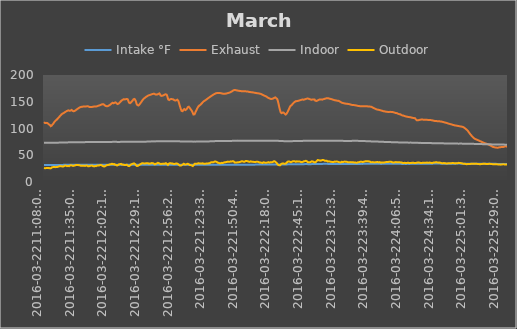
| Category | Intake °F | Exhaust | Indoor | Outdoor |
|---|---|---|---|---|
| 2016-03-2211:08:03 AM | 31.888 | 111.875 | 73.512 | 26.375 |
| 2016-03-2211:08:09 AM | 31.888 | 111.875 | 73.512 | 26.375 |
| 2016-03-2211:08:16 AM | 31.888 | 111.875 | 73.4 | 26.262 |
| 2016-03-2211:08:22 AM | 31.888 | 111.762 | 73.4 | 26.038 |
| 2016-03-2211:08:28 AM | 31.888 | 111.425 | 73.4 | 25.812 |
| 2016-03-2211:08:34 AM | 31.888 | 111.088 | 73.4 | 25.475 |
| 2016-03-2211:08:40 AM | 31.888 | 110.75 | 73.4 | 25.362 |
| 2016-03-2211:08:47 AM | 31.888 | 110.3 | 73.4 | 25.475 |
| 2016-03-2211:08:53 AM | 31.888 | 110.188 | 73.4 | 25.7 |
| 2016-03-2211:08:59 AM | 31.888 | 110.075 | 73.4 | 25.925 |
| 2016-03-2211:09:05 AM | 31.888 | 109.962 | 73.4 | 26.038 |
| 2016-03-2211:09:11 AM | 31.888 | 110.075 | 73.4 | 26.038 |
| 2016-03-2211:09:18 AM | 31.888 | 110.188 | 73.4 | 26.038 |
| 2016-03-2211:09:24 AM | 31.888 | 110.413 | 73.4 | 26.15 |
| 2016-03-2211:09:30 AM | 31.888 | 110.525 | 73.4 | 26.15 |
| 2016-03-2211:09:36 AM | 31.888 | 110.525 | 73.4 | 26.038 |
| 2016-03-2211:09:43 AM | 31.888 | 110.525 | 73.4 | 26.038 |
| 2016-03-2211:09:49 AM | 31.888 | 110.638 | 73.4 | 26.038 |
| 2016-03-2211:09:55 AM | 31.888 | 110.75 | 73.4 | 26.038 |
| 2016-03-2211:10:01 AM | 32 | 110.862 | 73.4 | 26.15 |
| 2016-03-2211:10:07 AM | 31.888 | 110.862 | 73.4 | 26.262 |
| 2016-03-2211:10:14 AM | 31.888 | 110.862 | 73.4 | 26.262 |
| 2016-03-2211:10:20 AM | 31.888 | 110.75 | 73.4 | 26.262 |
| 2016-03-2211:10:26 AM | 31.888 | 110.638 | 73.4 | 26.375 |
| 2016-03-2211:10:32 AM | 31.888 | 110.413 | 73.4 | 26.15 |
| 2016-03-2211:10:38 AM | 31.888 | 110.3 | 73.4 | 26.262 |
| 2016-03-2211:10:45 AM | 31.888 | 110.075 | 73.4 | 26.375 |
| 2016-03-2211:10:51 AM | 31.888 | 110.188 | 73.4 | 26.488 |
| 2016-03-2211:10:57 AM | 31.888 | 110.075 | 73.4 | 26.488 |
| 2016-03-2211:11:03 AM | 31.888 | 110.075 | 73.4 | 26.375 |
| 2016-03-2211:11:10 AM | 31.888 | 109.85 | 73.4 | 26.15 |
| 2016-03-2211:11:16 AM | 31.888 | 109.512 | 73.4 | 26.038 |
| 2016-03-2211:11:22 AM | 31.888 | 109.175 | 73.4 | 25.925 |
| 2016-03-2211:11:28 AM | 31.888 | 108.725 | 73.4 | 25.812 |
| 2016-03-2211:11:34 AM | 31.888 | 108.275 | 73.4 | 25.588 |
| 2016-03-2211:11:41 AM | 31.888 | 107.938 | 73.288 | 25.588 |
| 2016-03-2211:11:47 AM | 31.888 | 107.825 | 73.4 | 25.812 |
| 2016-03-2211:11:53 AM | 31.888 | 107.6 | 73.4 | 26.15 |
| 2016-03-2211:11:59 AM | 31.888 | 107.488 | 73.4 | 26.262 |
| 2016-03-2211:12:06 AM | 31.888 | 107.488 | 73.4 | 26.375 |
| 2016-03-2211:12:12 AM | 31.888 | 107.375 | 73.288 | 26.15 |
| 2016-03-2211:12:18 AM | 31.888 | 107.15 | 73.288 | 25.925 |
| 2016-03-2211:12:24 AM | 31.888 | 107.038 | 73.288 | 25.812 |
| 2016-03-2211:12:30 AM | 31.888 | 107.038 | 73.288 | 25.925 |
| 2016-03-2211:12:37 AM | 31.888 | 107.038 | 73.288 | 26.15 |
| 2016-03-2211:12:43 AM | 31.888 | 106.925 | 73.288 | 26.038 |
| 2016-03-2211:12:49 AM | 31.888 | 106.812 | 73.288 | 25.925 |
| 2016-03-2211:12:55 AM | 31.888 | 106.588 | 73.288 | 25.588 |
| 2016-03-2211:13:02 AM | 31.888 | 106.25 | 73.288 | 25.475 |
| 2016-03-2211:13:08 AM | 31.888 | 105.913 | 73.288 | 25.475 |
| 2016-03-2211:13:14 AM | 31.888 | 105.575 | 73.288 | 25.475 |
| 2016-03-2211:13:20 AM | 31.888 | 105.125 | 73.288 | 25.362 |
| 2016-03-2211:13:26 AM | 31.888 | 104.788 | 73.288 | 25.25 |
| 2016-03-2211:13:33 AM | 31.888 | 104.338 | 73.288 | 25.25 |
| 2016-03-2211:13:39 AM | 31.888 | 104.225 | 73.288 | 25.475 |
| 2016-03-2211:13:45 AM | 31.888 | 104.225 | 73.175 | 25.7 |
| 2016-03-2211:13:51 AM | 31.888 | 104.225 | 73.288 | 25.925 |
| 2016-03-2211:13:58 AM | 31.888 | 104.338 | 73.288 | 26.038 |
| 2016-03-2211:14:04 AM | 31.888 | 104.562 | 73.288 | 26.15 |
| 2016-03-2211:14:10 AM | 31.888 | 104.788 | 73.288 | 26.262 |
| 2016-03-2211:14:16 AM | 32 | 105.012 | 73.288 | 26.375 |
| 2016-03-2211:14:22 AM | 31.888 | 105.35 | 73.288 | 26.712 |
| 2016-03-2211:14:29 AM | 31.888 | 105.688 | 73.288 | 27.05 |
| 2016-03-2211:14:35 AM | 31.888 | 106.025 | 73.288 | 27.162 |
| 2016-03-2211:14:41 AM | 31.888 | 106.475 | 73.288 | 27.388 |
| 2016-03-2211:14:47 AM | 31.888 | 106.812 | 73.288 | 27.725 |
| 2016-03-2211:14:54 AM | 31.888 | 107.262 | 73.288 | 27.95 |
| 2016-03-2211:15:00 AM | 31.888 | 107.825 | 73.288 | 27.95 |
| 2016-03-2211:15:06 AM | 31.888 | 108.163 | 73.288 | 28.062 |
| 2016-03-2211:15:12 AM | 32 | 108.388 | 73.288 | 27.95 |
| 2016-03-2211:15:18 AM | 31.888 | 108.5 | 73.288 | 27.725 |
| 2016-03-2211:15:25 AM | 32 | 108.5 | 73.288 | 27.725 |
| 2016-03-2211:15:31 AM | 31.888 | 108.612 | 73.288 | 27.725 |
| 2016-03-2211:15:37 AM | 31.888 | 108.838 | 73.288 | 27.838 |
| 2016-03-2211:15:43 AM | 31.888 | 109.062 | 73.4 | 27.95 |
| 2016-03-2211:15:49 AM | 31.888 | 109.4 | 73.288 | 28.062 |
| 2016-03-2211:15:56 AM | 32 | 109.738 | 73.4 | 28.288 |
| 2016-03-2211:16:02 AM | 31.888 | 110.075 | 73.4 | 28.288 |
| 2016-03-2211:16:08 AM | 31.888 | 110.413 | 73.4 | 28.4 |
| 2016-03-2211:16:14 AM | 32 | 110.862 | 73.4 | 28.288 |
| 2016-03-2211:16:21 AM | 32 | 111.2 | 73.512 | 28.175 |
| 2016-03-2211:16:27 AM | 32 | 111.538 | 73.512 | 27.95 |
| 2016-03-2211:16:33 AM | 32 | 111.988 | 73.512 | 27.725 |
| 2016-03-2211:16:39 AM | 32 | 112.325 | 73.4 | 27.725 |
| 2016-03-2211:16:46 AM | 32 | 112.663 | 73.4 | 27.95 |
| 2016-03-2211:16:52 AM | 32 | 113.112 | 73.4 | 28.175 |
| 2016-03-2211:16:58 AM | 32 | 113.338 | 73.512 | 28.062 |
| 2016-03-2211:17:04 AM | 32 | 113.562 | 73.512 | 27.95 |
| 2016-03-2211:17:10 AM | 31.888 | 113.675 | 73.512 | 27.725 |
| 2016-03-2211:17:17 AM | 31.888 | 113.788 | 73.512 | 27.838 |
| 2016-03-2211:17:23 AM | 32 | 114.125 | 73.512 | 27.725 |
| 2016-03-2211:17:29 AM | 32 | 114.35 | 73.512 | 27.612 |
| 2016-03-2211:17:35 AM | 31.888 | 114.575 | 73.512 | 27.725 |
| 2016-03-2211:17:42 AM | 32 | 114.8 | 73.512 | 27.838 |
| 2016-03-2211:17:48 AM | 32 | 115.138 | 73.512 | 28.062 |
| 2016-03-2211:17:54 AM | 31.888 | 115.362 | 73.512 | 28.062 |
| 2016-03-2211:18:00 AM | 32 | 115.7 | 73.512 | 27.95 |
| 2016-03-2211:18:06 AM | 31.888 | 115.812 | 73.512 | 27.95 |
| 2016-03-2211:18:13 AM | 32 | 115.925 | 73.512 | 27.838 |
| 2016-03-2211:18:19 AM | 32 | 116.038 | 73.512 | 27.95 |
| 2016-03-2211:18:25 AM | 32 | 116.262 | 73.512 | 27.725 |
| 2016-03-2211:18:31 AM | 32 | 116.488 | 73.512 | 27.725 |
| 2016-03-2211:18:38 AM | 32 | 116.6 | 73.512 | 27.838 |
| 2016-03-2211:18:44 AM | 32 | 116.938 | 73.512 | 27.95 |
| 2016-03-2211:18:50 AM | 32 | 117.05 | 73.512 | 28.062 |
| 2016-03-2211:18:56 AM | 32 | 117.388 | 73.512 | 28.175 |
| 2016-03-2211:19:02 AM | 32 | 117.612 | 73.512 | 28.288 |
| 2016-03-2211:19:09 AM | 32 | 117.95 | 73.512 | 28.288 |
| 2016-03-2211:19:15 AM | 32 | 118.175 | 73.512 | 28.4 |
| 2016-03-2211:19:21 AM | 32 | 118.4 | 73.512 | 28.288 |
| 2016-03-2211:19:27 AM | 32 | 118.625 | 73.512 | 28.4 |
| 2016-03-2211:19:34 AM | 32 | 118.962 | 73.512 | 28.512 |
| 2016-03-2211:19:40 AM | 32 | 119.188 | 73.512 | 28.512 |
| 2016-03-2211:19:46 AM | 32 | 119.413 | 73.512 | 28.625 |
| 2016-03-2211:19:52 AM | 32 | 119.638 | 73.512 | 28.85 |
| 2016-03-2211:19:58 AM | 32 | 119.862 | 73.512 | 28.962 |
| 2016-03-2211:20:05 AM | 32 | 120.088 | 73.625 | 29.075 |
| 2016-03-2211:20:11 AM | 32 | 120.312 | 73.512 | 29.188 |
| 2016-03-2211:20:17 AM | 32 | 120.65 | 73.625 | 29.075 |
| 2016-03-2211:20:23 AM | 32 | 120.875 | 73.625 | 29.3 |
| 2016-03-2211:20:29 AM | 32 | 121.212 | 73.625 | 29.3 |
| 2016-03-2211:20:36 AM | 32 | 121.438 | 73.625 | 29.3 |
| 2016-03-2211:20:42 AM | 32 | 121.775 | 73.625 | 29.412 |
| 2016-03-2211:20:48 AM | 32 | 122.112 | 73.512 | 29.412 |
| 2016-03-2211:20:54 AM | 32 | 122.338 | 73.625 | 29.525 |
| 2016-03-2211:21:00 AM | 32 | 122.562 | 73.625 | 29.638 |
| 2016-03-2211:21:07 AM | 32 | 122.9 | 73.625 | 29.75 |
| 2016-03-2211:21:13 AM | 32 | 123.125 | 73.625 | 29.638 |
| 2016-03-2211:21:19 AM | 32 | 123.35 | 73.625 | 29.75 |
| 2016-03-2211:21:25 AM | 32 | 123.688 | 73.625 | 29.75 |
| 2016-03-2211:21:31 AM | 32 | 124.025 | 73.738 | 29.638 |
| 2016-03-2211:21:38 AM | 32 | 124.138 | 73.738 | 29.862 |
| 2016-03-2211:21:44 AM | 32 | 124.475 | 73.738 | 30.088 |
| 2016-03-2211:21:50 AM | 32 | 124.7 | 73.738 | 30.2 |
| 2016-03-2211:21:56 AM | 32 | 124.925 | 73.738 | 30.088 |
| 2016-03-2211:22:03 AM | 32 | 125.262 | 73.738 | 29.75 |
| 2016-03-2211:22:09 AM | 32 | 125.488 | 73.738 | 29.525 |
| 2016-03-2211:22:15 AM | 32 | 125.712 | 73.738 | 29.412 |
| 2016-03-2211:22:21 AM | 32 | 126.05 | 73.738 | 29.412 |
| 2016-03-2211:22:27 AM | 32 | 126.163 | 73.85 | 29.412 |
| 2016-03-2211:22:34 AM | 32 | 126.5 | 73.85 | 29.3 |
| 2016-03-2211:22:40 AM | 32 | 126.612 | 73.85 | 29.188 |
| 2016-03-2211:22:46 AM | 32 | 126.838 | 73.85 | 29.188 |
| 2016-03-2211:22:52 AM | 32 | 127.062 | 73.85 | 29.188 |
| 2016-03-2211:22:58 AM | 32 | 127.175 | 73.85 | 29.075 |
| 2016-03-2211:23:05 AM | 32 | 127.4 | 73.85 | 29.075 |
| 2016-03-2211:23:11 AM | 32.112 | 127.512 | 73.85 | 28.962 |
| 2016-03-2211:23:17 AM | 32 | 127.625 | 73.85 | 29.075 |
| 2016-03-2211:23:23 AM | 32 | 127.85 | 73.85 | 28.962 |
| 2016-03-2211:23:30 AM | 32.112 | 127.962 | 73.85 | 28.962 |
| 2016-03-2211:23:36 AM | 32.112 | 128.075 | 73.85 | 28.85 |
| 2016-03-2211:23:42 AM | 32.112 | 128.188 | 73.85 | 28.85 |
| 2016-03-2211:23:48 AM | 32 | 128.412 | 73.85 | 28.85 |
| 2016-03-2211:23:54 AM | 32 | 128.525 | 73.85 | 28.85 |
| 2016-03-2211:24:01 AM | 32 | 128.637 | 73.85 | 28.962 |
| 2016-03-2211:24:07 AM | 32 | 128.75 | 73.85 | 29.075 |
| 2016-03-2211:24:13 AM | 32 | 128.75 | 73.85 | 29.412 |
| 2016-03-2211:24:19 AM | 32 | 128.975 | 73.85 | 29.525 |
| 2016-03-2211:24:26 AM | 32 | 129.088 | 73.85 | 29.638 |
| 2016-03-2211:24:32 AM | 32.112 | 129.312 | 73.85 | 29.75 |
| 2016-03-2211:24:38 AM | 32.112 | 129.425 | 73.85 | 29.75 |
| 2016-03-2211:24:44 AM | 32.112 | 129.65 | 73.85 | 29.75 |
| 2016-03-2211:24:51 AM | 32.112 | 129.762 | 73.962 | 29.75 |
| 2016-03-2211:24:57 AM | 32.112 | 129.875 | 73.85 | 29.862 |
| 2016-03-2211:25:03 AM | 32 | 130.1 | 73.85 | 29.975 |
| 2016-03-2211:25:09 AM | 32.112 | 130.1 | 73.85 | 30.312 |
| 2016-03-2211:25:15 AM | 32.112 | 130.325 | 73.85 | 30.312 |
| 2016-03-2211:25:22 AM | 32 | 130.438 | 73.85 | 30.538 |
| 2016-03-2211:25:28 AM | 32.112 | 130.662 | 73.85 | 30.762 |
| 2016-03-2211:25:34 AM | 32.112 | 130.775 | 73.85 | 30.762 |
| 2016-03-2211:25:40 AM | 32 | 130.887 | 73.85 | 30.538 |
| 2016-03-2211:25:46 AM | 32.112 | 131.112 | 73.85 | 30.65 |
| 2016-03-2211:25:53 AM | 32.112 | 131.225 | 73.85 | 30.65 |
| 2016-03-2211:25:59 AM | 32.112 | 131.338 | 73.85 | 30.65 |
| 2016-03-2211:26:05 AM | 32.112 | 131.562 | 73.85 | 30.538 |
| 2016-03-2211:26:11 AM | 32.112 | 131.675 | 73.962 | 30.425 |
| 2016-03-2211:26:18 AM | 32.112 | 131.788 | 73.962 | 30.538 |
| 2016-03-2211:26:24 AM | 32.112 | 132.012 | 73.85 | 30.538 |
| 2016-03-2211:26:30 AM | 32.112 | 132.125 | 73.962 | 30.425 |
| 2016-03-2211:26:36 AM | 32.112 | 132.35 | 73.962 | 30.425 |
| 2016-03-2211:26:42 AM | 32.112 | 132.462 | 73.962 | 30.2 |
| 2016-03-2211:26:49 AM | 32.112 | 132.688 | 73.962 | 30.088 |
| 2016-03-2211:26:55 AM | 32.112 | 132.8 | 73.962 | 29.975 |
| 2016-03-2211:27:01 AM | 32 | 132.912 | 73.962 | 29.75 |
| 2016-03-2211:27:07 AM | 32.112 | 133.025 | 73.962 | 29.638 |
| 2016-03-2211:27:14 AM | 32.112 | 133.025 | 73.962 | 29.525 |
| 2016-03-2211:27:20 AM | 32.112 | 133.138 | 73.962 | 29.525 |
| 2016-03-2211:27:26 AM | 32.112 | 133.138 | 73.962 | 29.638 |
| 2016-03-2211:27:32 AM | 32.112 | 133.25 | 74.075 | 29.638 |
| 2016-03-2211:27:38 AM | 32.112 | 133.362 | 73.962 | 29.638 |
| 2016-03-2211:27:45 AM | 32.112 | 133.362 | 73.962 | 29.638 |
| 2016-03-2211:27:51 AM | 32.112 | 133.475 | 73.962 | 29.75 |
| 2016-03-2211:27:57 AM | 32.112 | 133.475 | 74.075 | 29.862 |
| 2016-03-2211:28:03 AM | 32.112 | 133.7 | 74.075 | 29.975 |
| 2016-03-2211:28:09 AM | 32.112 | 133.7 | 74.075 | 29.975 |
| 2016-03-2211:28:16 AM | 32.112 | 133.812 | 74.075 | 29.75 |
| 2016-03-2211:28:22 AM | 32.112 | 133.925 | 74.075 | 29.75 |
| 2016-03-2211:28:28 AM | 32.112 | 133.925 | 74.075 | 29.975 |
| 2016-03-2211:28:34 AM | 32.112 | 134.038 | 74.075 | 29.975 |
| 2016-03-2211:28:41 AM | 32 | 133.812 | 74.075 | 29.75 |
| 2016-03-2211:28:47 AM | 32.112 | 133.475 | 74.075 | 29.638 |
| 2016-03-2211:28:53 AM | 32.112 | 133.362 | 74.075 | 29.638 |
| 2016-03-2211:28:59 AM | 32.112 | 133.25 | 74.075 | 29.75 |
| 2016-03-2211:29:05 AM | 32.112 | 133.025 | 73.962 | 29.975 |
| 2016-03-2211:29:12 AM | 32.112 | 133.025 | 74.075 | 30.2 |
| 2016-03-2211:29:18 AM | 32.112 | 133.025 | 74.075 | 30.425 |
| 2016-03-2211:29:24 AM | 32.112 | 133.025 | 74.075 | 30.65 |
| 2016-03-2211:29:30 AM | 32.112 | 133.025 | 74.075 | 30.875 |
| 2016-03-2211:29:37 AM | 32.112 | 133.138 | 74.075 | 30.875 |
| 2016-03-2211:29:43 AM | 32.112 | 133.138 | 74.075 | 31.1 |
| 2016-03-2211:29:49 AM | 32.112 | 133.25 | 74.075 | 31.325 |
| 2016-03-2211:29:55 AM | 32.112 | 133.362 | 74.075 | 31.438 |
| 2016-03-2211:30:01 AM | 32.112 | 133.475 | 74.075 | 31.438 |
| 2016-03-2211:30:08 AM | 32.112 | 133.588 | 74.075 | 31.438 |
| 2016-03-2211:30:14 AM | 32.112 | 133.812 | 74.075 | 31.325 |
| 2016-03-2211:30:20 AM | 32.112 | 133.925 | 74.075 | 31.325 |
| 2016-03-2211:30:26 AM | 32.112 | 134.15 | 74.075 | 31.438 |
| 2016-03-2211:30:33 AM | 32.112 | 134.262 | 74.075 | 31.438 |
| 2016-03-2211:30:39 AM | 32.112 | 134.375 | 74.075 | 31.662 |
| 2016-03-2211:30:45 AM | 32.112 | 134.6 | 74.075 | 31.775 |
| 2016-03-2211:30:51 AM | 32.112 | 134.712 | 74.075 | 31.662 |
| 2016-03-2211:30:57 AM | 32.112 | 134.825 | 74.075 | 31.55 |
| 2016-03-2211:31:04 AM | 32.112 | 134.712 | 74.188 | 31.438 |
| 2016-03-2211:31:10 AM | 32.112 | 134.488 | 74.075 | 31.1 |
| 2016-03-2211:31:16 AM | 32.112 | 134.262 | 74.075 | 30.875 |
| 2016-03-2211:31:22 AM | 32.112 | 133.925 | 74.075 | 30.425 |
| 2016-03-2211:31:29 AM | 32.112 | 133.588 | 74.075 | 29.975 |
| 2016-03-2211:31:35 AM | 32.112 | 133.362 | 74.075 | 29.75 |
| 2016-03-2211:31:41 AM | 32.112 | 133.138 | 74.075 | 29.862 |
| 2016-03-2211:31:47 AM | 32.112 | 133.025 | 74.075 | 29.975 |
| 2016-03-2211:31:53 AM | 32.112 | 132.8 | 74.075 | 30.088 |
| 2016-03-2211:32:00 AM | 32.112 | 132.575 | 74.075 | 29.975 |
| 2016-03-2211:32:06 AM | 32.112 | 132.35 | 74.075 | 30.088 |
| 2016-03-2211:32:12 AM | 32.112 | 132.238 | 74.075 | 30.312 |
| 2016-03-2211:32:18 AM | 32.112 | 132.238 | 74.075 | 30.312 |
| 2016-03-2211:32:25 AM | 32.112 | 132.125 | 74.075 | 30.312 |
| 2016-03-2211:32:31 AM | 32.112 | 132.125 | 74.075 | 30.425 |
| 2016-03-2211:32:37 AM | 32.112 | 132.125 | 74.075 | 30.312 |
| 2016-03-2211:32:43 AM | 32.112 | 132.238 | 74.075 | 30.425 |
| 2016-03-2211:32:49 AM | 32.112 | 132.238 | 74.075 | 30.538 |
| 2016-03-2211:32:56 AM | 32.112 | 132.238 | 74.188 | 30.538 |
| 2016-03-2211:33:02 AM | 32.112 | 132.35 | 74.188 | 30.65 |
| 2016-03-2211:33:08 AM | 32.112 | 132.462 | 74.188 | 30.762 |
| 2016-03-2211:33:14 AM | 32.112 | 132.575 | 74.188 | 30.988 |
| 2016-03-2211:33:21 AM | 32.112 | 132.688 | 74.188 | 30.988 |
| 2016-03-2211:33:27 AM | 32.112 | 132.8 | 74.188 | 30.988 |
| 2016-03-2211:33:33 AM | 32.112 | 133.025 | 74.188 | 30.875 |
| 2016-03-2211:33:39 AM | 32.112 | 133.138 | 74.188 | 30.875 |
| 2016-03-2211:33:45 AM | 32.112 | 133.362 | 74.188 | 30.988 |
| 2016-03-2211:33:52 AM | 32.112 | 133.475 | 74.188 | 31.1 |
| 2016-03-2211:33:58 AM | 32.112 | 133.7 | 74.188 | 30.988 |
| 2016-03-2211:34:04 AM | 32.112 | 133.812 | 74.188 | 31.1 |
| 2016-03-2211:34:10 AM | 32.112 | 133.925 | 74.188 | 31.212 |
| 2016-03-2211:34:17 AM | 32.112 | 134.038 | 74.188 | 31.325 |
| 2016-03-2211:34:23 AM | 32.112 | 134.262 | 74.188 | 31.662 |
| 2016-03-2211:34:29 AM | 32.112 | 134.488 | 74.188 | 31.775 |
| 2016-03-2211:34:35 AM | 32.112 | 134.712 | 74.188 | 31.775 |
| 2016-03-2211:34:41 AM | 32.112 | 134.938 | 74.188 | 32 |
| 2016-03-2211:34:48 AM | 32.112 | 135.05 | 74.188 | 32 |
| 2016-03-2211:34:54 AM | 32.112 | 135.275 | 74.3 | 32 |
| 2016-03-2211:35:00 AM | 32.112 | 135.388 | 74.188 | 31.775 |
| 2016-03-2211:35:06 AM | 32.112 | 135.612 | 74.188 | 31.775 |
| 2016-03-2211:35:13 AM | 32.112 | 135.838 | 74.3 | 31.55 |
| 2016-03-2211:35:19 AM | 32.112 | 135.95 | 74.188 | 31.662 |
| 2016-03-2211:35:25 AM | 32.112 | 136.062 | 74.188 | 31.662 |
| 2016-03-2211:35:31 AM | 32.112 | 136.288 | 74.3 | 31.888 |
| 2016-03-2211:35:37 AM | 32.112 | 136.4 | 74.3 | 32.112 |
| 2016-03-2211:35:44 AM | 32.112 | 136.625 | 74.3 | 32.225 |
| 2016-03-2211:35:50 AM | 32.112 | 136.738 | 74.3 | 32.112 |
| 2016-03-2211:35:56 AM | 32.112 | 136.962 | 74.3 | 32.112 |
| 2016-03-2211:36:02 AM | 32.112 | 137.188 | 74.3 | 32.112 |
| 2016-03-2211:36:09 AM | 32.112 | 137.3 | 74.3 | 32 |
| 2016-03-2211:36:15 AM | 32.112 | 137.412 | 74.188 | 31.775 |
| 2016-03-2211:36:21 AM | 32.112 | 137.525 | 74.3 | 31.325 |
| 2016-03-2211:36:27 AM | 32.225 | 137.75 | 74.3 | 31.212 |
| 2016-03-2211:36:33 AM | 32.112 | 137.862 | 74.3 | 31.1 |
| 2016-03-2211:36:40 AM | 32.112 | 137.975 | 74.3 | 31.212 |
| 2016-03-2211:36:46 AM | 32.112 | 138.088 | 74.3 | 31.212 |
| 2016-03-2211:36:52 AM | 32.112 | 138.312 | 74.3 | 31.325 |
| 2016-03-2211:36:58 AM | 32.112 | 138.425 | 74.3 | 31.438 |
| 2016-03-2211:37:04 AM | 32.112 | 138.538 | 74.3 | 31.325 |
| 2016-03-2211:37:11 AM | 32.112 | 138.762 | 74.3 | 31.325 |
| 2016-03-2211:37:17 AM | 32.112 | 138.875 | 74.412 | 31.1 |
| 2016-03-2211:37:23 AM | 32.112 | 139.1 | 74.3 | 31.1 |
| 2016-03-2211:37:29 AM | 32.112 | 139.212 | 74.3 | 31.1 |
| 2016-03-2211:37:36 AM | 32.112 | 139.325 | 74.3 | 31.212 |
| 2016-03-2211:37:42 AM | 32.112 | 139.438 | 74.412 | 31.212 |
| 2016-03-2211:37:48 AM | 32.112 | 139.55 | 74.412 | 31.1 |
| 2016-03-2211:37:54 AM | 32.112 | 139.662 | 74.3 | 30.988 |
| 2016-03-2211:38:01 AM | 32.112 | 139.775 | 74.412 | 30.875 |
| 2016-03-2211:38:07 AM | 32.225 | 139.775 | 74.412 | 30.875 |
| 2016-03-2211:38:13 AM | 32.112 | 139.888 | 74.412 | 30.875 |
| 2016-03-2211:38:19 AM | 32.112 | 140 | 74.412 | 30.762 |
| 2016-03-2211:38:25 AM | 32.112 | 140.112 | 74.412 | 30.65 |
| 2016-03-2211:38:32 AM | 32.112 | 140.225 | 74.412 | 30.65 |
| 2016-03-2211:38:38 AM | 32.112 | 140.338 | 74.412 | 30.425 |
| 2016-03-2211:38:44 AM | 32.112 | 140.338 | 74.412 | 30.2 |
| 2016-03-2211:38:50 AM | 32.112 | 140.45 | 74.412 | 30.2 |
| 2016-03-2211:38:56 AM | 32.225 | 140.45 | 74.3 | 30.425 |
| 2016-03-2211:39:03 AM | 32.112 | 140.562 | 74.412 | 30.425 |
| 2016-03-2211:39:09 AM | 32.112 | 140.562 | 74.3 | 30.65 |
| 2016-03-2211:39:15 AM | 32.112 | 140.675 | 74.412 | 30.762 |
| 2016-03-2211:39:21 AM | 32.112 | 140.788 | 74.412 | 30.762 |
| 2016-03-2211:39:28 AM | 32.112 | 140.675 | 74.3 | 30.65 |
| 2016-03-2211:39:34 AM | 32.112 | 140.675 | 74.412 | 30.65 |
| 2016-03-2211:39:40 AM | 32.112 | 140.675 | 74.3 | 30.425 |
| 2016-03-2211:39:46 AM | 32.112 | 140.675 | 74.3 | 30.312 |
| 2016-03-2211:39:52 AM | 32.112 | 140.675 | 74.412 | 30.425 |
| 2016-03-2211:39:59 AM | 32.225 | 140.788 | 74.412 | 30.312 |
| 2016-03-2211:40:05 AM | 32.112 | 140.788 | 74.412 | 30.2 |
| 2016-03-2211:40:11 AM | 32.225 | 140.9 | 74.412 | 30.2 |
| 2016-03-2211:40:18 AM | 32.112 | 140.788 | 74.412 | 30.425 |
| 2016-03-2211:40:24 AM | 32.112 | 140.9 | 74.412 | 30.312 |
| 2016-03-2211:40:30 AM | 32.112 | 141.012 | 74.412 | 30.312 |
| 2016-03-2211:40:36 AM | 32.112 | 141.012 | 74.412 | 30.312 |
| 2016-03-2211:40:42 AM | 32.225 | 141.125 | 74.412 | 30.2 |
| 2016-03-2211:40:49 AM | 32.225 | 141.125 | 74.412 | 30.2 |
| 2016-03-2211:40:55 AM | 32.225 | 141.125 | 74.412 | 30.312 |
| 2016-03-2211:41:01 AM | 32.225 | 141.125 | 74.412 | 30.2 |
| 2016-03-2211:41:07 AM | 32.112 | 141.238 | 74.412 | 30.312 |
| 2016-03-2211:41:14 AM | 32.112 | 141.238 | 74.525 | 30.312 |
| 2016-03-2211:41:20 AM | 32.112 | 141.238 | 74.412 | 30.088 |
| 2016-03-2211:41:26 AM | 32.112 | 141.238 | 74.525 | 30.2 |
| 2016-03-2211:41:32 AM | 32.112 | 141.35 | 74.525 | 30.2 |
| 2016-03-2211:41:38 AM | 32.112 | 141.35 | 74.525 | 30.088 |
| 2016-03-2211:41:45 AM | 32.112 | 141.35 | 74.525 | 29.975 |
| 2016-03-2211:41:51 AM | 32.225 | 141.238 | 74.525 | 30.088 |
| 2016-03-2211:41:57 AM | 32.112 | 141.238 | 74.525 | 29.975 |
| 2016-03-2211:42:03 AM | 32.112 | 141.238 | 74.525 | 30.088 |
| 2016-03-2211:42:10 AM | 32.225 | 141.35 | 74.525 | 30.2 |
| 2016-03-2211:42:16 AM | 32.225 | 141.238 | 74.525 | 30.312 |
| 2016-03-2211:42:22 AM | 32.112 | 141.238 | 74.525 | 30.425 |
| 2016-03-2211:42:28 AM | 32.112 | 141.238 | 74.638 | 30.65 |
| 2016-03-2211:42:34 AM | 32.225 | 141.238 | 74.638 | 30.762 |
| 2016-03-2211:42:41 AM | 32.225 | 141.238 | 74.525 | 30.762 |
| 2016-03-2211:42:47 AM | 32.112 | 141.238 | 74.638 | 30.762 |
| 2016-03-2211:42:53 AM | 32.225 | 141.35 | 74.638 | 30.762 |
| 2016-03-2211:42:59 AM | 32.112 | 141.35 | 74.638 | 30.762 |
| 2016-03-2211:43:06 AM | 32.112 | 141.35 | 74.638 | 30.762 |
| 2016-03-2211:43:12 AM | 32.225 | 141.35 | 74.638 | 30.65 |
| 2016-03-2211:43:18 AM | 32.225 | 141.35 | 74.638 | 30.875 |
| 2016-03-2211:43:24 AM | 32.225 | 141.35 | 74.638 | 30.988 |
| 2016-03-2211:43:30 AM | 32.225 | 141.462 | 74.638 | 31.1 |
| 2016-03-2211:43:37 AM | 32.112 | 141.462 | 74.638 | 30.875 |
| 2016-03-2211:43:43 AM | 32.225 | 141.575 | 74.638 | 30.762 |
| 2016-03-2211:43:49 AM | 32.225 | 141.575 | 74.638 | 30.425 |
| 2016-03-2211:43:55 AM | 32.112 | 141.575 | 74.638 | 30.2 |
| 2016-03-2211:44:02 AM | 32.112 | 141.688 | 74.638 | 30.088 |
| 2016-03-2211:44:08 AM | 32.225 | 141.688 | 74.75 | 29.862 |
| 2016-03-2211:44:14 AM | 32.225 | 141.575 | 74.638 | 29.862 |
| 2016-03-2211:44:20 AM | 32.225 | 141.575 | 74.638 | 29.75 |
| 2016-03-2211:44:26 AM | 32.225 | 141.575 | 74.638 | 29.525 |
| 2016-03-2211:44:33 AM | 32.225 | 141.462 | 74.638 | 29.3 |
| 2016-03-2211:44:39 AM | 32.225 | 141.35 | 74.638 | 29.3 |
| 2016-03-2211:44:45 AM | 32.225 | 141.238 | 74.638 | 29.188 |
| 2016-03-2211:44:51 AM | 32.225 | 141.125 | 74.638 | 29.075 |
| 2016-03-2211:44:58 AM | 32.225 | 141.012 | 74.638 | 28.962 |
| 2016-03-2211:45:04 AM | 32.225 | 140.9 | 74.638 | 28.962 |
| 2016-03-2211:45:10 AM | 32.225 | 140.788 | 74.638 | 29.188 |
| 2016-03-2211:45:16 AM | 32.225 | 140.675 | 74.638 | 29.3 |
| 2016-03-2211:45:22 AM | 32.225 | 140.562 | 74.638 | 29.412 |
| 2016-03-2211:45:29 AM | 32.225 | 140.45 | 74.638 | 29.3 |
| 2016-03-2211:45:35 AM | 32.225 | 140.338 | 74.75 | 29.412 |
| 2016-03-2211:45:41 AM | 32.225 | 140.225 | 74.638 | 29.638 |
| 2016-03-2211:45:47 AM | 32.225 | 140.225 | 74.638 | 29.862 |
| 2016-03-2211:45:53 AM | 32.225 | 140.112 | 74.638 | 30.088 |
| 2016-03-2211:46:00 AM | 32.225 | 140.112 | 74.638 | 30.088 |
| 2016-03-2211:46:06 AM | 32.225 | 140 | 74.638 | 30.2 |
| 2016-03-2211:46:12 AM | 32.112 | 140 | 74.638 | 30.2 |
| 2016-03-2211:46:18 AM | 32.225 | 140 | 74.638 | 30.312 |
| 2016-03-2211:46:25 AM | 32.225 | 140 | 74.638 | 30.425 |
| 2016-03-2211:46:31 AM | 32.225 | 140 | 74.638 | 30.425 |
| 2016-03-2211:46:37 AM | 32.112 | 140 | 74.638 | 30.65 |
| 2016-03-2211:46:43 AM | 32.225 | 140 | 74.638 | 30.538 |
| 2016-03-2211:46:49 AM | 32.225 | 140 | 74.638 | 30.65 |
| 2016-03-2211:46:56 AM | 32.225 | 140 | 74.638 | 30.538 |
| 2016-03-2211:47:02 AM | 32.225 | 140.112 | 74.638 | 30.538 |
| 2016-03-2211:47:08 AM | 32.225 | 140.112 | 74.638 | 30.65 |
| 2016-03-2211:47:14 AM | 32.225 | 140.112 | 74.638 | 30.762 |
| 2016-03-2211:47:21 AM | 32.225 | 140.112 | 74.638 | 30.875 |
| 2016-03-2211:47:27 AM | 32.225 | 140.112 | 74.638 | 30.988 |
| 2016-03-2211:47:33 AM | 32.225 | 140.112 | 74.638 | 30.875 |
| 2016-03-2211:47:39 AM | 32.225 | 140.225 | 74.638 | 30.988 |
| 2016-03-2211:47:45 AM | 32.225 | 140.225 | 74.638 | 30.988 |
| 2016-03-2211:47:52 AM | 32.225 | 140.225 | 74.638 | 30.875 |
| 2016-03-2211:47:58 AM | 32.225 | 140.338 | 74.638 | 30.762 |
| 2016-03-2211:48:04 AM | 32.225 | 140.338 | 74.638 | 30.538 |
| 2016-03-2211:48:10 AM | 32.225 | 140.338 | 74.638 | 30.425 |
| 2016-03-2211:48:16 AM | 32.112 | 140.45 | 74.638 | 30.2 |
| 2016-03-2211:48:23 AM | 32.225 | 140.562 | 74.638 | 29.862 |
| 2016-03-2211:48:29 AM | 32.225 | 140.675 | 74.638 | 29.975 |
| 2016-03-2211:48:35 AM | 32.225 | 140.675 | 74.638 | 29.862 |
| 2016-03-2211:48:41 AM | 32.225 | 140.788 | 74.638 | 29.638 |
| 2016-03-2211:48:48 AM | 32.225 | 140.9 | 74.638 | 29.638 |
| 2016-03-2211:48:54 AM | 32.225 | 140.9 | 74.638 | 29.525 |
| 2016-03-2211:49:00 AM | 32.112 | 140.9 | 74.638 | 29.638 |
| 2016-03-2211:49:06 AM | 32.225 | 140.9 | 74.638 | 29.525 |
| 2016-03-2211:49:13 AM | 32.225 | 140.9 | 74.638 | 29.412 |
| 2016-03-2211:49:19 AM | 32.225 | 141.012 | 74.638 | 29.525 |
| 2016-03-2211:49:25 AM | 32.225 | 141.012 | 74.638 | 29.188 |
| 2016-03-2211:49:31 AM | 32.225 | 141.012 | 74.638 | 29.188 |
| 2016-03-2211:49:37 AM | 32.225 | 141.012 | 74.638 | 29.525 |
| 2016-03-2211:49:44 AM | 32.225 | 141.012 | 74.638 | 29.75 |
| 2016-03-2211:49:50 AM | 32.225 | 140.9 | 74.638 | 29.862 |
| 2016-03-2211:49:56 AM | 32.225 | 140.9 | 74.638 | 29.862 |
| 2016-03-2211:50:02 AM | 32.225 | 140.9 | 74.75 | 29.75 |
| 2016-03-2211:50:09 AM | 32.225 | 140.9 | 74.75 | 29.862 |
| 2016-03-2211:50:15 AM | 32.225 | 140.9 | 74.75 | 29.975 |
| 2016-03-2211:50:21 AM | 32.225 | 140.9 | 74.638 | 29.862 |
| 2016-03-2211:50:27 AM | 32.225 | 141.012 | 74.638 | 29.75 |
| 2016-03-2211:50:33 AM | 32.225 | 141.012 | 74.75 | 29.75 |
| 2016-03-2211:50:40 AM | 32.225 | 141.012 | 74.75 | 29.75 |
| 2016-03-2211:50:46 AM | 32.225 | 141.012 | 74.75 | 29.75 |
| 2016-03-2211:50:52 AM | 32.225 | 141.012 | 74.75 | 29.638 |
| 2016-03-2211:50:58 AM | 32.225 | 141.125 | 74.75 | 29.638 |
| 2016-03-2211:51:05 AM | 32.225 | 141.125 | 74.75 | 29.638 |
| 2016-03-2211:51:11 AM | 32.225 | 141.238 | 74.75 | 29.638 |
| 2016-03-2211:51:17 AM | 32.225 | 141.238 | 74.75 | 29.862 |
| 2016-03-2211:51:23 AM | 32.112 | 141.238 | 74.75 | 29.975 |
| 2016-03-2211:51:29 AM | 32.225 | 141.35 | 74.75 | 30.2 |
| 2016-03-2211:51:36 AM | 32.225 | 141.35 | 74.75 | 30.312 |
| 2016-03-2211:51:42 AM | 32.225 | 141.35 | 74.75 | 30.425 |
| 2016-03-2211:51:48 AM | 32.225 | 141.462 | 74.75 | 30.425 |
| 2016-03-2211:51:54 AM | 32.225 | 141.462 | 74.75 | 30.65 |
| 2016-03-2211:52:01 AM | 32.225 | 141.575 | 74.75 | 30.762 |
| 2016-03-2211:52:07 AM | 32.225 | 141.688 | 74.75 | 30.538 |
| 2016-03-2211:52:13 AM | 32.225 | 141.8 | 74.75 | 30.65 |
| 2016-03-2211:52:19 AM | 32.225 | 141.8 | 74.75 | 30.875 |
| 2016-03-2211:52:25 AM | 32.225 | 141.912 | 74.75 | 30.988 |
| 2016-03-2211:52:32 AM | 32.225 | 142.025 | 74.75 | 31.212 |
| 2016-03-2211:52:38 AM | 32.225 | 142.138 | 74.638 | 31.1 |
| 2016-03-2211:52:44 AM | 32.225 | 142.25 | 74.638 | 31.1 |
| 2016-03-2211:52:50 AM | 32.225 | 142.25 | 74.638 | 30.988 |
| 2016-03-2211:52:56 AM | 32.225 | 142.362 | 74.638 | 30.762 |
| 2016-03-2211:53:03 AM | 32.225 | 142.475 | 74.75 | 30.65 |
| 2016-03-2211:53:09 AM | 32.225 | 142.475 | 74.75 | 30.538 |
| 2016-03-2211:53:15 AM | 32.225 | 142.7 | 74.75 | 30.425 |
| 2016-03-2211:53:21 AM | 32.225 | 142.7 | 74.75 | 30.538 |
| 2016-03-2211:53:28 AM | 32.225 | 142.812 | 74.75 | 30.65 |
| 2016-03-2211:53:34 AM | 32.225 | 142.925 | 74.75 | 30.762 |
| 2016-03-2211:53:40 AM | 32.225 | 143.038 | 74.75 | 30.875 |
| 2016-03-2211:53:46 AM | 32.225 | 143.038 | 74.75 | 30.875 |
| 2016-03-2211:53:52 AM | 32.225 | 143.15 | 74.75 | 31.1 |
| 2016-03-2211:53:59 AM | 32.225 | 143.262 | 74.75 | 31.325 |
| 2016-03-2211:54:05 AM | 32.225 | 143.262 | 74.75 | 31.438 |
| 2016-03-2211:54:11 AM | 32.225 | 143.375 | 74.75 | 31.438 |
| 2016-03-2211:54:17 AM | 32.225 | 143.488 | 74.862 | 31.662 |
| 2016-03-2211:54:24 AM | 32.225 | 143.488 | 74.75 | 31.662 |
| 2016-03-2211:54:30 AM | 32.225 | 143.6 | 74.862 | 31.662 |
| 2016-03-2211:54:36 AM | 32.225 | 143.712 | 74.75 | 31.888 |
| 2016-03-2211:54:42 AM | 32.225 | 143.825 | 74.862 | 31.775 |
| 2016-03-2211:54:48 AM | 32.225 | 143.938 | 74.75 | 31.55 |
| 2016-03-2211:54:55 AM | 32.225 | 144.05 | 74.862 | 31.662 |
| 2016-03-2211:55:01 AM | 32.225 | 144.162 | 74.862 | 31.55 |
| 2016-03-2211:55:07 AM | 32.225 | 144.275 | 74.862 | 31.438 |
| 2016-03-2211:55:13 AM | 32.225 | 144.388 | 74.862 | 31.55 |
| 2016-03-2211:55:20 AM | 32.225 | 144.5 | 74.862 | 31.55 |
| 2016-03-2211:55:26 AM | 32.225 | 144.5 | 74.975 | 31.325 |
| 2016-03-2211:55:32 AM | 32.225 | 144.725 | 74.975 | 30.988 |
| 2016-03-2211:55:38 AM | 32.225 | 144.725 | 74.862 | 30.988 |
| 2016-03-2211:55:44 AM | 32.225 | 144.838 | 74.862 | 30.875 |
| 2016-03-2211:55:51 AM | 32.225 | 144.95 | 74.862 | 30.875 |
| 2016-03-2211:55:57 AM | 32.225 | 145.062 | 74.862 | 30.875 |
| 2016-03-2211:56:03 AM | 32.225 | 145.062 | 74.975 | 30.875 |
| 2016-03-2211:56:09 AM | 32.225 | 145.175 | 74.975 | 30.875 |
| 2016-03-2211:56:15 AM | 32.225 | 145.288 | 74.975 | 30.65 |
| 2016-03-2211:56:22 AM | 32.225 | 145.288 | 74.975 | 30.425 |
| 2016-03-2211:56:28 AM | 32.225 | 145.4 | 74.975 | 30.312 |
| 2016-03-2211:56:34 AM | 32.225 | 145.4 | 74.975 | 30.2 |
| 2016-03-2211:56:40 AM | 32.225 | 145.512 | 74.975 | 29.975 |
| 2016-03-2211:56:47 AM | 32.225 | 145.512 | 74.975 | 29.862 |
| 2016-03-2211:56:53 AM | 32.225 | 145.512 | 74.975 | 29.862 |
| 2016-03-2211:56:59 AM | 32.225 | 145.4 | 74.975 | 29.638 |
| 2016-03-2211:57:05 AM | 32.225 | 145.512 | 74.975 | 29.412 |
| 2016-03-2211:57:11 AM | 32.225 | 145.4 | 74.975 | 29.3 |
| 2016-03-2211:57:18 AM | 32.225 | 145.288 | 74.975 | 29.075 |
| 2016-03-2211:57:24 AM | 32.225 | 145.288 | 74.975 | 28.738 |
| 2016-03-2211:57:30 AM | 32.225 | 145.175 | 74.975 | 28.738 |
| 2016-03-2211:57:36 AM | 32.225 | 145.062 | 74.862 | 28.85 |
| 2016-03-2211:57:42 AM | 32.225 | 144.838 | 74.862 | 28.962 |
| 2016-03-2211:57:49 AM | 32.225 | 144.612 | 74.862 | 28.962 |
| 2016-03-2211:57:55 AM | 32.225 | 144.388 | 74.862 | 28.962 |
| 2016-03-2211:58:01 AM | 32.225 | 144.162 | 74.975 | 29.075 |
| 2016-03-2211:58:07 AM | 32.225 | 144.05 | 74.862 | 29.188 |
| 2016-03-2211:58:13 AM | 32.225 | 143.712 | 74.862 | 29.412 |
| 2016-03-2211:58:20 AM | 32.225 | 143.6 | 74.975 | 29.525 |
| 2016-03-2211:58:26 AM | 32.225 | 143.262 | 74.975 | 29.525 |
| 2016-03-2211:58:32 AM | 32.225 | 143.15 | 74.975 | 29.525 |
| 2016-03-2211:58:38 AM | 32.225 | 142.925 | 74.975 | 29.525 |
| 2016-03-2211:58:45 AM | 32.338 | 142.7 | 74.975 | 29.75 |
| 2016-03-2211:58:51 AM | 32.225 | 142.588 | 74.975 | 29.862 |
| 2016-03-2211:58:57 AM | 32.225 | 142.362 | 74.975 | 29.975 |
| 2016-03-2211:59:03 AM | 32.225 | 142.25 | 74.975 | 29.975 |
| 2016-03-2211:59:09 AM | 32.225 | 142.138 | 74.975 | 30.312 |
| 2016-03-2211:59:16 AM | 32.225 | 142.025 | 74.975 | 30.65 |
| 2016-03-2211:59:22 AM | 32.225 | 142.025 | 74.975 | 30.875 |
| 2016-03-2211:59:28 AM | 32.225 | 141.912 | 74.975 | 30.988 |
| 2016-03-2211:59:34 AM | 32.225 | 141.912 | 74.975 | 30.988 |
| 2016-03-2211:59:41 AM | 32.225 | 141.8 | 74.975 | 30.988 |
| 2016-03-2211:59:47 AM | 32.225 | 141.8 | 74.975 | 30.988 |
| 2016-03-2211:59:53 AM | 32.225 | 141.688 | 74.975 | 31.1 |
| 2016-03-2211:59:59 AM | 32.225 | 141.688 | 74.975 | 31.325 |
| 2016-03-2212:00:05 PM | 32.225 | 141.688 | 74.975 | 31.438 |
| 2016-03-2212:00:12 PM | 32.225 | 141.688 | 74.975 | 31.438 |
| 2016-03-2212:00:18 PM | 32.225 | 141.688 | 74.975 | 31.55 |
| 2016-03-2212:00:24 PM | 32.225 | 141.688 | 74.975 | 31.55 |
| 2016-03-2212:00:30 PM | 32.225 | 141.8 | 74.975 | 31.55 |
| 2016-03-2212:00:37 PM | 32.225 | 141.8 | 74.975 | 31.662 |
| 2016-03-2212:00:43 PM | 32.225 | 141.8 | 74.975 | 31.775 |
| 2016-03-2212:00:49 PM | 32.225 | 141.912 | 74.975 | 31.888 |
| 2016-03-2212:00:55 PM | 32.225 | 142.025 | 74.862 | 31.888 |
| 2016-03-2212:01:01 PM | 32.338 | 142.138 | 74.975 | 31.888 |
| 2016-03-2212:01:08 PM | 32.225 | 142.138 | 74.975 | 31.775 |
| 2016-03-2212:01:14 PM | 32.225 | 142.25 | 74.975 | 31.662 |
| 2016-03-2212:01:20 PM | 32.225 | 142.362 | 74.975 | 31.775 |
| 2016-03-2212:01:26 PM | 32.225 | 142.475 | 74.975 | 32 |
| 2016-03-2212:01:33 PM | 32.225 | 142.588 | 74.975 | 32.112 |
| 2016-03-2212:01:39 PM | 32.225 | 142.7 | 74.975 | 32.112 |
| 2016-03-2212:01:45 PM | 32.225 | 142.812 | 74.975 | 32.112 |
| 2016-03-2212:01:51 PM | 32.225 | 142.925 | 74.975 | 32.225 |
| 2016-03-2212:01:57 PM | 32.225 | 143.15 | 74.975 | 32.338 |
| 2016-03-2212:02:04 PM | 32.225 | 143.375 | 74.975 | 32.225 |
| 2016-03-2212:02:10 PM | 32.225 | 143.488 | 74.975 | 32.45 |
| 2016-03-2212:02:16 PM | 32.225 | 143.6 | 74.975 | 32.675 |
| 2016-03-2212:02:22 PM | 32.225 | 143.712 | 74.975 | 33.125 |
| 2016-03-2212:02:29 PM | 32.225 | 143.938 | 74.862 | 33.238 |
| 2016-03-2212:02:35 PM | 32.225 | 144.05 | 74.975 | 33.35 |
| 2016-03-2212:02:41 PM | 32.225 | 144.275 | 74.862 | 33.35 |
| 2016-03-2212:02:47 PM | 32.225 | 144.388 | 74.975 | 33.012 |
| 2016-03-2212:02:54 PM | 32.225 | 144.5 | 74.975 | 32.788 |
| 2016-03-2212:03:00 PM | 32.225 | 144.725 | 74.862 | 32.788 |
| 2016-03-2212:03:06 PM | 32.225 | 144.95 | 74.862 | 33.012 |
| 2016-03-2212:03:12 PM | 32.225 | 145.062 | 74.975 | 33.125 |
| 2016-03-2212:03:18 PM | 32.225 | 145.288 | 74.975 | 33.012 |
| 2016-03-2212:03:25 PM | 32.225 | 145.512 | 74.975 | 33.125 |
| 2016-03-2212:03:31 PM | 32.225 | 145.738 | 74.975 | 33.125 |
| 2016-03-2212:03:37 PM | 32.225 | 145.85 | 74.975 | 33.125 |
| 2016-03-2212:03:43 PM | 32.225 | 146.075 | 74.975 | 33.238 |
| 2016-03-2212:03:50 PM | 32.225 | 146.3 | 74.975 | 33.238 |
| 2016-03-2212:03:56 PM | 32.225 | 146.525 | 74.975 | 33.238 |
| 2016-03-2212:04:02 PM | 32.225 | 146.75 | 75.088 | 33.462 |
| 2016-03-2212:04:08 PM | 32.225 | 146.975 | 75.088 | 33.575 |
| 2016-03-2212:04:14 PM | 32.225 | 147.2 | 75.088 | 33.8 |
| 2016-03-2212:04:21 PM | 32.225 | 147.425 | 75.088 | 34.025 |
| 2016-03-2212:04:27 PM | 32.225 | 147.538 | 74.975 | 34.138 |
| 2016-03-2212:04:33 PM | 32.225 | 147.875 | 74.975 | 33.912 |
| 2016-03-2212:04:39 PM | 32.225 | 147.988 | 74.975 | 34.025 |
| 2016-03-2212:04:45 PM | 32.225 | 148.212 | 74.975 | 34.025 |
| 2016-03-2212:04:52 PM | 32.225 | 148.1 | 74.975 | 33.8 |
| 2016-03-2212:04:58 PM | 32.225 | 148.1 | 74.975 | 33.688 |
| 2016-03-2212:05:04 PM | 32.338 | 147.988 | 75.088 | 33.575 |
| 2016-03-2212:05:10 PM | 32.338 | 147.65 | 74.975 | 33.462 |
| 2016-03-2212:05:17 PM | 32.225 | 147.312 | 75.088 | 33.125 |
| 2016-03-2212:05:23 PM | 32.225 | 147.2 | 75.088 | 33.125 |
| 2016-03-2212:05:29 PM | 32.225 | 147.2 | 75.088 | 33.238 |
| 2016-03-2212:05:35 PM | 32.225 | 147.2 | 75.088 | 33.35 |
| 2016-03-2212:05:41 PM | 32.338 | 147.2 | 75.088 | 33.462 |
| 2016-03-2212:05:48 PM | 32.225 | 147.312 | 75.088 | 33.462 |
| 2016-03-2212:05:54 PM | 32.225 | 147.425 | 75.088 | 33.688 |
| 2016-03-2212:06:00 PM | 32.225 | 147.538 | 75.088 | 33.8 |
| 2016-03-2212:06:06 PM | 32.225 | 147.65 | 75.088 | 33.688 |
| 2016-03-2212:06:12 PM | 32.338 | 147.875 | 75.088 | 33.688 |
| 2016-03-2212:06:19 PM | 32.225 | 147.988 | 75.088 | 33.575 |
| 2016-03-2212:06:25 PM | 32.225 | 148.1 | 75.088 | 33.125 |
| 2016-03-2212:06:31 PM | 32.225 | 148.212 | 75.088 | 33.012 |
| 2016-03-2212:06:37 PM | 32.225 | 148.438 | 75.088 | 32.788 |
| 2016-03-2212:06:44 PM | 32.225 | 148.55 | 75.088 | 32.675 |
| 2016-03-2212:06:50 PM | 32.225 | 148.662 | 75.088 | 32.675 |
| 2016-03-2212:06:56 PM | 32.225 | 148.888 | 75.088 | 32.225 |
| 2016-03-2212:07:02 PM | 32.225 | 149 | 75.088 | 32.112 |
| 2016-03-2212:07:08 PM | 32.225 | 148.888 | 75.088 | 31.888 |
| 2016-03-2212:07:15 PM | 32.225 | 148.888 | 75.088 | 31.888 |
| 2016-03-2212:07:21 PM | 32.225 | 148.775 | 75.088 | 31.775 |
| 2016-03-2212:07:27 PM | 32.225 | 148.662 | 75.088 | 31.662 |
| 2016-03-2212:07:33 PM | 32.225 | 148.325 | 75.088 | 31.775 |
| 2016-03-2212:07:40 PM | 32.225 | 148.212 | 75.088 | 31.888 |
| 2016-03-2212:07:46 PM | 32.225 | 147.875 | 75.088 | 32 |
| 2016-03-2212:07:52 PM | 32.225 | 147.538 | 75.088 | 31.888 |
| 2016-03-2212:07:59 PM | 32.225 | 147.312 | 75.088 | 31.888 |
| 2016-03-2212:08:05 PM | 32.338 | 147.088 | 74.975 | 31.775 |
| 2016-03-2212:08:11 PM | 32.225 | 147.088 | 74.975 | 31.662 |
| 2016-03-2212:08:17 PM | 32.225 | 146.975 | 75.088 | 31.662 |
| 2016-03-2212:08:23 PM | 32.338 | 146.975 | 75.088 | 31.55 |
| 2016-03-2212:08:30 PM | 32.225 | 146.75 | 74.975 | 31.1 |
| 2016-03-2212:08:36 PM | 32.225 | 146.525 | 74.975 | 30.875 |
| 2016-03-2212:08:42 PM | 32.225 | 146.188 | 74.975 | 30.762 |
| 2016-03-2212:08:48 PM | 32.338 | 146.075 | 74.975 | 30.762 |
| 2016-03-2212:08:55 PM | 32.225 | 145.85 | 74.975 | 30.988 |
| 2016-03-2212:09:01 PM | 32.225 | 145.738 | 74.862 | 31.325 |
| 2016-03-2212:09:07 PM | 32.338 | 145.738 | 74.975 | 31.438 |
| 2016-03-2212:09:13 PM | 32.338 | 145.85 | 74.975 | 31.55 |
| 2016-03-2212:09:19 PM | 32.225 | 145.85 | 74.975 | 31.775 |
| 2016-03-2212:09:26 PM | 32.225 | 145.962 | 74.975 | 31.775 |
| 2016-03-2212:09:32 PM | 32.225 | 146.075 | 74.862 | 32 |
| 2016-03-2212:09:38 PM | 32.338 | 146.188 | 74.975 | 32.225 |
| 2016-03-2212:09:44 PM | 32.338 | 146.3 | 74.862 | 32.225 |
| 2016-03-2212:09:50 PM | 32.225 | 146.525 | 74.975 | 32.45 |
| 2016-03-2212:09:57 PM | 32.338 | 146.638 | 74.975 | 32.675 |
| 2016-03-2212:10:03 PM | 32.225 | 146.862 | 74.975 | 32.675 |
| 2016-03-2212:10:09 PM | 32.225 | 146.975 | 74.975 | 32.788 |
| 2016-03-2212:10:15 PM | 32.225 | 147.312 | 74.975 | 33.012 |
| 2016-03-2212:10:22 PM | 32.338 | 147.538 | 74.975 | 33.125 |
| 2016-03-2212:10:28 PM | 32.338 | 147.763 | 74.975 | 33.238 |
| 2016-03-2212:10:34 PM | 32.338 | 147.988 | 74.975 | 33.462 |
| 2016-03-2212:10:40 PM | 32.225 | 148.212 | 74.975 | 33.35 |
| 2016-03-2212:10:46 PM | 32.338 | 148.438 | 74.975 | 33.35 |
| 2016-03-2212:10:53 PM | 32.338 | 148.775 | 74.975 | 33.238 |
| 2016-03-2212:10:59 PM | 32.225 | 149 | 74.975 | 33.238 |
| 2016-03-2212:11:05 PM | 32.338 | 149.225 | 74.975 | 33.35 |
| 2016-03-2212:11:11 PM | 32.338 | 149.562 | 74.975 | 33.575 |
| 2016-03-2212:11:17 PM | 32.225 | 149.788 | 74.975 | 33.8 |
| 2016-03-2212:11:24 PM | 32.225 | 150.013 | 74.975 | 34.025 |
| 2016-03-2212:11:30 PM | 32.225 | 150.35 | 75.088 | 34.138 |
| 2016-03-2212:11:36 PM | 32.225 | 150.575 | 75.088 | 34.025 |
| 2016-03-2212:11:42 PM | 32.225 | 150.8 | 75.088 | 33.912 |
| 2016-03-2212:11:48 PM | 32.338 | 151.025 | 75.088 | 33.912 |
| 2016-03-2212:11:55 PM | 32.338 | 151.25 | 75.088 | 33.8 |
| 2016-03-2212:12:01 PM | 32.225 | 151.475 | 75.088 | 33.462 |
| 2016-03-2212:12:07 PM | 32.225 | 151.7 | 75.088 | 33.238 |
| 2016-03-2212:12:13 PM | 32.225 | 151.925 | 75.088 | 33.125 |
| 2016-03-2212:12:19 PM | 32.225 | 152.15 | 75.088 | 32.9 |
| 2016-03-2212:12:26 PM | 32.225 | 152.263 | 75.088 | 32.675 |
| 2016-03-2212:12:32 PM | 32.225 | 152.488 | 75.088 | 32.788 |
| 2016-03-2212:12:38 PM | 32.225 | 152.712 | 75.088 | 32.9 |
| 2016-03-2212:12:44 PM | 32.225 | 152.938 | 75.088 | 32.45 |
| 2016-03-2212:12:51 PM | 32.225 | 153.05 | 75.088 | 32.45 |
| 2016-03-2212:12:57 PM | 32.225 | 153.275 | 75.088 | 32.562 |
| 2016-03-2212:13:03 PM | 32.225 | 153.388 | 75.088 | 32.45 |
| 2016-03-2212:13:09 PM | 32.225 | 153.612 | 75.088 | 32.338 |
| 2016-03-2212:13:15 PM | 32.225 | 153.838 | 75.088 | 32.338 |
| 2016-03-2212:13:22 PM | 32.338 | 153.95 | 75.088 | 32.562 |
| 2016-03-2212:13:28 PM | 32.225 | 154.062 | 75.088 | 32.675 |
| 2016-03-2212:13:34 PM | 32.338 | 154.288 | 75.088 | 32.562 |
| 2016-03-2212:13:40 PM | 32.225 | 154.4 | 75.088 | 32.562 |
| 2016-03-2212:13:46 PM | 32.225 | 154.625 | 75.088 | 32.675 |
| 2016-03-2212:13:53 PM | 32.225 | 154.738 | 75.088 | 32.45 |
| 2016-03-2212:13:59 PM | 32.338 | 154.625 | 75.2 | 32.338 |
| 2016-03-2212:14:05 PM | 32.225 | 154.625 | 75.2 | 32.112 |
| 2016-03-2212:14:11 PM | 32.338 | 154.513 | 75.2 | 32.112 |
| 2016-03-2212:14:18 PM | 32.225 | 154.513 | 75.2 | 32.112 |
| 2016-03-2212:14:24 PM | 32.225 | 154.513 | 75.2 | 32 |
| 2016-03-2212:14:30 PM | 32.225 | 154.513 | 75.2 | 31.888 |
| 2016-03-2212:14:36 PM | 32.225 | 154.4 | 75.2 | 31.775 |
| 2016-03-2212:14:42 PM | 32.225 | 154.4 | 75.2 | 31.775 |
| 2016-03-2212:14:49 PM | 32.338 | 154.4 | 75.2 | 31.775 |
| 2016-03-2212:14:55 PM | 32.225 | 154.4 | 75.312 | 31.888 |
| 2016-03-2212:15:01 PM | 32.338 | 154.4 | 75.312 | 31.775 |
| 2016-03-2212:15:07 PM | 32.225 | 154.4 | 75.312 | 31.775 |
| 2016-03-2212:15:13 PM | 32.338 | 154.4 | 75.312 | 31.888 |
| 2016-03-2212:15:20 PM | 32.225 | 154.4 | 75.312 | 31.662 |
| 2016-03-2212:15:26 PM | 32.338 | 154.513 | 75.312 | 31.888 |
| 2016-03-2212:15:32 PM | 32.225 | 154.513 | 75.312 | 32 |
| 2016-03-2212:15:38 PM | 32.225 | 154.625 | 75.312 | 32.225 |
| 2016-03-2212:15:45 PM | 32.225 | 154.625 | 75.425 | 32.338 |
| 2016-03-2212:15:51 PM | 32.225 | 154.738 | 75.425 | 32.225 |
| 2016-03-2212:15:58 PM | 32.338 | 154.85 | 75.425 | 32 |
| 2016-03-2212:16:04 PM | 32.225 | 154.85 | 75.425 | 32 |
| 2016-03-2212:16:10 PM | 32.338 | 154.962 | 75.425 | 32.112 |
| 2016-03-2212:16:16 PM | 32.225 | 155.075 | 75.425 | 32.112 |
| 2016-03-2212:16:22 PM | 32.338 | 155.075 | 75.425 | 32.112 |
| 2016-03-2212:16:29 PM | 32.225 | 155.075 | 75.425 | 32.338 |
| 2016-03-2212:16:35 PM | 32.225 | 155.188 | 75.312 | 32.45 |
| 2016-03-2212:16:41 PM | 32.338 | 155.075 | 75.312 | 32.45 |
| 2016-03-2212:16:47 PM | 32.225 | 154.962 | 75.312 | 32.338 |
| 2016-03-2212:16:53 PM | 32.338 | 154.962 | 75.312 | 32.225 |
| 2016-03-2212:17:00 PM | 32.225 | 154.962 | 75.312 | 31.888 |
| 2016-03-2212:17:06 PM | 32.225 | 154.85 | 75.312 | 31.662 |
| 2016-03-2212:17:12 PM | 32.225 | 154.85 | 75.312 | 31.55 |
| 2016-03-2212:17:18 PM | 32.338 | 154.85 | 75.425 | 31.55 |
| 2016-03-2212:17:24 PM | 32.225 | 154.513 | 75.312 | 31.212 |
| 2016-03-2212:17:31 PM | 32.225 | 154.062 | 75.312 | 30.65 |
| 2016-03-2212:17:37 PM | 32.225 | 153.612 | 75.312 | 30.538 |
| 2016-03-2212:17:43 PM | 32.225 | 153.05 | 75.312 | 30.2 |
| 2016-03-2212:17:49 PM | 32.338 | 152.375 | 75.312 | 29.975 |
| 2016-03-2212:17:55 PM | 32.225 | 151.7 | 75.312 | 29.862 |
| 2016-03-2212:18:02 PM | 32.225 | 151.025 | 75.312 | 29.638 |
| 2016-03-2212:18:08 PM | 32.225 | 150.462 | 75.2 | 29.525 |
| 2016-03-2212:18:14 PM | 32.225 | 149.9 | 75.312 | 29.638 |
| 2016-03-2212:18:20 PM | 32.225 | 149.338 | 75.2 | 29.638 |
| 2016-03-2212:18:26 PM | 32.225 | 148.775 | 75.2 | 29.638 |
| 2016-03-2212:18:33 PM | 32.225 | 148.212 | 75.2 | 29.75 |
| 2016-03-2212:18:39 PM | 32.338 | 147.875 | 75.2 | 29.862 |
| 2016-03-2212:18:45 PM | 32.338 | 147.65 | 75.2 | 29.975 |
| 2016-03-2212:18:51 PM | 32.225 | 147.425 | 75.2 | 30.312 |
| 2016-03-2212:18:58 PM | 32.338 | 147.312 | 75.312 | 30.65 |
| 2016-03-2212:19:04 PM | 32.225 | 147.2 | 75.312 | 30.762 |
| 2016-03-2212:19:10 PM | 32.225 | 147.2 | 75.312 | 30.875 |
| 2016-03-2212:19:16 PM | 32.338 | 147.2 | 75.312 | 30.988 |
| 2016-03-2212:19:22 PM | 32.338 | 147.312 | 75.312 | 30.988 |
| 2016-03-2212:19:29 PM | 32.225 | 147.538 | 75.312 | 31.325 |
| 2016-03-2212:19:35 PM | 32.225 | 147.65 | 75.312 | 31.55 |
| 2016-03-2212:19:41 PM | 32.338 | 147.763 | 75.312 | 31.775 |
| 2016-03-2212:19:47 PM | 32.338 | 147.988 | 75.312 | 32 |
| 2016-03-2212:19:53 PM | 32.338 | 148.212 | 75.312 | 32.112 |
| 2016-03-2212:20:00 PM | 32.225 | 148.325 | 75.312 | 32.225 |
| 2016-03-2212:20:06 PM | 32.225 | 148.662 | 75.312 | 32.45 |
| 2016-03-2212:20:12 PM | 32.225 | 148.888 | 75.312 | 32.788 |
| 2016-03-2212:20:18 PM | 32.225 | 149.112 | 75.312 | 33.125 |
| 2016-03-2212:20:24 PM | 32.225 | 149.338 | 75.312 | 33.462 |
| 2016-03-2212:20:31 PM | 32.338 | 149.562 | 75.312 | 33.462 |
| 2016-03-2212:20:37 PM | 32.225 | 149.9 | 75.425 | 33.575 |
| 2016-03-2212:20:43 PM | 32.225 | 150.238 | 75.312 | 33.575 |
| 2016-03-2212:20:49 PM | 32.338 | 150.462 | 75.312 | 33.462 |
| 2016-03-2212:20:55 PM | 32.225 | 150.8 | 75.312 | 33.462 |
| 2016-03-2212:21:02 PM | 32.225 | 151.025 | 75.312 | 33.575 |
| 2016-03-2212:21:08 PM | 32.338 | 151.362 | 75.425 | 33.688 |
| 2016-03-2212:21:14 PM | 32.225 | 151.7 | 75.312 | 33.688 |
| 2016-03-2212:21:20 PM | 32.338 | 151.925 | 75.312 | 33.8 |
| 2016-03-2212:21:26 PM | 32.225 | 152.263 | 75.312 | 33.912 |
| 2016-03-2212:21:33 PM | 32.225 | 152.6 | 75.312 | 34.138 |
| 2016-03-2212:21:39 PM | 32.338 | 152.825 | 75.425 | 34.25 |
| 2016-03-2212:21:45 PM | 32.225 | 153.162 | 75.425 | 34.25 |
| 2016-03-2212:21:51 PM | 32.338 | 153.5 | 75.425 | 34.25 |
| 2016-03-2212:21:58 PM | 32.225 | 153.725 | 75.312 | 34.362 |
| 2016-03-2212:22:04 PM | 32.225 | 154.062 | 75.312 | 34.588 |
| 2016-03-2212:22:10 PM | 32.225 | 154.4 | 75.312 | 34.7 |
| 2016-03-2212:22:16 PM | 32.225 | 154.738 | 75.425 | 34.7 |
| 2016-03-2212:22:22 PM | 32.225 | 155.075 | 75.425 | 34.925 |
| 2016-03-2212:22:29 PM | 32.225 | 155.3 | 75.425 | 35.15 |
| 2016-03-2212:22:35 PM | 32.225 | 155.638 | 75.425 | 35.038 |
| 2016-03-2212:22:41 PM | 32.225 | 155.638 | 75.425 | 34.812 |
| 2016-03-2212:22:47 PM | 32.225 | 155.638 | 75.425 | 34.475 |
| 2016-03-2212:22:53 PM | 32.225 | 155.525 | 75.425 | 34.25 |
| 2016-03-2212:23:00 PM | 32.338 | 155.3 | 75.425 | 34.138 |
| 2016-03-2212:23:06 PM | 32.225 | 155.188 | 75.312 | 33.912 |
| 2016-03-2212:23:12 PM | 32.225 | 154.85 | 75.312 | 33.8 |
| 2016-03-2212:23:18 PM | 32.338 | 154.625 | 75.312 | 33.8 |
| 2016-03-2212:23:24 PM | 32.225 | 154.4 | 75.312 | 33.688 |
| 2016-03-2212:23:31 PM | 32.225 | 154.175 | 75.312 | 33.575 |
| 2016-03-2212:23:37 PM | 32.225 | 153.838 | 75.312 | 33.462 |
| 2016-03-2212:23:43 PM | 32.338 | 153.388 | 75.312 | 33.35 |
| 2016-03-2212:23:49 PM | 32.225 | 152.825 | 75.312 | 32.9 |
| 2016-03-2212:23:55 PM | 32.338 | 152.375 | 75.312 | 32.675 |
| 2016-03-2212:24:02 PM | 32.338 | 151.7 | 75.312 | 32.225 |
| 2016-03-2212:24:08 PM | 32.225 | 151.025 | 75.2 | 31.888 |
| 2016-03-2212:24:14 PM | 32.225 | 150.35 | 75.312 | 31.55 |
| 2016-03-2212:24:20 PM | 32.225 | 149.562 | 75.2 | 31.325 |
| 2016-03-2212:24:26 PM | 32.225 | 148.775 | 75.2 | 31.1 |
| 2016-03-2212:24:33 PM | 32.338 | 147.988 | 75.2 | 30.538 |
| 2016-03-2212:24:39 PM | 32.338 | 147.088 | 75.2 | 30.312 |
| 2016-03-2212:24:45 PM | 32.225 | 146.3 | 75.2 | 30.088 |
| 2016-03-2212:24:51 PM | 32.338 | 145.625 | 75.2 | 29.975 |
| 2016-03-2212:24:57 PM | 32.225 | 145.062 | 75.2 | 29.975 |
| 2016-03-2212:25:04 PM | 32.338 | 144.5 | 75.088 | 29.862 |
| 2016-03-2212:25:10 PM | 32.225 | 144.162 | 75.088 | 29.975 |
| 2016-03-2212:25:16 PM | 32.338 | 143.938 | 75.088 | 30.2 |
| 2016-03-2212:25:22 PM | 32.338 | 143.825 | 75.088 | 30.088 |
| 2016-03-2212:25:29 PM | 32.338 | 143.712 | 75.088 | 30.088 |
| 2016-03-2212:25:35 PM | 32.225 | 143.375 | 75.088 | 30.088 |
| 2016-03-2212:25:41 PM | 32.338 | 143.15 | 75.088 | 30.088 |
| 2016-03-2212:25:47 PM | 32.338 | 143.038 | 75.088 | 30.088 |
| 2016-03-2212:25:53 PM | 32.338 | 142.812 | 75.088 | 30.2 |
| 2016-03-2212:26:00 PM | 32.338 | 142.812 | 75.088 | 30.312 |
| 2016-03-2212:26:06 PM | 32.225 | 142.812 | 75.088 | 30.65 |
| 2016-03-2212:26:12 PM | 32.225 | 142.925 | 75.088 | 30.875 |
| 2016-03-2212:26:18 PM | 32.225 | 143.038 | 75.088 | 30.875 |
| 2016-03-2212:26:24 PM | 32.225 | 143.262 | 75.088 | 31.1 |
| 2016-03-2212:26:31 PM | 32.225 | 143.375 | 75.088 | 31.212 |
| 2016-03-2212:26:37 PM | 32.338 | 143.6 | 75.088 | 31.438 |
| 2016-03-2212:26:43 PM | 32.338 | 143.825 | 75.088 | 31.438 |
| 2016-03-2212:26:49 PM | 32.225 | 144.05 | 75.088 | 31.662 |
| 2016-03-2212:26:55 PM | 32.225 | 144.275 | 75.088 | 31.888 |
| 2016-03-2212:27:02 PM | 32.338 | 144.612 | 75.088 | 32 |
| 2016-03-2212:27:08 PM | 32.225 | 144.838 | 75.088 | 32.112 |
| 2016-03-2212:27:14 PM | 32.225 | 145.175 | 75.088 | 32.112 |
| 2016-03-2212:27:20 PM | 32.225 | 145.4 | 75.088 | 32.338 |
| 2016-03-2212:27:26 PM | 32.338 | 145.738 | 75.088 | 32.45 |
| 2016-03-2212:27:33 PM | 32.338 | 146.075 | 75.2 | 32.788 |
| 2016-03-2212:27:39 PM | 32.338 | 146.3 | 75.088 | 33.012 |
| 2016-03-2212:27:45 PM | 32.225 | 146.638 | 75.088 | 33.012 |
| 2016-03-2212:27:51 PM | 32.338 | 146.975 | 75.088 | 33.012 |
| 2016-03-2212:27:57 PM | 32.338 | 147.312 | 75.2 | 33.125 |
| 2016-03-2212:28:04 PM | 32.225 | 147.65 | 75.088 | 33.238 |
| 2016-03-2212:28:10 PM | 32.338 | 147.875 | 75.2 | 33.35 |
| 2016-03-2212:28:16 PM | 32.225 | 148.325 | 75.088 | 33.575 |
| 2016-03-2212:28:22 PM | 32.225 | 148.662 | 75.2 | 33.8 |
| 2016-03-2212:28:29 PM | 32.338 | 149 | 75.088 | 34.138 |
| 2016-03-2212:28:35 PM | 32.338 | 149.225 | 75.088 | 34.25 |
| 2016-03-2212:28:41 PM | 32.338 | 149.675 | 75.088 | 34.25 |
| 2016-03-2212:28:47 PM | 32.338 | 150.013 | 75.088 | 34.25 |
| 2016-03-2212:28:53 PM | 32.225 | 150.238 | 75.088 | 34.475 |
| 2016-03-2212:29:00 PM | 32.338 | 150.688 | 75.088 | 34.588 |
| 2016-03-2212:29:06 PM | 32.338 | 151.025 | 75.088 | 34.588 |
| 2016-03-2212:29:12 PM | 32.225 | 151.362 | 75.088 | 34.925 |
| 2016-03-2212:29:18 PM | 32.225 | 151.7 | 75.088 | 35.15 |
| 2016-03-2212:29:24 PM | 32.338 | 152.15 | 75.2 | 35.262 |
| 2016-03-2212:29:31 PM | 32.338 | 152.488 | 75.2 | 35.262 |
| 2016-03-2212:29:37 PM | 32.225 | 152.712 | 75.088 | 35.262 |
| 2016-03-2212:29:43 PM | 32.338 | 153.05 | 75.088 | 35.15 |
| 2016-03-2212:29:49 PM | 32.338 | 153.388 | 75.088 | 35.15 |
| 2016-03-2212:29:56 PM | 32.225 | 153.725 | 75.2 | 34.925 |
| 2016-03-2212:30:02 PM | 32.338 | 153.95 | 75.2 | 34.925 |
| 2016-03-2212:30:08 PM | 32.225 | 154.288 | 75.2 | 34.925 |
| 2016-03-2212:30:14 PM | 32.338 | 154.513 | 75.2 | 34.925 |
| 2016-03-2212:30:20 PM | 32.225 | 154.85 | 75.2 | 34.925 |
| 2016-03-2212:30:27 PM | 32.338 | 155.075 | 75.2 | 34.7 |
| 2016-03-2212:30:33 PM | 32.225 | 155.3 | 75.2 | 34.588 |
| 2016-03-2212:30:39 PM | 32.225 | 155.412 | 75.2 | 34.588 |
| 2016-03-2212:30:45 PM | 32.225 | 155.525 | 75.2 | 34.588 |
| 2016-03-2212:30:52 PM | 32.225 | 155.75 | 75.312 | 34.7 |
| 2016-03-2212:30:58 PM | 32.225 | 155.975 | 75.312 | 34.812 |
| 2016-03-2212:31:04 PM | 32.225 | 156.2 | 75.312 | 34.812 |
| 2016-03-2212:31:10 PM | 32.338 | 156.425 | 75.312 | 34.588 |
| 2016-03-2212:31:16 PM | 32.225 | 156.65 | 75.312 | 34.475 |
| 2016-03-2212:31:23 PM | 32.225 | 156.875 | 75.312 | 34.25 |
| 2016-03-2212:31:29 PM | 32.225 | 156.988 | 75.312 | 34.362 |
| 2016-03-2212:31:35 PM | 32.338 | 157.212 | 75.312 | 34.475 |
| 2016-03-2212:31:41 PM | 32.338 | 157.438 | 75.312 | 34.475 |
| 2016-03-2212:31:47 PM | 32.338 | 157.55 | 75.312 | 34.475 |
| 2016-03-2212:31:54 PM | 32.225 | 157.775 | 75.425 | 34.475 |
| 2016-03-2212:32:00 PM | 32.225 | 158 | 75.425 | 34.588 |
| 2016-03-2212:32:06 PM | 32.225 | 158.225 | 75.425 | 34.7 |
| 2016-03-2212:32:12 PM | 32.225 | 158.338 | 75.425 | 34.925 |
| 2016-03-2212:32:18 PM | 32.338 | 158.45 | 75.425 | 35.038 |
| 2016-03-2212:32:25 PM | 32.225 | 158.675 | 75.425 | 34.925 |
| 2016-03-2212:32:31 PM | 32.338 | 158.788 | 75.425 | 34.925 |
| 2016-03-2212:32:37 PM | 32.338 | 158.9 | 75.425 | 34.925 |
| 2016-03-2212:32:43 PM | 32.225 | 159.125 | 75.538 | 35.038 |
| 2016-03-2212:32:50 PM | 32.338 | 159.238 | 75.538 | 34.7 |
| 2016-03-2212:32:56 PM | 32.225 | 159.462 | 75.538 | 34.475 |
| 2016-03-2212:33:02 PM | 32.338 | 159.575 | 75.538 | 34.588 |
| 2016-03-2212:33:08 PM | 32.225 | 159.688 | 75.538 | 34.7 |
| 2016-03-2212:33:14 PM | 32.225 | 159.912 | 75.538 | 34.812 |
| 2016-03-2212:33:21 PM | 32.225 | 160.025 | 75.538 | 34.925 |
| 2016-03-2212:33:27 PM | 32.338 | 160.25 | 75.538 | 35.15 |
| 2016-03-2212:33:33 PM | 32.338 | 160.362 | 75.538 | 35.488 |
| 2016-03-2212:33:39 PM | 32.225 | 160.475 | 75.538 | 35.488 |
| 2016-03-2212:33:45 PM | 32.338 | 160.7 | 75.538 | 35.6 |
| 2016-03-2212:33:52 PM | 32.225 | 160.925 | 75.538 | 35.488 |
| 2016-03-2212:33:58 PM | 32.338 | 161.038 | 75.65 | 35.6 |
| 2016-03-2212:34:04 PM | 32.225 | 161.263 | 75.65 | 35.488 |
| 2016-03-2212:34:10 PM | 32.338 | 161.375 | 75.65 | 35.038 |
| 2016-03-2212:34:16 PM | 32.338 | 161.488 | 75.65 | 34.588 |
| 2016-03-2212:34:23 PM | 32.338 | 161.6 | 75.65 | 34.362 |
| 2016-03-2212:34:29 PM | 32.225 | 161.712 | 75.65 | 34.362 |
| 2016-03-2212:34:35 PM | 32.338 | 161.825 | 75.65 | 34.138 |
| 2016-03-2212:34:41 PM | 32.338 | 161.938 | 75.65 | 34.025 |
| 2016-03-2212:34:48 PM | 32.225 | 161.938 | 75.65 | 33.8 |
| 2016-03-2212:34:54 PM | 32.338 | 162.05 | 75.65 | 34.025 |
| 2016-03-2212:35:00 PM | 32.225 | 162.05 | 75.65 | 34.138 |
| 2016-03-2212:35:06 PM | 32.338 | 162.162 | 75.65 | 34.362 |
| 2016-03-2212:35:12 PM | 32.338 | 162.162 | 75.65 | 34.475 |
| 2016-03-2212:35:19 PM | 32.225 | 162.388 | 75.65 | 34.588 |
| 2016-03-2212:35:25 PM | 32.338 | 162.388 | 75.65 | 34.588 |
| 2016-03-2212:35:31 PM | 32.225 | 162.5 | 75.762 | 34.588 |
| 2016-03-2212:35:37 PM | 32.338 | 162.5 | 75.762 | 34.7 |
| 2016-03-2212:35:44 PM | 32.338 | 162.612 | 75.762 | 34.588 |
| 2016-03-2212:35:50 PM | 32.225 | 162.725 | 75.762 | 34.7 |
| 2016-03-2212:35:56 PM | 32.225 | 162.838 | 75.762 | 34.812 |
| 2016-03-2212:36:02 PM | 32.338 | 162.95 | 75.875 | 34.925 |
| 2016-03-2212:36:08 PM | 32.338 | 162.95 | 75.875 | 34.7 |
| 2016-03-2212:36:15 PM | 32.225 | 163.062 | 75.875 | 34.588 |
| 2016-03-2212:36:21 PM | 32.225 | 163.175 | 75.875 | 34.588 |
| 2016-03-2212:36:27 PM | 32.338 | 163.175 | 75.875 | 34.7 |
| 2016-03-2212:36:33 PM | 32.338 | 163.288 | 75.875 | 34.7 |
| 2016-03-2212:36:40 PM | 32.338 | 163.4 | 75.875 | 34.812 |
| 2016-03-2212:36:46 PM | 32.338 | 163.513 | 75.875 | 34.812 |
| 2016-03-2212:36:52 PM | 32.225 | 163.625 | 75.875 | 34.925 |
| 2016-03-2212:36:58 PM | 32.338 | 163.625 | 75.875 | 34.812 |
| 2016-03-2212:37:05 PM | 32.338 | 163.738 | 75.875 | 34.925 |
| 2016-03-2212:37:11 PM | 32.225 | 163.85 | 75.875 | 35.15 |
| 2016-03-2212:37:17 PM | 32.338 | 163.962 | 75.988 | 35.15 |
| 2016-03-2212:37:23 PM | 32.225 | 164.075 | 75.875 | 35.15 |
| 2016-03-2212:37:30 PM | 32.338 | 164.075 | 75.988 | 35.375 |
| 2016-03-2212:37:36 PM | 32.225 | 164.188 | 75.988 | 35.375 |
| 2016-03-2212:37:42 PM | 32.225 | 164.3 | 75.988 | 35.488 |
| 2016-03-2212:37:48 PM | 32.338 | 164.3 | 75.988 | 35.6 |
| 2016-03-2212:37:55 PM | 32.338 | 164.412 | 75.988 | 35.825 |
| 2016-03-2212:38:01 PM | 32.338 | 164.525 | 75.988 | 35.6 |
| 2016-03-2212:38:07 PM | 32.225 | 164.638 | 75.988 | 35.15 |
| 2016-03-2212:38:13 PM | 32.338 | 164.75 | 75.875 | 35.038 |
| 2016-03-2212:38:19 PM | 32.338 | 164.75 | 75.875 | 35.038 |
| 2016-03-2212:38:26 PM | 32.225 | 164.862 | 75.875 | 35.038 |
| 2016-03-2212:38:32 PM | 32.225 | 164.975 | 75.875 | 34.925 |
| 2016-03-2212:38:38 PM | 32.225 | 164.975 | 75.875 | 34.925 |
| 2016-03-2212:38:44 PM | 32.225 | 164.862 | 75.875 | 34.925 |
| 2016-03-2212:38:50 PM | 32.225 | 164.862 | 75.988 | 34.812 |
| 2016-03-2212:38:57 PM | 32.225 | 164.975 | 75.988 | 34.588 |
| 2016-03-2212:39:03 PM | 32.225 | 164.975 | 75.988 | 34.362 |
| 2016-03-2212:39:09 PM | 32.225 | 165.088 | 75.988 | 34.138 |
| 2016-03-2212:39:15 PM | 32.225 | 164.975 | 75.988 | 34.025 |
| 2016-03-2212:39:22 PM | 32.225 | 164.975 | 75.988 | 33.912 |
| 2016-03-2212:39:28 PM | 32.225 | 164.975 | 75.988 | 33.575 |
| 2016-03-2212:39:34 PM | 32.338 | 164.862 | 75.875 | 33.462 |
| 2016-03-2212:39:40 PM | 32.338 | 164.638 | 75.875 | 33.238 |
| 2016-03-2212:39:46 PM | 32.338 | 164.412 | 75.875 | 32.9 |
| 2016-03-2212:39:53 PM | 32.338 | 164.075 | 75.875 | 32.9 |
| 2016-03-2212:39:59 PM | 32.338 | 163.962 | 75.875 | 33.012 |
| 2016-03-2212:40:05 PM | 32.338 | 163.738 | 75.875 | 33.125 |
| 2016-03-2212:40:11 PM | 32.225 | 163.625 | 75.875 | 33.35 |
| 2016-03-2212:40:18 PM | 32.225 | 163.513 | 75.875 | 33.575 |
| 2016-03-2212:40:24 PM | 32.225 | 163.513 | 75.875 | 33.8 |
| 2016-03-2212:40:30 PM | 32.225 | 163.4 | 75.875 | 34.025 |
| 2016-03-2212:40:36 PM | 32.338 | 163.4 | 75.988 | 34.138 |
| 2016-03-2212:40:43 PM | 32.338 | 163.4 | 75.988 | 34.025 |
| 2016-03-2212:40:49 PM | 32.225 | 163.4 | 75.988 | 34.025 |
| 2016-03-2212:40:55 PM | 32.225 | 163.288 | 75.988 | 34.25 |
| 2016-03-2212:41:01 PM | 32.225 | 163.4 | 75.988 | 34.25 |
| 2016-03-2212:41:07 PM | 32.338 | 163.288 | 75.988 | 34.138 |
| 2016-03-2212:41:14 PM | 32.338 | 163.288 | 75.988 | 34.138 |
| 2016-03-2212:41:20 PM | 32.338 | 163.4 | 76.1 | 34.25 |
| 2016-03-2212:41:26 PM | 32.225 | 163.4 | 76.1 | 34.475 |
| 2016-03-2212:41:32 PM | 32.338 | 163.4 | 76.1 | 34.588 |
| 2016-03-2212:41:38 PM | 32.225 | 163.513 | 76.1 | 34.7 |
| 2016-03-2212:41:45 PM | 32.338 | 163.513 | 76.1 | 34.925 |
| 2016-03-2212:41:51 PM | 32.338 | 163.625 | 76.1 | 35.038 |
| 2016-03-2212:41:57 PM | 32.225 | 163.625 | 76.1 | 35.038 |
| 2016-03-2212:42:03 PM | 32.338 | 163.738 | 76.1 | 35.15 |
| 2016-03-2212:42:09 PM | 32.225 | 163.85 | 76.1 | 35.488 |
| 2016-03-2212:42:16 PM | 32.225 | 163.962 | 76.1 | 35.712 |
| 2016-03-2212:42:22 PM | 32.338 | 164.075 | 76.1 | 35.938 |
| 2016-03-2212:42:28 PM | 32.225 | 164.075 | 76.1 | 35.825 |
| 2016-03-2212:42:34 PM | 32.338 | 164.3 | 76.1 | 35.712 |
| 2016-03-2212:42:40 PM | 32.338 | 164.412 | 76.1 | 35.6 |
| 2016-03-2212:42:47 PM | 32.338 | 164.525 | 76.1 | 35.488 |
| 2016-03-2212:42:53 PM | 32.225 | 164.638 | 76.1 | 35.488 |
| 2016-03-2212:43:04 PM | 32.338 | 164.75 | 76.1 | 35.488 |
| 2016-03-2212:43:10 PM | 32.225 | 164.862 | 76.1 | 35.15 |
| 2016-03-2212:43:17 PM | 32.338 | 164.975 | 76.1 | 35.15 |
| 2016-03-2212:43:23 PM | 32.338 | 165.088 | 76.1 | 35.038 |
| 2016-03-2212:43:29 PM | 32.225 | 165.2 | 76.1 | 35.038 |
| 2016-03-2212:43:35 PM | 32.225 | 165.425 | 76.1 | 34.925 |
| 2016-03-2212:43:42 PM | 32.225 | 165.538 | 76.1 | 35.038 |
| 2016-03-2212:43:48 PM | 32.338 | 165.538 | 76.212 | 34.925 |
| 2016-03-2212:43:54 PM | 32.338 | 165.538 | 76.212 | 34.588 |
| 2016-03-2212:44:00 PM | 32.338 | 165.312 | 76.212 | 34.588 |
| 2016-03-2212:44:06 PM | 32.338 | 164.975 | 76.212 | 34.475 |
| 2016-03-2212:44:13 PM | 32.338 | 164.638 | 76.212 | 34.25 |
| 2016-03-2212:44:19 PM | 32.338 | 164.188 | 76.212 | 33.912 |
| 2016-03-2212:44:25 PM | 32.338 | 163.513 | 76.1 | 33.575 |
| 2016-03-2212:44:31 PM | 32.338 | 162.95 | 76.1 | 33.238 |
| 2016-03-2212:44:37 PM | 32.225 | 162.388 | 76.1 | 33.35 |
| 2016-03-2212:44:44 PM | 32.338 | 161.938 | 76.1 | 33.462 |
| 2016-03-2212:44:50 PM | 32.338 | 161.6 | 76.1 | 33.35 |
| 2016-03-2212:44:56 PM | 32.338 | 161.263 | 76.1 | 33.35 |
| 2016-03-2212:45:02 PM | 32.338 | 161.15 | 76.1 | 33.462 |
| 2016-03-2212:45:08 PM | 32.338 | 161.038 | 76.1 | 33.575 |
| 2016-03-2212:45:15 PM | 32.225 | 160.925 | 76.1 | 33.575 |
| 2016-03-2212:45:21 PM | 32.338 | 160.925 | 76.1 | 33.688 |
| 2016-03-2212:45:27 PM | 32.338 | 160.812 | 75.988 | 33.8 |
| 2016-03-2212:45:33 PM | 32.338 | 160.812 | 76.1 | 33.912 |
| 2016-03-2212:45:40 PM | 32.338 | 160.925 | 76.1 | 33.912 |
| 2016-03-2212:45:46 PM | 32.338 | 160.925 | 76.1 | 34.025 |
| 2016-03-2212:45:52 PM | 32.338 | 160.925 | 75.988 | 34.025 |
| 2016-03-2212:45:58 PM | 32.338 | 160.925 | 76.1 | 33.8 |
| 2016-03-2212:46:05 PM | 32.338 | 161.038 | 76.1 | 33.8 |
| 2016-03-2212:46:11 PM | 32.338 | 161.15 | 76.1 | 33.912 |
| 2016-03-2212:46:17 PM | 32.225 | 161.263 | 76.1 | 34.138 |
| 2016-03-2212:46:23 PM | 32.225 | 161.375 | 76.1 | 34.25 |
| 2016-03-2212:46:30 PM | 32.225 | 161.488 | 76.1 | 34.025 |
| 2016-03-2212:46:36 PM | 32.225 | 161.6 | 76.212 | 34.138 |
| 2016-03-2212:46:42 PM | 32.338 | 161.712 | 76.1 | 34.138 |
| 2016-03-2212:46:48 PM | 32.225 | 161.712 | 76.212 | 34.25 |
| 2016-03-2212:46:54 PM | 32.338 | 161.825 | 76.212 | 34.475 |
| 2016-03-2212:47:01 PM | 32.338 | 161.938 | 76.212 | 34.7 |
| 2016-03-2212:47:07 PM | 32.225 | 162.05 | 76.212 | 34.925 |
| 2016-03-2212:47:13 PM | 32.338 | 162.162 | 76.212 | 34.812 |
| 2016-03-2212:47:19 PM | 32.225 | 162.275 | 76.212 | 34.475 |
| 2016-03-2212:47:25 PM | 32.338 | 162.388 | 76.212 | 34.588 |
| 2016-03-2212:47:32 PM | 32.225 | 162.5 | 76.212 | 34.362 |
| 2016-03-2212:47:38 PM | 32.338 | 162.725 | 76.325 | 34.138 |
| 2016-03-2212:47:44 PM | 32.338 | 162.838 | 76.212 | 34.025 |
| 2016-03-2212:47:50 PM | 32.338 | 162.95 | 76.212 | 34.025 |
| 2016-03-2212:47:57 PM | 32.225 | 163.062 | 76.212 | 34.025 |
| 2016-03-2212:48:03 PM | 32.338 | 163.175 | 76.325 | 34.138 |
| 2016-03-2212:48:09 PM | 32.338 | 163.288 | 76.325 | 34.138 |
| 2016-03-2212:48:15 PM | 32.338 | 163.4 | 76.325 | 34.362 |
| 2016-03-2212:48:21 PM | 32.338 | 163.4 | 76.325 | 34.25 |
| 2016-03-2212:48:28 PM | 32.338 | 163.513 | 76.212 | 34.138 |
| 2016-03-2212:48:34 PM | 32.338 | 163.625 | 76.212 | 34.25 |
| 2016-03-2212:48:40 PM | 32.338 | 163.625 | 76.325 | 34.362 |
| 2016-03-2212:48:46 PM | 32.225 | 163.738 | 76.325 | 34.362 |
| 2016-03-2212:48:53 PM | 32.338 | 163.85 | 76.325 | 34.588 |
| 2016-03-2212:48:59 PM | 32.338 | 163.962 | 76.325 | 34.812 |
| 2016-03-2212:49:05 PM | 32.338 | 163.962 | 76.325 | 35.038 |
| 2016-03-2212:49:11 PM | 32.338 | 164.075 | 76.212 | 35.15 |
| 2016-03-2212:49:18 PM | 32.338 | 164.188 | 76.325 | 35.262 |
| 2016-03-2212:49:24 PM | 32.338 | 164.188 | 76.325 | 35.038 |
| 2016-03-2212:49:30 PM | 32.338 | 164.188 | 76.325 | 34.588 |
| 2016-03-2212:49:37 PM | 32.338 | 163.962 | 76.325 | 34.475 |
| 2016-03-2212:49:43 PM | 32.225 | 163.513 | 76.212 | 34.362 |
| 2016-03-2212:49:49 PM | 32.338 | 163.175 | 76.325 | 34.138 |
| 2016-03-2212:49:56 PM | 32.338 | 162.612 | 76.325 | 33.8 |
| 2016-03-2212:50:02 PM | 32.338 | 162.05 | 76.212 | 33.575 |
| 2016-03-2212:50:08 PM | 32.338 | 161.375 | 76.325 | 33.125 |
| 2016-03-2212:50:14 PM | 32.338 | 160.7 | 76.212 | 32.9 |
| 2016-03-2212:50:20 PM | 32.225 | 160.025 | 76.212 | 32.788 |
| 2016-03-2212:50:27 PM | 32.338 | 159.238 | 76.212 | 32.788 |
| 2016-03-2212:50:33 PM | 32.225 | 158.45 | 76.1 | 32.675 |
| 2016-03-2212:50:39 PM | 32.225 | 157.775 | 76.212 | 32.45 |
| 2016-03-2212:50:45 PM | 32.225 | 156.988 | 76.212 | 32.112 |
| 2016-03-2212:50:52 PM | 32.338 | 156.2 | 76.1 | 32 |
| 2016-03-2212:50:58 PM | 32.338 | 155.412 | 76.1 | 32.225 |
| 2016-03-2212:51:04 PM | 32.338 | 154.738 | 76.1 | 32.45 |
| 2016-03-2212:51:10 PM | 32.225 | 154.175 | 76.1 | 32.788 |
| 2016-03-2212:51:16 PM | 32.225 | 153.725 | 76.1 | 33.012 |
| 2016-03-2212:51:23 PM | 32.338 | 153.388 | 76.1 | 33.462 |
| 2016-03-2212:51:29 PM | 32.225 | 153.162 | 76.1 | 33.8 |
| 2016-03-2212:51:35 PM | 32.338 | 153.05 | 76.1 | 34.138 |
| 2016-03-2212:51:41 PM | 32.338 | 153.05 | 76.1 | 34.362 |
| 2016-03-2212:51:48 PM | 32.338 | 153.05 | 76.1 | 34.362 |
| 2016-03-2212:51:54 PM | 32.338 | 153.162 | 76.212 | 34.362 |
| 2016-03-2212:52:00 PM | 32.338 | 153.275 | 76.212 | 34.475 |
| 2016-03-2212:52:06 PM | 32.338 | 153.275 | 76.212 | 34.588 |
| 2016-03-2212:52:12 PM | 32.225 | 153.388 | 76.212 | 34.812 |
| 2016-03-2212:52:19 PM | 32.338 | 153.612 | 76.212 | 35.038 |
| 2016-03-2212:52:25 PM | 32.225 | 153.838 | 76.212 | 35.038 |
| 2016-03-2212:52:31 PM | 32.338 | 154.062 | 76.212 | 35.15 |
| 2016-03-2212:52:37 PM | 32.338 | 154.4 | 76.212 | 35.375 |
| 2016-03-2212:52:44 PM | 32.338 | 154.625 | 76.212 | 35.488 |
| 2016-03-2212:52:50 PM | 32.225 | 154.85 | 76.212 | 35.375 |
| 2016-03-2212:52:56 PM | 32.338 | 154.962 | 76.212 | 35.262 |
| 2016-03-2212:53:02 PM | 32.225 | 155.075 | 76.212 | 35.375 |
| 2016-03-2212:53:08 PM | 32.338 | 155.188 | 76.212 | 35.15 |
| 2016-03-2212:53:15 PM | 32.338 | 155.3 | 76.325 | 35.038 |
| 2016-03-2212:53:21 PM | 32.338 | 155.3 | 76.212 | 34.7 |
| 2016-03-2212:53:27 PM | 32.225 | 155.3 | 76.212 | 34.025 |
| 2016-03-2212:53:33 PM | 32.225 | 155.188 | 76.212 | 33.8 |
| 2016-03-2212:53:39 PM | 32.225 | 155.075 | 76.212 | 34.025 |
| 2016-03-2212:53:46 PM | 32.225 | 154.962 | 76.212 | 34.138 |
| 2016-03-2212:53:52 PM | 32.338 | 154.962 | 76.212 | 34.25 |
| 2016-03-2212:53:58 PM | 32.338 | 154.962 | 76.212 | 34.25 |
| 2016-03-2212:54:04 PM | 32.338 | 154.962 | 76.212 | 34.362 |
| 2016-03-2212:54:11 PM | 32.338 | 154.962 | 76.212 | 34.138 |
| 2016-03-2212:54:17 PM | 32.338 | 154.85 | 76.212 | 34.25 |
| 2016-03-2212:54:23 PM | 32.338 | 154.85 | 76.212 | 34.025 |
| 2016-03-2212:54:29 PM | 32.338 | 154.738 | 76.325 | 33.912 |
| 2016-03-2212:54:35 PM | 32.225 | 154.625 | 76.325 | 33.8 |
| 2016-03-2212:54:42 PM | 32.338 | 154.513 | 76.212 | 34.025 |
| 2016-03-2212:54:48 PM | 32.338 | 154.513 | 76.325 | 34.25 |
| 2016-03-2212:54:54 PM | 32.225 | 154.513 | 76.325 | 34.362 |
| 2016-03-2212:55:00 PM | 32.225 | 154.4 | 76.325 | 34.25 |
| 2016-03-2212:55:06 PM | 32.338 | 154.4 | 76.325 | 34.475 |
| 2016-03-2212:55:13 PM | 32.225 | 154.4 | 76.325 | 34.475 |
| 2016-03-2212:55:19 PM | 32.338 | 154.4 | 76.325 | 34.25 |
| 2016-03-2212:55:25 PM | 32.225 | 154.288 | 76.325 | 33.912 |
| 2016-03-2212:55:31 PM | 32.225 | 154.175 | 76.325 | 33.8 |
| 2016-03-2212:55:37 PM | 32.338 | 154.062 | 76.325 | 33.688 |
| 2016-03-2212:55:50 PM | 32.338 | 153.838 | 76.325 | 33.688 |
| 2016-03-2212:55:56 PM | 32.338 | 153.5 | 76.325 | 34.025 |
| 2016-03-2212:56:02 PM | 32.338 | 153.275 | 76.325 | 34.138 |
| 2016-03-2212:56:08 PM | 32.338 | 153.05 | 76.325 | 34.025 |
| 2016-03-2212:56:15 PM | 32.338 | 152.938 | 76.325 | 34.138 |
| 2016-03-2212:56:21 PM | 32.225 | 152.825 | 76.325 | 34.138 |
| 2016-03-2212:56:27 PM | 32.338 | 152.825 | 76.325 | 34.025 |
| 2016-03-2212:56:33 PM | 32.338 | 152.6 | 76.325 | 33.8 |
| 2016-03-2212:56:39 PM | 32.338 | 152.488 | 76.325 | 33.688 |
| 2016-03-2212:56:46 PM | 32.338 | 152.488 | 76.212 | 33.912 |
| 2016-03-2212:56:52 PM | 32.338 | 152.375 | 76.212 | 34.025 |
| 2016-03-2212:56:58 PM | 32.338 | 152.263 | 76.212 | 34.138 |
| 2016-03-2212:57:04 PM | 32.338 | 152.263 | 76.212 | 34.138 |
| 2016-03-2212:57:10 PM | 32.225 | 152.375 | 76.212 | 34.25 |
| 2016-03-2212:57:17 PM | 32.338 | 152.375 | 76.212 | 34.138 |
| 2016-03-2212:57:23 PM | 32.338 | 152.375 | 76.212 | 34.138 |
| 2016-03-2212:57:29 PM | 32.338 | 152.375 | 76.212 | 34.475 |
| 2016-03-2212:57:35 PM | 32.338 | 152.375 | 76.212 | 34.7 |
| 2016-03-2212:57:41 PM | 32.225 | 152.488 | 76.212 | 34.925 |
| 2016-03-2212:57:48 PM | 32.225 | 152.712 | 76.212 | 35.262 |
| 2016-03-2212:57:54 PM | 32.338 | 152.825 | 76.212 | 35.262 |
| 2016-03-2212:58:00 PM | 32.338 | 153.05 | 76.212 | 35.038 |
| 2016-03-2212:58:06 PM | 32.225 | 153.275 | 76.212 | 34.925 |
| 2016-03-2212:58:13 PM | 32.225 | 153.5 | 76.325 | 34.7 |
| 2016-03-2212:58:19 PM | 32.338 | 153.838 | 76.212 | 34.475 |
| 2016-03-2212:58:25 PM | 32.225 | 153.95 | 76.212 | 34.475 |
| 2016-03-2212:58:31 PM | 32.225 | 153.95 | 76.325 | 34.475 |
| 2016-03-2212:58:37 PM | 32.338 | 153.95 | 76.212 | 34.475 |
| 2016-03-2212:58:44 PM | 32.225 | 153.838 | 76.212 | 34.475 |
| 2016-03-2212:58:50 PM | 32.338 | 153.838 | 76.212 | 34.475 |
| 2016-03-2212:58:56 PM | 32.338 | 153.838 | 76.212 | 34.362 |
| 2016-03-2212:59:02 PM | 32.338 | 153.612 | 76.212 | 34.25 |
| 2016-03-2212:59:09 PM | 32.338 | 153.5 | 76.212 | 33.912 |
| 2016-03-2212:59:15 PM | 32.338 | 153.05 | 76.212 | 33.8 |
| 2016-03-2212:59:21 PM | 32.338 | 152.712 | 76.212 | 33.575 |
| 2016-03-2212:59:27 PM | 32.225 | 152.15 | 76.212 | 33.238 |
| 2016-03-2212:59:33 PM | 32.225 | 151.588 | 76.212 | 32.9 |
| 2016-03-2212:59:40 PM | 32.225 | 150.912 | 76.212 | 32.562 |
| 2016-03-2212:59:46 PM | 32.338 | 150.238 | 76.1 | 32.562 |
| 2016-03-2212:59:52 PM | 32.225 | 149.562 | 76.1 | 32.338 |
| 2016-03-2212:59:58 PM | 32.338 | 148.888 | 76.1 | 32.225 |
| 2016-03-221:00:04 PM | 32.338 | 148.1 | 76.1 | 32 |
| 2016-03-221:00:11 PM | 32.338 | 147.312 | 76.1 | 31.888 |
| 2016-03-221:00:17 PM | 32.225 | 146.525 | 76.1 | 31.662 |
| 2016-03-221:00:23 PM | 32.338 | 145.625 | 76.1 | 31.55 |
| 2016-03-221:00:29 PM | 32.225 | 144.838 | 76.1 | 31.212 |
| 2016-03-221:00:36 PM | 32.225 | 144.05 | 75.988 | 31.1 |
| 2016-03-221:00:42 PM | 32.338 | 143.15 | 75.988 | 30.988 |
| 2016-03-221:00:48 PM | 32.338 | 142.362 | 75.988 | 30.875 |
| 2016-03-221:00:54 PM | 32.338 | 141.688 | 75.988 | 30.762 |
| 2016-03-221:01:01 PM | 32.338 | 140.788 | 75.875 | 30.538 |
| 2016-03-221:01:07 PM | 32.225 | 140.112 | 75.988 | 30.538 |
| 2016-03-221:01:13 PM | 32.225 | 139.325 | 75.988 | 30.538 |
| 2016-03-221:01:19 PM | 32.338 | 138.538 | 75.875 | 30.65 |
| 2016-03-221:01:25 PM | 32.338 | 137.75 | 75.875 | 30.65 |
| 2016-03-221:01:32 PM | 32.338 | 137.075 | 75.875 | 30.762 |
| 2016-03-221:01:38 PM | 32.338 | 136.512 | 75.875 | 30.762 |
| 2016-03-221:01:44 PM | 32.338 | 135.95 | 75.875 | 30.762 |
| 2016-03-221:01:50 PM | 32.338 | 135.388 | 75.875 | 30.65 |
| 2016-03-221:01:56 PM | 32.338 | 134.825 | 75.875 | 30.65 |
| 2016-03-221:02:03 PM | 32.338 | 134.15 | 75.875 | 30.65 |
| 2016-03-221:02:09 PM | 32.338 | 133.588 | 75.875 | 30.875 |
| 2016-03-221:02:15 PM | 32.225 | 133.025 | 75.875 | 31.325 |
| 2016-03-221:02:21 PM | 32.338 | 132.688 | 75.875 | 31.55 |
| 2016-03-221:02:28 PM | 32.225 | 132.35 | 75.875 | 31.55 |
| 2016-03-221:02:34 PM | 32.338 | 132.125 | 75.875 | 31.775 |
| 2016-03-221:02:40 PM | 32.225 | 132.125 | 75.875 | 31.775 |
| 2016-03-221:02:46 PM | 32.338 | 132.012 | 75.875 | 31.662 |
| 2016-03-221:02:52 PM | 32.225 | 132.125 | 75.875 | 31.888 |
| 2016-03-221:02:59 PM | 32.338 | 132.238 | 75.875 | 32.112 |
| 2016-03-221:03:05 PM | 32.338 | 132.35 | 75.762 | 32.338 |
| 2016-03-221:03:11 PM | 32.338 | 132.688 | 75.875 | 32.788 |
| 2016-03-221:03:17 PM | 32.338 | 132.912 | 75.762 | 32.9 |
| 2016-03-221:03:23 PM | 32.338 | 133.25 | 75.762 | 33.125 |
| 2016-03-221:03:30 PM | 32.338 | 133.7 | 75.762 | 33.238 |
| 2016-03-221:03:36 PM | 32.338 | 134.15 | 75.762 | 33.35 |
| 2016-03-221:03:42 PM | 32.338 | 134.488 | 75.762 | 33.462 |
| 2016-03-221:03:48 PM | 32.225 | 134.825 | 75.762 | 33.8 |
| 2016-03-221:03:54 PM | 32.338 | 135.05 | 75.762 | 34.138 |
| 2016-03-221:04:01 PM | 32.338 | 135.275 | 75.762 | 34.362 |
| 2016-03-221:04:07 PM | 32.338 | 135.5 | 75.762 | 34.138 |
| 2016-03-221:04:13 PM | 32.338 | 135.838 | 75.762 | 34.025 |
| 2016-03-221:04:19 PM | 32.225 | 136.175 | 75.762 | 33.912 |
| 2016-03-221:04:26 PM | 32.225 | 136.288 | 75.762 | 33.688 |
| 2016-03-221:04:32 PM | 32.338 | 136.288 | 75.762 | 33.238 |
| 2016-03-221:04:38 PM | 32.338 | 136.175 | 75.762 | 32.9 |
| 2016-03-221:04:44 PM | 32.225 | 136.062 | 75.762 | 32.788 |
| 2016-03-221:04:50 PM | 32.338 | 135.725 | 75.762 | 32.562 |
| 2016-03-221:04:57 PM | 32.338 | 135.388 | 75.65 | 32.562 |
| 2016-03-221:05:03 PM | 32.338 | 135.05 | 75.762 | 32.562 |
| 2016-03-221:05:09 PM | 32.225 | 134.712 | 75.65 | 32.675 |
| 2016-03-221:05:15 PM | 32.225 | 134.488 | 75.762 | 32.675 |
| 2016-03-221:05:22 PM | 32.225 | 134.375 | 75.65 | 32.788 |
| 2016-03-221:05:28 PM | 32.338 | 134.375 | 75.65 | 32.675 |
| 2016-03-221:05:34 PM | 32.225 | 134.488 | 75.762 | 32.338 |
| 2016-03-221:05:40 PM | 32.338 | 134.6 | 75.65 | 32.562 |
| 2016-03-221:05:47 PM | 32.225 | 134.712 | 75.65 | 32.788 |
| 2016-03-221:05:53 PM | 32.338 | 134.938 | 75.65 | 32.562 |
| 2016-03-221:05:59 PM | 32.338 | 135.275 | 75.65 | 32.675 |
| 2016-03-221:06:05 PM | 32.338 | 135.5 | 75.65 | 32.675 |
| 2016-03-221:06:12 PM | 32.225 | 135.725 | 75.65 | 32.788 |
| 2016-03-221:06:18 PM | 32.225 | 135.95 | 75.65 | 32.788 |
| 2016-03-221:06:24 PM | 32.225 | 136.175 | 75.65 | 32.788 |
| 2016-03-221:06:30 PM | 32.338 | 136.4 | 75.65 | 33.012 |
| 2016-03-221:06:36 PM | 32.338 | 136.625 | 75.65 | 33.238 |
| 2016-03-221:06:43 PM | 32.338 | 136.962 | 75.65 | 33.462 |
| 2016-03-221:06:49 PM | 32.338 | 137.3 | 75.65 | 33.8 |
| 2016-03-221:06:55 PM | 32.338 | 137.638 | 75.65 | 34.025 |
| 2016-03-221:07:01 PM | 32.338 | 137.975 | 75.65 | 34.475 |
| 2016-03-221:07:07 PM | 32.225 | 138.425 | 75.65 | 34.812 |
| 2016-03-221:07:14 PM | 32.338 | 138.875 | 75.65 | 34.812 |
| 2016-03-221:07:20 PM | 32.338 | 139.438 | 75.65 | 34.588 |
| 2016-03-221:07:26 PM | 32.338 | 139.888 | 75.65 | 34.138 |
| 2016-03-221:07:32 PM | 32.338 | 140.225 | 75.65 | 33.688 |
| 2016-03-221:07:38 PM | 32.338 | 140.338 | 75.65 | 33.575 |
| 2016-03-221:07:45 PM | 32.338 | 140.562 | 75.65 | 33.575 |
| 2016-03-221:07:51 PM | 32.338 | 140.45 | 75.65 | 33.8 |
| 2016-03-221:07:57 PM | 32.338 | 140.45 | 75.65 | 33.8 |
| 2016-03-221:08:04 PM | 32.225 | 140.562 | 75.65 | 33.8 |
| 2016-03-221:08:10 PM | 32.225 | 140.675 | 75.65 | 33.462 |
| 2016-03-221:08:16 PM | 32.338 | 140.675 | 75.65 | 33.125 |
| 2016-03-221:08:22 PM | 32.338 | 140.675 | 75.65 | 33.012 |
| 2016-03-221:08:28 PM | 32.225 | 140.562 | 75.65 | 32.9 |
| 2016-03-221:08:35 PM | 32.338 | 140.225 | 75.65 | 32.45 |
| 2016-03-221:08:41 PM | 32.225 | 139.888 | 75.65 | 32.112 |
| 2016-03-221:08:47 PM | 32.225 | 139.55 | 75.65 | 31.775 |
| 2016-03-221:08:53 PM | 32.338 | 139.212 | 75.65 | 31.325 |
| 2016-03-221:09:00 PM | 32.338 | 138.762 | 75.538 | 31.438 |
| 2016-03-221:09:06 PM | 32.338 | 138.2 | 75.538 | 31.55 |
| 2016-03-221:09:12 PM | 32.338 | 137.75 | 75.538 | 31.55 |
| 2016-03-221:09:18 PM | 32.225 | 137.412 | 75.538 | 31.662 |
| 2016-03-221:09:25 PM | 32.225 | 137.075 | 75.538 | 32 |
| 2016-03-221:09:31 PM | 32.338 | 136.738 | 75.538 | 31.888 |
| 2016-03-221:09:37 PM | 32.225 | 136.512 | 75.538 | 31.888 |
| 2016-03-221:09:42 PM | 32.338 | 136.175 | 75.538 | 31.662 |
| 2016-03-221:09:49 PM | 32.225 | 135.838 | 75.538 | 31.55 |
| 2016-03-221:09:55 PM | 32.225 | 135.612 | 75.538 | 31.55 |
| 2016-03-221:10:01 PM | 32.225 | 135.162 | 75.538 | 31.662 |
| 2016-03-221:10:07 PM | 32.338 | 134.938 | 75.538 | 31.662 |
| 2016-03-221:10:14 PM | 32.338 | 134.825 | 75.538 | 31.55 |
| 2016-03-221:10:20 PM | 32.338 | 134.6 | 75.538 | 31.55 |
| 2016-03-221:10:26 PM | 32.338 | 134.262 | 75.538 | 31.438 |
| 2016-03-221:10:32 PM | 32.338 | 133.925 | 75.538 | 31.438 |
| 2016-03-221:10:38 PM | 32.338 | 133.475 | 75.538 | 31.325 |
| 2016-03-221:10:45 PM | 32.225 | 133.025 | 75.538 | 30.988 |
| 2016-03-221:10:51 PM | 32.225 | 132.575 | 75.538 | 30.988 |
| 2016-03-221:10:57 PM | 32.225 | 132.012 | 75.538 | 30.875 |
| 2016-03-221:11:03 PM | 32.225 | 131.675 | 75.538 | 30.65 |
| 2016-03-221:11:09 PM | 32.338 | 131.112 | 75.538 | 30.538 |
| 2016-03-221:11:16 PM | 32.225 | 130.662 | 75.538 | 30.538 |
| 2016-03-221:11:22 PM | 32.225 | 130.1 | 75.538 | 30.312 |
| 2016-03-221:11:28 PM | 32.338 | 129.538 | 75.538 | 29.975 |
| 2016-03-221:11:34 PM | 32.225 | 129.088 | 75.538 | 29.862 |
| 2016-03-221:11:40 PM | 32.338 | 128.412 | 75.425 | 29.862 |
| 2016-03-221:11:47 PM | 32.225 | 127.85 | 75.425 | 29.862 |
| 2016-03-221:11:53 PM | 32.338 | 127.288 | 75.425 | 30.088 |
| 2016-03-221:11:59 PM | 32.338 | 126.725 | 75.425 | 30.425 |
| 2016-03-221:12:05 PM | 32.225 | 126.163 | 75.425 | 30.875 |
| 2016-03-221:12:12 PM | 32.225 | 125.825 | 75.538 | 31.212 |
| 2016-03-221:12:18 PM | 32.225 | 125.6 | 75.538 | 31.662 |
| 2016-03-221:12:24 PM | 32.338 | 125.488 | 75.538 | 32 |
| 2016-03-221:12:30 PM | 32.225 | 125.488 | 75.538 | 32.338 |
| 2016-03-221:12:36 PM | 32.338 | 125.6 | 75.538 | 32.788 |
| 2016-03-221:12:43 PM | 32.338 | 125.825 | 75.538 | 33.012 |
| 2016-03-221:12:49 PM | 32.338 | 126.05 | 75.538 | 33.238 |
| 2016-03-221:12:55 PM | 32.338 | 126.5 | 75.538 | 33.462 |
| 2016-03-221:13:01 PM | 32.225 | 126.838 | 75.538 | 33.8 |
| 2016-03-221:13:07 PM | 32.338 | 127.288 | 75.425 | 34.025 |
| 2016-03-221:13:14 PM | 32.338 | 127.85 | 75.425 | 34.025 |
| 2016-03-221:13:20 PM | 32.338 | 128.3 | 75.425 | 34.025 |
| 2016-03-221:13:26 PM | 32.225 | 128.75 | 75.425 | 33.912 |
| 2016-03-221:13:32 PM | 32.338 | 129.312 | 75.538 | 33.8 |
| 2016-03-221:13:38 PM | 32.338 | 129.762 | 75.538 | 33.912 |
| 2016-03-221:13:45 PM | 32.338 | 130.325 | 75.425 | 33.8 |
| 2016-03-221:13:51 PM | 32.225 | 130.887 | 75.425 | 33.688 |
| 2016-03-221:13:57 PM | 32.338 | 131.45 | 75.538 | 33.912 |
| 2016-03-221:14:03 PM | 32.225 | 131.9 | 75.538 | 34.025 |
| 2016-03-221:14:09 PM | 32.225 | 132.462 | 75.425 | 34.138 |
| 2016-03-221:14:16 PM | 32.338 | 132.912 | 75.538 | 34.138 |
| 2016-03-221:14:22 PM | 32.338 | 133.475 | 75.425 | 34.25 |
| 2016-03-221:14:28 PM | 32.338 | 133.925 | 75.538 | 34.362 |
| 2016-03-221:14:34 PM | 32.338 | 134.488 | 75.538 | 34.25 |
| 2016-03-221:14:41 PM | 32.338 | 134.938 | 75.538 | 34.138 |
| 2016-03-221:14:47 PM | 32.338 | 135.388 | 75.538 | 34.025 |
| 2016-03-221:14:53 PM | 32.338 | 135.95 | 75.538 | 34.025 |
| 2016-03-221:14:59 PM | 32.338 | 136.4 | 75.65 | 34.025 |
| 2016-03-221:15:06 PM | 32.338 | 136.962 | 75.65 | 34.025 |
| 2016-03-221:15:12 PM | 32.338 | 137.412 | 75.65 | 34.025 |
| 2016-03-221:15:18 PM | 32.338 | 137.862 | 75.65 | 34.138 |
| 2016-03-221:15:24 PM | 32.225 | 138.312 | 75.65 | 34.25 |
| 2016-03-221:15:30 PM | 32.338 | 138.762 | 75.65 | 34.362 |
| 2016-03-221:15:37 PM | 32.338 | 139.1 | 75.65 | 34.588 |
| 2016-03-221:15:43 PM | 32.225 | 139.55 | 75.65 | 34.7 |
| 2016-03-221:15:49 PM | 32.338 | 140 | 75.65 | 34.7 |
| 2016-03-221:15:55 PM | 32.338 | 140.338 | 75.762 | 34.812 |
| 2016-03-221:16:02 PM | 32.338 | 140.675 | 75.762 | 34.7 |
| 2016-03-221:16:08 PM | 32.338 | 141.012 | 75.762 | 34.812 |
| 2016-03-221:16:14 PM | 32.225 | 141.35 | 75.65 | 34.925 |
| 2016-03-221:16:26 PM | 32.338 | 141.688 | 75.65 | 35.15 |
| 2016-03-221:16:33 PM | 32.338 | 142.025 | 75.65 | 35.15 |
| 2016-03-221:16:39 PM | 32.225 | 142.25 | 75.65 | 34.812 |
| 2016-03-221:16:45 PM | 32.338 | 142.588 | 75.762 | 34.812 |
| 2016-03-221:16:51 PM | 32.225 | 142.7 | 75.65 | 35.038 |
| 2016-03-221:16:58 PM | 32.338 | 142.812 | 75.762 | 35.15 |
| 2016-03-221:17:04 PM | 32.225 | 142.925 | 75.762 | 35.038 |
| 2016-03-221:17:10 PM | 32.225 | 142.925 | 75.65 | 34.925 |
| 2016-03-221:17:16 PM | 32.225 | 143.038 | 75.65 | 34.812 |
| 2016-03-221:17:23 PM | 32.338 | 143.15 | 75.538 | 34.475 |
| 2016-03-221:17:29 PM | 32.338 | 143.375 | 75.538 | 34.475 |
| 2016-03-221:17:35 PM | 32.338 | 143.488 | 75.538 | 34.7 |
| 2016-03-221:17:41 PM | 32.338 | 143.712 | 75.65 | 34.588 |
| 2016-03-221:17:47 PM | 32.338 | 143.938 | 75.538 | 34.475 |
| 2016-03-221:17:54 PM | 32.225 | 144.162 | 75.65 | 34.7 |
| 2016-03-221:18:00 PM | 32.338 | 144.388 | 75.65 | 34.7 |
| 2016-03-221:18:06 PM | 32.338 | 144.612 | 75.65 | 34.812 |
| 2016-03-221:18:12 PM | 32.338 | 144.838 | 75.65 | 34.7 |
| 2016-03-221:18:19 PM | 32.338 | 145.062 | 75.65 | 34.588 |
| 2016-03-221:18:25 PM | 32.338 | 145.288 | 75.65 | 34.588 |
| 2016-03-221:18:31 PM | 32.338 | 145.512 | 75.65 | 34.362 |
| 2016-03-221:18:37 PM | 32.338 | 145.738 | 75.65 | 34.475 |
| 2016-03-221:18:44 PM | 32.225 | 146.075 | 75.65 | 34.7 |
| 2016-03-221:18:50 PM | 32.338 | 146.3 | 75.65 | 34.588 |
| 2016-03-221:18:56 PM | 32.225 | 146.525 | 75.538 | 34.362 |
| 2016-03-221:19:02 PM | 32.338 | 146.862 | 75.65 | 34.588 |
| 2016-03-221:19:09 PM | 32.338 | 147.088 | 75.538 | 34.7 |
| 2016-03-221:19:15 PM | 32.338 | 147.425 | 75.538 | 35.038 |
| 2016-03-221:19:21 PM | 32.338 | 147.65 | 75.538 | 35.038 |
| 2016-03-221:19:27 PM | 32.338 | 147.875 | 75.538 | 34.925 |
| 2016-03-221:19:34 PM | 32.225 | 148.1 | 75.538 | 34.925 |
| 2016-03-221:19:40 PM | 32.338 | 148.438 | 75.538 | 35.038 |
| 2016-03-221:19:46 PM | 32.338 | 148.662 | 75.538 | 34.925 |
| 2016-03-221:19:52 PM | 32.338 | 148.888 | 75.538 | 34.925 |
| 2016-03-221:19:59 PM | 32.338 | 149.112 | 75.538 | 34.925 |
| 2016-03-221:20:05 PM | 32.338 | 149.45 | 75.538 | 34.812 |
| 2016-03-221:20:11 PM | 32.338 | 149.788 | 75.538 | 34.925 |
| 2016-03-221:20:17 PM | 32.338 | 150.013 | 75.538 | 35.038 |
| 2016-03-221:20:23 PM | 32.338 | 150.35 | 75.538 | 34.812 |
| 2016-03-221:20:29 PM | 32.338 | 150.912 | 75.538 | 34.362 |
| 2016-03-221:20:36 PM | 32.338 | 151.025 | 75.538 | 34.362 |
| 2016-03-221:20:42 PM | 32.338 | 151.025 | 75.538 | 34.25 |
| 2016-03-221:20:48 PM | 32.225 | 151.138 | 75.538 | 34.025 |
| 2016-03-221:20:54 PM | 32.338 | 151.25 | 75.538 | 33.912 |
| 2016-03-221:21:01 PM | 32.338 | 151.362 | 75.538 | 33.688 |
| 2016-03-221:21:07 PM | 32.338 | 151.475 | 75.538 | 33.8 |
| 2016-03-221:21:13 PM | 32.338 | 151.588 | 75.538 | 33.8 |
| 2016-03-221:21:19 PM | 32.225 | 151.7 | 75.538 | 33.912 |
| 2016-03-221:21:26 PM | 32.338 | 151.812 | 75.538 | 34.138 |
| 2016-03-221:21:32 PM | 32.225 | 151.925 | 75.538 | 34.25 |
| 2016-03-221:21:38 PM | 32.338 | 152.038 | 75.538 | 34.25 |
| 2016-03-221:21:44 PM | 32.338 | 152.263 | 75.538 | 34.25 |
| 2016-03-221:21:50 PM | 32.338 | 152.375 | 75.538 | 34.362 |
| 2016-03-221:21:57 PM | 32.225 | 152.488 | 75.65 | 34.475 |
| 2016-03-221:22:03 PM | 32.338 | 152.712 | 75.538 | 34.362 |
| 2016-03-221:22:09 PM | 32.225 | 152.825 | 75.538 | 34.25 |
| 2016-03-221:22:15 PM | 32.338 | 153.05 | 75.65 | 34.25 |
| 2016-03-221:22:22 PM | 32.338 | 153.162 | 75.65 | 34.25 |
| 2016-03-221:22:28 PM | 32.338 | 153.388 | 75.65 | 34.362 |
| 2016-03-221:22:34 PM | 32.338 | 153.5 | 75.65 | 34.362 |
| 2016-03-221:22:40 PM | 32.338 | 153.725 | 75.65 | 34.475 |
| 2016-03-221:22:47 PM | 32.338 | 153.838 | 75.65 | 34.362 |
| 2016-03-221:22:51 PM | 32.338 | 154.062 | 75.65 | 34.362 |
| 2016-03-221:22:58 PM | 32.338 | 154.175 | 75.65 | 34.475 |
| 2016-03-221:23:04 PM | 32.338 | 154.288 | 75.65 | 34.588 |
| 2016-03-221:23:10 PM | 32.338 | 154.513 | 75.65 | 34.7 |
| 2016-03-221:23:16 PM | 32.225 | 154.738 | 75.65 | 34.7 |
| 2016-03-221:23:22 PM | 32.338 | 154.85 | 75.65 | 34.812 |
| 2016-03-221:23:29 PM | 32.338 | 155.075 | 75.762 | 34.812 |
| 2016-03-221:23:35 PM | 32.338 | 155.3 | 75.762 | 34.588 |
| 2016-03-221:23:41 PM | 32.338 | 155.638 | 75.762 | 34.588 |
| 2016-03-221:23:47 PM | 32.338 | 155.75 | 75.762 | 34.588 |
| 2016-03-221:23:54 PM | 32.338 | 155.975 | 75.762 | 34.475 |
| 2016-03-221:24:00 PM | 32.338 | 156.2 | 75.762 | 34.475 |
| 2016-03-221:24:06 PM | 32.338 | 156.312 | 75.762 | 34.588 |
| 2016-03-221:24:12 PM | 32.338 | 156.425 | 75.762 | 34.475 |
| 2016-03-221:24:19 PM | 32.338 | 156.538 | 75.762 | 34.475 |
| 2016-03-221:24:23 PM | 32.338 | 156.763 | 75.875 | 34.475 |
| 2016-03-221:24:30 PM | 32.338 | 156.875 | 75.762 | 34.475 |
| 2016-03-221:24:36 PM | 32.338 | 156.988 | 75.762 | 34.588 |
| 2016-03-221:24:42 PM | 32.338 | 157.212 | 75.875 | 34.812 |
| 2016-03-221:24:48 PM | 32.338 | 157.325 | 75.875 | 35.038 |
| 2016-03-221:24:55 PM | 32.338 | 157.55 | 75.875 | 35.15 |
| 2016-03-221:25:01 PM | 32.338 | 157.662 | 75.875 | 35.262 |
| 2016-03-221:25:07 PM | 32.338 | 157.888 | 75.875 | 35.262 |
| 2016-03-221:25:13 PM | 32.338 | 158 | 75.875 | 34.925 |
| 2016-03-221:25:20 PM | 32.225 | 158.225 | 75.875 | 34.7 |
| 2016-03-221:25:26 PM | 32.338 | 158.338 | 75.875 | 34.7 |
| 2016-03-221:25:32 PM | 32.338 | 158.562 | 75.875 | 34.7 |
| 2016-03-221:25:38 PM | 32.338 | 158.675 | 75.875 | 34.925 |
| 2016-03-221:25:44 PM | 32.338 | 158.9 | 75.875 | 35.262 |
| 2016-03-221:25:51 PM | 32.338 | 159.013 | 75.875 | 35.375 |
| 2016-03-221:25:57 PM | 32.338 | 159.238 | 75.988 | 35.712 |
| 2016-03-221:26:03 PM | 32.338 | 159.35 | 75.988 | 35.938 |
| 2016-03-221:26:09 PM | 32.225 | 159.462 | 75.988 | 36.05 |
| 2016-03-221:26:16 PM | 32.225 | 159.688 | 75.988 | 36.162 |
| 2016-03-221:26:22 PM | 32.225 | 159.8 | 75.988 | 36.275 |
| 2016-03-221:26:28 PM | 32.338 | 159.912 | 75.988 | 36.612 |
| 2016-03-221:26:34 PM | 32.338 | 160.025 | 76.1 | 36.95 |
| 2016-03-221:26:41 PM | 32.338 | 160.25 | 76.1 | 36.95 |
| 2016-03-221:26:47 PM | 32.338 | 160.362 | 76.1 | 37.175 |
| 2016-03-221:26:53 PM | 32.338 | 160.588 | 76.1 | 37.175 |
| 2016-03-221:26:59 PM | 32.338 | 160.7 | 76.1 | 37.175 |
| 2016-03-221:27:06 PM | 32.338 | 160.925 | 76.1 | 37.062 |
| 2016-03-221:27:12 PM | 32.225 | 161.038 | 76.1 | 36.95 |
| 2016-03-221:27:18 PM | 32.225 | 161.263 | 76.1 | 36.838 |
| 2016-03-221:27:24 PM | 32.338 | 161.375 | 76.1 | 36.612 |
| 2016-03-221:27:31 PM | 32.225 | 161.6 | 76.1 | 36.5 |
| 2016-03-221:27:37 PM | 32.338 | 161.712 | 76.1 | 36.5 |
| 2016-03-221:27:43 PM | 32.225 | 161.938 | 76.212 | 36.612 |
| 2016-03-221:27:49 PM | 32.338 | 162.05 | 76.212 | 36.5 |
| 2016-03-221:27:55 PM | 32.225 | 162.162 | 76.212 | 36.5 |
| 2016-03-221:28:02 PM | 32.225 | 162.388 | 76.212 | 36.612 |
| 2016-03-221:28:08 PM | 32.338 | 162.5 | 76.212 | 36.725 |
| 2016-03-221:28:14 PM | 32.338 | 162.612 | 76.1 | 36.725 |
| 2016-03-221:28:20 PM | 32.338 | 162.838 | 76.212 | 36.838 |
| 2016-03-221:28:27 PM | 32.338 | 162.95 | 76.1 | 37.062 |
| 2016-03-221:28:33 PM | 32.338 | 163.062 | 76.1 | 37.175 |
| 2016-03-221:28:39 PM | 32.338 | 163.175 | 76.1 | 37.288 |
| 2016-03-221:28:45 PM | 32.338 | 163.4 | 76.1 | 37.062 |
| 2016-03-221:28:52 PM | 32.225 | 163.513 | 76.1 | 37.062 |
| 2016-03-221:28:58 PM | 32.225 | 163.738 | 76.212 | 37.175 |
| 2016-03-221:29:04 PM | 32.338 | 163.738 | 76.212 | 37.4 |
| 2016-03-221:29:10 PM | 32.225 | 163.962 | 76.212 | 37.738 |
| 2016-03-221:29:17 PM | 32.338 | 164.075 | 76.212 | 38.075 |
| 2016-03-221:29:23 PM | 32.338 | 164.188 | 76.325 | 38.075 |
| 2016-03-221:29:29 PM | 32.225 | 164.3 | 76.325 | 37.962 |
| 2016-03-221:29:35 PM | 32.338 | 164.412 | 76.325 | 37.962 |
| 2016-03-221:29:41 PM | 32.338 | 164.525 | 76.325 | 37.962 |
| 2016-03-221:29:48 PM | 32.338 | 164.75 | 76.325 | 38.188 |
| 2016-03-221:29:54 PM | 32.338 | 164.862 | 76.438 | 38.412 |
| 2016-03-221:30:00 PM | 32.338 | 164.975 | 76.325 | 38.525 |
| 2016-03-221:30:06 PM | 32.338 | 165.2 | 76.438 | 38.525 |
| 2016-03-221:30:13 PM | 32.338 | 165.2 | 76.325 | 38.525 |
| 2016-03-221:30:19 PM | 32.225 | 165.425 | 76.325 | 38.525 |
| 2016-03-221:30:25 PM | 32.338 | 165.425 | 76.438 | 38.525 |
| 2016-03-221:30:31 PM | 32.338 | 165.65 | 76.438 | 38.3 |
| 2016-03-221:30:38 PM | 32.338 | 165.65 | 76.438 | 38.188 |
| 2016-03-221:30:44 PM | 32.338 | 165.763 | 76.438 | 38.188 |
| 2016-03-221:30:50 PM | 32.225 | 165.875 | 76.438 | 38.188 |
| 2016-03-221:30:56 PM | 32.338 | 165.875 | 76.438 | 38.075 |
| 2016-03-221:31:02 PM | 32.338 | 165.988 | 76.438 | 37.962 |
| 2016-03-221:31:09 PM | 32.338 | 165.988 | 76.438 | 37.85 |
| 2016-03-221:31:15 PM | 32.225 | 166.1 | 76.438 | 37.85 |
| 2016-03-221:31:21 PM | 32.338 | 166.1 | 76.438 | 37.85 |
| 2016-03-221:31:27 PM | 32.338 | 166.212 | 76.438 | 37.625 |
| 2016-03-221:31:34 PM | 32.338 | 166.212 | 76.438 | 37.512 |
| 2016-03-221:31:40 PM | 32.225 | 166.325 | 76.438 | 37.4 |
| 2016-03-221:31:46 PM | 32.338 | 166.325 | 76.438 | 37.175 |
| 2016-03-221:31:52 PM | 32.338 | 166.325 | 76.55 | 37.175 |
| 2016-03-221:31:58 PM | 32.338 | 166.325 | 76.438 | 36.838 |
| 2016-03-221:32:05 PM | 32.338 | 166.438 | 76.438 | 36.5 |
| 2016-03-221:32:11 PM | 32.338 | 166.438 | 76.438 | 36.275 |
| 2016-03-221:32:17 PM | 32.338 | 166.438 | 76.438 | 36.05 |
| 2016-03-221:32:23 PM | 32.338 | 166.438 | 76.438 | 35.825 |
| 2016-03-221:32:30 PM | 32.338 | 166.55 | 76.438 | 35.712 |
| 2016-03-221:32:36 PM | 32.338 | 166.55 | 76.438 | 35.712 |
| 2016-03-221:32:42 PM | 32.338 | 166.438 | 76.438 | 35.938 |
| 2016-03-221:32:48 PM | 32.338 | 166.55 | 76.438 | 35.712 |
| 2016-03-221:32:55 PM | 32.338 | 166.55 | 76.438 | 35.938 |
| 2016-03-221:33:01 PM | 32.338 | 166.55 | 76.438 | 35.938 |
| 2016-03-221:33:07 PM | 32.338 | 166.438 | 76.438 | 35.938 |
| 2016-03-221:33:13 PM | 32.225 | 166.55 | 76.438 | 35.825 |
| 2016-03-221:33:19 PM | 32.338 | 166.55 | 76.438 | 35.825 |
| 2016-03-221:33:26 PM | 32.338 | 166.55 | 76.438 | 35.712 |
| 2016-03-221:33:32 PM | 32.225 | 166.55 | 76.438 | 35.262 |
| 2016-03-221:33:38 PM | 32.338 | 166.55 | 76.438 | 35.038 |
| 2016-03-221:33:44 PM | 32.338 | 166.438 | 76.438 | 35.15 |
| 2016-03-221:33:51 PM | 32.338 | 166.438 | 76.438 | 34.925 |
| 2016-03-221:33:57 PM | 32.338 | 166.438 | 76.438 | 34.925 |
| 2016-03-221:34:03 PM | 32.338 | 166.325 | 76.438 | 35.038 |
| 2016-03-221:34:09 PM | 32.338 | 166.212 | 76.438 | 35.262 |
| 2016-03-221:34:16 PM | 32.338 | 166.212 | 76.438 | 35.375 |
| 2016-03-221:34:22 PM | 32.225 | 166.212 | 76.325 | 35.262 |
| 2016-03-221:34:28 PM | 32.338 | 166.1 | 76.438 | 35.038 |
| 2016-03-221:34:34 PM | 32.338 | 166.1 | 76.325 | 35.038 |
| 2016-03-221:34:40 PM | 32.225 | 165.988 | 76.438 | 35.038 |
| 2016-03-221:34:47 PM | 32.338 | 165.988 | 76.325 | 35.038 |
| 2016-03-221:34:53 PM | 32.225 | 165.875 | 76.438 | 35.038 |
| 2016-03-221:34:59 PM | 32.338 | 165.875 | 76.438 | 35.038 |
| 2016-03-221:35:05 PM | 32.338 | 165.875 | 76.438 | 35.15 |
| 2016-03-221:35:12 PM | 32.338 | 165.875 | 76.438 | 35.375 |
| 2016-03-221:35:18 PM | 32.225 | 165.763 | 76.438 | 35.6 |
| 2016-03-221:35:24 PM | 32.225 | 165.65 | 76.438 | 35.712 |
| 2016-03-221:35:30 PM | 32.225 | 165.65 | 76.438 | 35.712 |
| 2016-03-221:35:36 PM | 32.338 | 165.65 | 76.438 | 35.825 |
| 2016-03-221:35:43 PM | 32.338 | 165.65 | 76.438 | 35.825 |
| 2016-03-221:35:49 PM | 32.338 | 165.538 | 76.438 | 35.938 |
| 2016-03-221:35:55 PM | 32.338 | 165.538 | 76.438 | 35.825 |
| 2016-03-221:36:01 PM | 32.338 | 165.425 | 76.438 | 35.712 |
| 2016-03-221:36:08 PM | 32.338 | 165.425 | 76.438 | 35.488 |
| 2016-03-221:36:14 PM | 32.338 | 165.312 | 76.438 | 35.375 |
| 2016-03-221:36:20 PM | 32.338 | 165.2 | 76.438 | 35.488 |
| 2016-03-221:36:26 PM | 32.225 | 165.088 | 76.438 | 35.6 |
| 2016-03-221:36:33 PM | 32.225 | 165.088 | 76.438 | 35.6 |
| 2016-03-221:36:39 PM | 32.338 | 164.975 | 76.438 | 35.712 |
| 2016-03-221:36:45 PM | 32.338 | 164.862 | 76.438 | 35.6 |
| 2016-03-221:36:51 PM | 32.225 | 164.862 | 76.438 | 35.825 |
| 2016-03-221:36:57 PM | 32.338 | 164.75 | 76.438 | 35.825 |
| 2016-03-221:37:04 PM | 32.338 | 164.75 | 76.438 | 35.825 |
| 2016-03-221:37:10 PM | 32.338 | 164.75 | 76.438 | 35.938 |
| 2016-03-221:37:16 PM | 32.338 | 164.75 | 76.438 | 36.162 |
| 2016-03-221:37:22 PM | 32.338 | 164.75 | 76.438 | 36.388 |
| 2016-03-221:37:29 PM | 32.338 | 164.75 | 76.438 | 36.612 |
| 2016-03-221:37:35 PM | 32.225 | 164.75 | 76.438 | 36.95 |
| 2016-03-221:37:41 PM | 32.338 | 164.75 | 76.438 | 36.95 |
| 2016-03-221:37:47 PM | 32.338 | 164.75 | 76.438 | 36.725 |
| 2016-03-221:37:53 PM | 32.225 | 164.862 | 76.438 | 36.612 |
| 2016-03-221:38:00 PM | 32.338 | 164.862 | 76.438 | 36.612 |
| 2016-03-221:38:06 PM | 32.225 | 164.862 | 76.438 | 36.838 |
| 2016-03-221:38:12 PM | 32.338 | 164.975 | 76.55 | 36.838 |
| 2016-03-221:38:18 PM | 32.338 | 164.975 | 76.55 | 36.725 |
| 2016-03-221:38:25 PM | 32.338 | 164.975 | 76.438 | 36.838 |
| 2016-03-221:38:31 PM | 32.338 | 165.088 | 76.438 | 36.95 |
| 2016-03-221:38:37 PM | 32.338 | 165.088 | 76.438 | 37.062 |
| 2016-03-221:38:43 PM | 32.338 | 165.088 | 76.55 | 37.175 |
| 2016-03-221:38:50 PM | 32.225 | 165.088 | 76.438 | 37.175 |
| 2016-03-221:38:56 PM | 32.338 | 165.2 | 76.438 | 37.062 |
| 2016-03-221:39:02 PM | 32.338 | 165.2 | 76.55 | 37.175 |
| 2016-03-221:39:08 PM | 32.338 | 165.312 | 76.55 | 37.175 |
| 2016-03-221:39:15 PM | 32.338 | 165.312 | 76.55 | 37.288 |
| 2016-03-221:39:21 PM | 32.338 | 165.312 | 76.55 | 37.175 |
| 2016-03-221:39:27 PM | 32.338 | 165.425 | 76.55 | 36.95 |
| 2016-03-221:39:33 PM | 32.338 | 165.538 | 76.55 | 37.062 |
| 2016-03-221:39:40 PM | 32.225 | 165.538 | 76.55 | 37.175 |
| 2016-03-221:39:46 PM | 32.338 | 165.65 | 76.55 | 37.4 |
| 2016-03-221:39:52 PM | 32.338 | 165.65 | 76.55 | 37.512 |
| 2016-03-221:39:58 PM | 32.338 | 165.763 | 76.55 | 37.625 |
| 2016-03-221:40:04 PM | 32.338 | 165.875 | 76.55 | 37.625 |
| 2016-03-221:40:11 PM | 32.338 | 165.875 | 76.55 | 37.738 |
| 2016-03-221:40:17 PM | 32.338 | 165.875 | 76.55 | 37.85 |
| 2016-03-221:40:23 PM | 32.338 | 165.988 | 76.662 | 38.075 |
| 2016-03-221:40:29 PM | 32.338 | 166.1 | 76.662 | 38.075 |
| 2016-03-221:40:36 PM | 32.338 | 166.1 | 76.662 | 38.075 |
| 2016-03-221:40:42 PM | 32.338 | 166.1 | 76.662 | 38.075 |
| 2016-03-221:40:48 PM | 32.338 | 166.212 | 76.662 | 37.738 |
| 2016-03-221:40:54 PM | 32.338 | 166.325 | 76.662 | 37.625 |
| 2016-03-221:41:00 PM | 32.338 | 166.438 | 76.662 | 37.738 |
| 2016-03-221:41:07 PM | 32.225 | 166.438 | 76.662 | 37.85 |
| 2016-03-221:41:13 PM | 32.338 | 166.438 | 76.662 | 37.738 |
| 2016-03-221:41:19 PM | 32.338 | 166.55 | 76.662 | 37.625 |
| 2016-03-221:41:25 PM | 32.338 | 166.55 | 76.662 | 37.738 |
| 2016-03-221:41:32 PM | 32.338 | 166.662 | 76.662 | 37.738 |
| 2016-03-221:41:38 PM | 32.338 | 166.662 | 76.662 | 37.85 |
| 2016-03-221:41:44 PM | 32.338 | 166.775 | 76.662 | 37.738 |
| 2016-03-221:41:50 PM | 32.338 | 166.888 | 76.662 | 37.625 |
| 2016-03-221:41:57 PM | 32.338 | 167 | 76.662 | 37.738 |
| 2016-03-221:42:03 PM | 32.338 | 167 | 76.662 | 37.738 |
| 2016-03-221:42:09 PM | 32.338 | 167.112 | 76.662 | 37.512 |
| 2016-03-221:42:15 PM | 32.338 | 167.225 | 76.662 | 37.738 |
| 2016-03-221:42:21 PM | 32.338 | 167.338 | 76.662 | 37.85 |
| 2016-03-221:42:28 PM | 32.338 | 167.45 | 76.662 | 37.85 |
| 2016-03-221:42:34 PM | 32.225 | 167.562 | 76.662 | 37.625 |
| 2016-03-221:42:40 PM | 32.338 | 167.562 | 76.662 | 37.738 |
| 2016-03-221:42:46 PM | 32.338 | 167.788 | 76.662 | 37.85 |
| 2016-03-221:42:53 PM | 32.338 | 167.9 | 76.662 | 38.188 |
| 2016-03-221:42:59 PM | 32.338 | 168.013 | 76.662 | 38.412 |
| 2016-03-221:43:05 PM | 32.338 | 168.125 | 76.662 | 38.525 |
| 2016-03-221:43:11 PM | 32.338 | 168.125 | 76.662 | 38.638 |
| 2016-03-221:43:18 PM | 32.338 | 168.238 | 76.662 | 38.412 |
| 2016-03-221:43:24 PM | 32.338 | 168.462 | 76.662 | 38.525 |
| 2016-03-221:43:30 PM | 32.225 | 168.575 | 76.662 | 38.75 |
| 2016-03-221:43:36 PM | 32.338 | 168.688 | 76.662 | 38.638 |
| 2016-03-221:43:42 PM | 32.338 | 168.912 | 76.775 | 38.412 |
| 2016-03-221:43:49 PM | 32.338 | 169.025 | 76.775 | 38.525 |
| 2016-03-221:43:55 PM | 32.338 | 169.138 | 76.888 | 38.3 |
| 2016-03-221:44:01 PM | 32.338 | 169.362 | 76.888 | 38.3 |
| 2016-03-221:44:07 PM | 32.338 | 169.475 | 76.888 | 38.412 |
| 2016-03-221:44:14 PM | 32.338 | 169.588 | 76.888 | 38.412 |
| 2016-03-221:44:20 PM | 32.338 | 169.812 | 76.888 | 38.525 |
| 2016-03-221:44:26 PM | 32.225 | 170.038 | 76.775 | 38.638 |
| 2016-03-221:44:32 PM | 32.338 | 170.15 | 76.775 | 38.638 |
| 2016-03-221:44:38 PM | 32.338 | 170.263 | 76.888 | 38.75 |
| 2016-03-221:44:45 PM | 32.338 | 170.375 | 76.888 | 38.862 |
| 2016-03-221:44:51 PM | 32.338 | 170.488 | 76.888 | 38.975 |
| 2016-03-221:44:57 PM | 32.338 | 170.6 | 76.888 | 38.975 |
| 2016-03-221:45:03 PM | 32.338 | 170.825 | 76.888 | 38.75 |
| 2016-03-221:45:10 PM | 32.338 | 170.938 | 76.888 | 38.525 |
| 2016-03-221:45:16 PM | 32.338 | 171.05 | 77 | 38.412 |
| 2016-03-221:45:22 PM | 32.338 | 171.162 | 77 | 38.525 |
| 2016-03-221:45:28 PM | 32.338 | 171.275 | 77 | 38.638 |
| 2016-03-221:45:35 PM | 32.338 | 171.388 | 77.112 | 38.525 |
| 2016-03-221:45:41 PM | 32.338 | 171.5 | 77.112 | 38.412 |
| 2016-03-221:45:47 PM | 32.338 | 171.612 | 77.225 | 38.075 |
| 2016-03-221:45:53 PM | 32.338 | 171.725 | 77.112 | 37.625 |
| 2016-03-221:46:00 PM | 32.338 | 171.838 | 77.225 | 37.512 |
| 2016-03-221:46:06 PM | 32.338 | 171.95 | 77.225 | 37.4 |
| 2016-03-221:46:12 PM | 32.338 | 171.95 | 77.225 | 37.062 |
| 2016-03-221:46:18 PM | 32.338 | 171.95 | 77.225 | 36.612 |
| 2016-03-221:46:24 PM | 32.338 | 171.95 | 77.225 | 36.388 |
| 2016-03-221:46:31 PM | 32.338 | 171.95 | 77.225 | 36.5 |
| 2016-03-221:46:37 PM | 32.338 | 171.95 | 77.225 | 36.5 |
| 2016-03-221:46:43 PM | 32.338 | 171.95 | 77.225 | 36.388 |
| 2016-03-221:46:49 PM | 32.338 | 171.95 | 77.225 | 36.5 |
| 2016-03-221:46:55 PM | 32.338 | 171.838 | 77.225 | 36.5 |
| 2016-03-221:47:02 PM | 32.338 | 171.838 | 77.225 | 36.5 |
| 2016-03-221:47:08 PM | 32.338 | 171.838 | 77.338 | 36.5 |
| 2016-03-221:47:14 PM | 32.338 | 171.612 | 77.225 | 36.388 |
| 2016-03-221:47:20 PM | 32.338 | 171.612 | 77.225 | 36.388 |
| 2016-03-221:47:27 PM | 32.338 | 171.612 | 77.225 | 36.275 |
| 2016-03-221:47:33 PM | 32.338 | 171.612 | 77.225 | 36.05 |
| 2016-03-221:47:39 PM | 32.338 | 171.5 | 77.225 | 36.05 |
| 2016-03-221:47:45 PM | 32.338 | 171.388 | 77.225 | 36.162 |
| 2016-03-221:47:51 PM | 32.338 | 171.388 | 77.338 | 36.275 |
| 2016-03-221:47:58 PM | 32.338 | 171.388 | 77.338 | 36.5 |
| 2016-03-221:48:04 PM | 32.338 | 171.275 | 77.338 | 36.5 |
| 2016-03-221:48:10 PM | 32.338 | 171.162 | 77.338 | 36.838 |
| 2016-03-221:48:16 PM | 32.338 | 171.162 | 77.338 | 37.062 |
| 2016-03-221:48:23 PM | 32.338 | 171.162 | 77.338 | 37.4 |
| 2016-03-221:48:29 PM | 32.338 | 171.05 | 77.338 | 37.288 |
| 2016-03-221:48:35 PM | 32.338 | 171.05 | 77.225 | 37.288 |
| 2016-03-221:48:41 PM | 32.338 | 171.05 | 77.225 | 36.838 |
| 2016-03-221:48:47 PM | 32.338 | 170.938 | 77.225 | 36.725 |
| 2016-03-221:48:54 PM | 32.338 | 170.938 | 77.225 | 36.612 |
| 2016-03-221:49:00 PM | 32.338 | 170.825 | 77.225 | 36.725 |
| 2016-03-221:49:06 PM | 32.338 | 170.825 | 77.225 | 36.838 |
| 2016-03-221:49:12 PM | 32.338 | 170.825 | 77.225 | 36.725 |
| 2016-03-221:49:19 PM | 32.338 | 170.712 | 77.225 | 36.612 |
| 2016-03-221:49:25 PM | 32.338 | 170.712 | 77.225 | 36.725 |
| 2016-03-221:49:31 PM | 32.338 | 170.712 | 77.112 | 36.725 |
| 2016-03-221:49:37 PM | 32.338 | 170.6 | 77.112 | 36.838 |
| 2016-03-221:49:44 PM | 32.338 | 170.488 | 77.112 | 36.838 |
| 2016-03-221:49:50 PM | 32.338 | 170.488 | 77.112 | 37.062 |
| 2016-03-221:49:56 PM | 32.338 | 170.488 | 77.112 | 37.062 |
| 2016-03-221:50:02 PM | 32.338 | 170.375 | 77.112 | 37.288 |
| 2016-03-221:50:08 PM | 32.338 | 170.375 | 77.112 | 37.175 |
| 2016-03-221:50:15 PM | 32.338 | 170.263 | 77.112 | 37.062 |
| 2016-03-221:50:21 PM | 32.338 | 170.263 | 77.112 | 37.175 |
| 2016-03-221:50:27 PM | 32.338 | 170.263 | 77.112 | 37.4 |
| 2016-03-221:50:33 PM | 32.338 | 170.15 | 77.112 | 37.512 |
| 2016-03-221:50:40 PM | 32.338 | 170.15 | 77.112 | 37.738 |
| 2016-03-221:50:46 PM | 32.338 | 170.15 | 77.112 | 37.85 |
| 2016-03-221:50:52 PM | 32.338 | 170.038 | 77.112 | 37.85 |
| 2016-03-221:50:58 PM | 32.45 | 170.15 | 77.112 | 37.85 |
| 2016-03-221:51:04 PM | 32.338 | 170.15 | 77 | 37.738 |
| 2016-03-221:51:11 PM | 32.338 | 170.038 | 77.112 | 37.738 |
| 2016-03-221:51:17 PM | 32.338 | 170.038 | 77.112 | 37.85 |
| 2016-03-221:51:23 PM | 32.338 | 170.038 | 77.112 | 37.962 |
| 2016-03-221:51:29 PM | 32.338 | 169.925 | 77.112 | 37.962 |
| 2016-03-221:51:36 PM | 32.338 | 169.925 | 77.112 | 38.075 |
| 2016-03-221:51:42 PM | 32.338 | 169.925 | 77.112 | 38.075 |
| 2016-03-221:51:48 PM | 32.338 | 169.812 | 77 | 38.188 |
| 2016-03-221:51:54 PM | 32.338 | 169.812 | 77.112 | 38.3 |
| 2016-03-221:52:01 PM | 32.338 | 169.812 | 77.112 | 38.525 |
| 2016-03-221:52:07 PM | 32.45 | 169.812 | 77 | 38.638 |
| 2016-03-221:52:13 PM | 32.338 | 169.812 | 77 | 38.75 |
| 2016-03-221:52:19 PM | 32.338 | 169.812 | 77 | 38.862 |
| 2016-03-221:52:26 PM | 32.338 | 169.812 | 77.112 | 38.862 |
| 2016-03-221:52:32 PM | 32.338 | 169.925 | 77 | 38.862 |
| 2016-03-221:52:38 PM | 32.338 | 169.812 | 77 | 38.862 |
| 2016-03-221:52:44 PM | 32.338 | 169.925 | 77 | 38.75 |
| 2016-03-221:52:50 PM | 32.338 | 169.925 | 77 | 38.525 |
| 2016-03-221:52:57 PM | 32.338 | 170.038 | 77.112 | 38.638 |
| 2016-03-221:53:03 PM | 32.338 | 169.925 | 77.112 | 38.638 |
| 2016-03-221:53:09 PM | 32.338 | 169.812 | 77 | 38.525 |
| 2016-03-221:53:15 PM | 32.338 | 169.7 | 77.112 | 38.525 |
| 2016-03-221:53:22 PM | 32.338 | 169.7 | 77.112 | 38.075 |
| 2016-03-221:53:28 PM | 32.338 | 169.7 | 77.112 | 37.962 |
| 2016-03-221:53:34 PM | 32.338 | 169.7 | 77.112 | 37.962 |
| 2016-03-221:53:40 PM | 32.338 | 169.7 | 77.112 | 37.85 |
| 2016-03-221:53:47 PM | 32.338 | 169.7 | 77.112 | 37.962 |
| 2016-03-221:53:53 PM | 32.338 | 169.7 | 77.112 | 37.962 |
| 2016-03-221:53:59 PM | 32.338 | 169.7 | 77.112 | 37.962 |
| 2016-03-221:54:05 PM | 32.45 | 169.7 | 77.112 | 38.075 |
| 2016-03-221:54:12 PM | 32.338 | 169.7 | 77.112 | 37.85 |
| 2016-03-221:54:18 PM | 32.338 | 169.7 | 77.112 | 37.512 |
| 2016-03-221:54:24 PM | 32.338 | 169.7 | 77.112 | 37.625 |
| 2016-03-221:54:30 PM | 32.338 | 169.7 | 77.112 | 37.625 |
| 2016-03-221:54:37 PM | 32.338 | 169.7 | 77.112 | 37.85 |
| 2016-03-221:54:43 PM | 32.338 | 169.588 | 77.112 | 38.075 |
| 2016-03-221:54:49 PM | 32.338 | 169.588 | 77.112 | 38.3 |
| 2016-03-221:54:55 PM | 32.338 | 169.588 | 77.112 | 38.412 |
| 2016-03-221:55:01 PM | 32.45 | 169.588 | 77.112 | 38.412 |
| 2016-03-221:55:08 PM | 32.338 | 169.475 | 77.112 | 38.412 |
| 2016-03-221:55:14 PM | 32.338 | 169.475 | 77.112 | 38.638 |
| 2016-03-221:55:20 PM | 32.338 | 169.475 | 77.112 | 38.862 |
| 2016-03-221:55:26 PM | 32.45 | 169.362 | 77.112 | 39.088 |
| 2016-03-221:55:33 PM | 32.338 | 169.362 | 77.112 | 38.975 |
| 2016-03-221:55:39 PM | 32.338 | 169.362 | 77 | 39.088 |
| 2016-03-221:55:45 PM | 32.338 | 169.362 | 77 | 39.2 |
| 2016-03-221:55:51 PM | 32.45 | 169.362 | 77.112 | 39.088 |
| 2016-03-221:55:58 PM | 32.45 | 169.362 | 77.112 | 39.088 |
| 2016-03-221:56:04 PM | 32.338 | 169.25 | 77 | 39.088 |
| 2016-03-221:56:10 PM | 32.45 | 169.362 | 77 | 39.2 |
| 2016-03-221:56:16 PM | 32.45 | 169.362 | 77 | 39.312 |
| 2016-03-221:56:22 PM | 32.338 | 169.25 | 77.112 | 39.2 |
| 2016-03-221:56:29 PM | 32.338 | 169.25 | 77 | 39.2 |
| 2016-03-221:56:35 PM | 32.45 | 169.25 | 77 | 39.088 |
| 2016-03-221:56:41 PM | 32.338 | 169.25 | 77.112 | 39.088 |
| 2016-03-221:56:47 PM | 32.45 | 169.138 | 77.112 | 39.312 |
| 2016-03-221:56:54 PM | 32.45 | 169.138 | 77.112 | 39.2 |
| 2016-03-221:57:00 PM | 32.338 | 169.138 | 77.112 | 38.975 |
| 2016-03-221:57:06 PM | 32.338 | 169.138 | 77.112 | 38.862 |
| 2016-03-221:57:12 PM | 32.338 | 169.025 | 77.112 | 38.975 |
| 2016-03-221:57:19 PM | 32.338 | 169.025 | 77.112 | 38.975 |
| 2016-03-221:57:25 PM | 32.45 | 168.912 | 77.112 | 38.638 |
| 2016-03-221:57:31 PM | 32.45 | 168.912 | 77.112 | 38.412 |
| 2016-03-221:57:37 PM | 32.45 | 168.912 | 77.112 | 38.188 |
| 2016-03-221:57:43 PM | 32.45 | 168.8 | 77.112 | 38.188 |
| 2016-03-221:57:50 PM | 32.338 | 168.688 | 77.112 | 38.188 |
| 2016-03-221:57:56 PM | 32.45 | 168.688 | 77.112 | 38.188 |
| 2016-03-221:58:02 PM | 32.45 | 168.575 | 77.112 | 38.3 |
| 2016-03-221:58:08 PM | 32.338 | 168.575 | 77.112 | 38.188 |
| 2016-03-221:58:15 PM | 32.45 | 168.462 | 77 | 38.188 |
| 2016-03-221:58:21 PM | 32.45 | 168.462 | 77.112 | 38.3 |
| 2016-03-221:58:27 PM | 32.45 | 168.35 | 77.112 | 38.188 |
| 2016-03-221:58:33 PM | 32.45 | 168.35 | 77.112 | 38.075 |
| 2016-03-221:58:40 PM | 32.338 | 168.238 | 77.112 | 37.962 |
| 2016-03-221:58:46 PM | 32.45 | 168.238 | 77.112 | 37.625 |
| 2016-03-221:58:52 PM | 32.45 | 168.238 | 77.112 | 37.738 |
| 2016-03-221:58:58 PM | 32.45 | 168.125 | 77.112 | 37.738 |
| 2016-03-221:59:05 PM | 32.45 | 168.125 | 77.112 | 37.85 |
| 2016-03-221:59:11 PM | 32.45 | 168.125 | 77.112 | 37.962 |
| 2016-03-221:59:17 PM | 32.45 | 168.125 | 77.112 | 38.075 |
| 2016-03-221:59:23 PM | 32.45 | 168.013 | 77.112 | 38.188 |
| 2016-03-221:59:29 PM | 32.45 | 168.013 | 77.112 | 38.3 |
| 2016-03-221:59:36 PM | 32.45 | 167.9 | 77.112 | 38.638 |
| 2016-03-221:59:42 PM | 32.45 | 167.9 | 77.112 | 38.638 |
| 2016-03-221:59:48 PM | 32.45 | 167.788 | 77.112 | 38.638 |
| 2016-03-221:59:54 PM | 32.45 | 167.788 | 77.112 | 38.525 |
| 2016-03-222:00:01 PM | 32.45 | 167.788 | 77.112 | 38.525 |
| 2016-03-222:00:07 PM | 32.45 | 167.788 | 77.112 | 38.525 |
| 2016-03-222:00:13 PM | 32.45 | 167.788 | 77.112 | 38.3 |
| 2016-03-222:00:19 PM | 32.45 | 167.788 | 77.112 | 38.188 |
| 2016-03-222:00:25 PM | 32.45 | 167.675 | 77.112 | 38.075 |
| 2016-03-222:00:32 PM | 32.45 | 167.788 | 77.112 | 37.85 |
| 2016-03-222:00:38 PM | 32.45 | 167.675 | 77.112 | 37.85 |
| 2016-03-222:00:44 PM | 32.45 | 167.675 | 77.112 | 37.85 |
| 2016-03-222:00:50 PM | 32.45 | 167.675 | 77.112 | 37.738 |
| 2016-03-222:00:57 PM | 32.45 | 167.675 | 77.112 | 37.738 |
| 2016-03-222:01:03 PM | 32.45 | 167.675 | 77.112 | 37.738 |
| 2016-03-222:01:09 PM | 32.45 | 167.562 | 77.225 | 37.962 |
| 2016-03-222:01:15 PM | 32.45 | 167.562 | 77.225 | 37.962 |
| 2016-03-222:01:22 PM | 32.45 | 167.562 | 77.225 | 37.962 |
| 2016-03-222:01:28 PM | 32.45 | 167.562 | 77.225 | 37.85 |
| 2016-03-222:01:34 PM | 32.45 | 167.45 | 77.225 | 37.738 |
| 2016-03-222:01:40 PM | 32.45 | 167.45 | 77.225 | 37.625 |
| 2016-03-222:01:53 PM | 32.562 | 167.338 | 77.225 | 37.512 |
| 2016-03-222:01:59 PM | 32.45 | 167.338 | 77.112 | 37.625 |
| 2016-03-222:02:05 PM | 32.45 | 167.225 | 77.225 | 37.625 |
| 2016-03-222:02:11 PM | 32.45 | 167.112 | 77.112 | 37.625 |
| 2016-03-222:02:18 PM | 32.45 | 167 | 77.112 | 37.738 |
| 2016-03-222:02:24 PM | 32.45 | 167 | 77.225 | 37.85 |
| 2016-03-222:02:30 PM | 32.45 | 167 | 77.112 | 37.625 |
| 2016-03-222:02:36 PM | 32.45 | 167 | 77.112 | 37.738 |
| 2016-03-222:02:42 PM | 32.45 | 167 | 77.112 | 37.738 |
| 2016-03-222:02:49 PM | 32.45 | 166.888 | 77.112 | 37.738 |
| 2016-03-222:02:55 PM | 32.45 | 166.888 | 77.225 | 37.625 |
| 2016-03-222:03:01 PM | 32.562 | 166.888 | 77.225 | 37.4 |
| 2016-03-222:03:07 PM | 32.45 | 166.775 | 77.112 | 37.4 |
| 2016-03-222:03:14 PM | 32.45 | 166.775 | 77.112 | 37.512 |
| 2016-03-222:03:20 PM | 32.45 | 166.662 | 77.112 | 37.512 |
| 2016-03-222:03:26 PM | 32.45 | 166.662 | 77.112 | 37.175 |
| 2016-03-222:03:32 PM | 32.45 | 166.662 | 77.112 | 37.175 |
| 2016-03-222:03:38 PM | 32.45 | 166.662 | 77.112 | 37.175 |
| 2016-03-222:03:51 PM | 32.45 | 166.55 | 77.112 | 37.175 |
| 2016-03-222:03:57 PM | 32.45 | 166.438 | 77.112 | 37.4 |
| 2016-03-222:04:03 PM | 32.45 | 166.438 | 77.112 | 37.625 |
| 2016-03-222:04:09 PM | 32.45 | 166.325 | 77.112 | 37.738 |
| 2016-03-222:04:16 PM | 32.562 | 166.325 | 77.112 | 37.85 |
| 2016-03-222:04:22 PM | 32.562 | 166.325 | 77.112 | 37.85 |
| 2016-03-222:04:28 PM | 32.45 | 166.212 | 77.112 | 37.85 |
| 2016-03-222:04:34 PM | 32.45 | 166.1 | 77.112 | 38.075 |
| 2016-03-222:04:41 PM | 32.562 | 166.1 | 77.112 | 37.85 |
| 2016-03-222:04:47 PM | 32.45 | 166.1 | 77 | 37.962 |
| 2016-03-222:04:53 PM | 32.562 | 165.988 | 77 | 38.075 |
| 2016-03-222:04:59 PM | 32.562 | 165.988 | 77.112 | 37.962 |
| 2016-03-222:05:06 PM | 32.562 | 165.988 | 77.112 | 37.738 |
| 2016-03-222:05:12 PM | 32.562 | 165.988 | 77.112 | 37.625 |
| 2016-03-222:05:18 PM | 32.45 | 165.988 | 77.112 | 37.512 |
| 2016-03-222:05:24 PM | 32.562 | 165.875 | 77.112 | 37.512 |
| 2016-03-222:05:31 PM | 32.562 | 165.875 | 77 | 37.738 |
| 2016-03-222:05:37 PM | 32.562 | 165.763 | 77 | 37.738 |
| 2016-03-222:05:43 PM | 32.45 | 165.763 | 77 | 37.738 |
| 2016-03-222:05:49 PM | 32.45 | 165.763 | 77 | 37.738 |
| 2016-03-222:05:55 PM | 32.45 | 165.763 | 77.112 | 37.85 |
| 2016-03-222:06:02 PM | 32.562 | 165.763 | 77.112 | 37.85 |
| 2016-03-222:06:08 PM | 32.562 | 165.763 | 77.112 | 37.962 |
| 2016-03-222:06:13 PM | 32.562 | 165.65 | 77.112 | 37.85 |
| 2016-03-222:06:19 PM | 32.562 | 165.65 | 77.112 | 37.738 |
| 2016-03-222:06:25 PM | 32.562 | 165.65 | 77.112 | 37.512 |
| 2016-03-222:06:31 PM | 32.562 | 165.538 | 77.112 | 37.288 |
| 2016-03-222:06:38 PM | 32.562 | 165.425 | 77.112 | 37.288 |
| 2016-03-222:06:44 PM | 32.562 | 165.425 | 77.112 | 36.95 |
| 2016-03-222:06:50 PM | 32.562 | 165.425 | 77.112 | 36.95 |
| 2016-03-222:06:56 PM | 32.562 | 165.425 | 77.225 | 36.838 |
| 2016-03-222:07:03 PM | 32.562 | 165.312 | 77.112 | 36.838 |
| 2016-03-222:07:09 PM | 32.562 | 165.312 | 77.225 | 36.725 |
| 2016-03-222:07:15 PM | 32.562 | 165.2 | 77.225 | 36.388 |
| 2016-03-222:07:21 PM | 32.562 | 165.2 | 77.112 | 36.5 |
| 2016-03-222:07:28 PM | 32.562 | 165.2 | 77.225 | 36.5 |
| 2016-03-222:07:34 PM | 32.562 | 165.2 | 77.112 | 36.612 |
| 2016-03-222:07:40 PM | 32.562 | 165.088 | 77.225 | 36.612 |
| 2016-03-222:07:46 PM | 32.562 | 164.975 | 77.112 | 36.275 |
| 2016-03-222:07:53 PM | 32.562 | 164.975 | 77.225 | 36.275 |
| 2016-03-222:07:59 PM | 32.562 | 164.975 | 77.225 | 36.275 |
| 2016-03-222:08:05 PM | 32.562 | 164.862 | 77.112 | 36.275 |
| 2016-03-222:08:11 PM | 32.562 | 164.862 | 77.112 | 36.162 |
| 2016-03-222:08:18 PM | 32.562 | 164.75 | 77.112 | 36.275 |
| 2016-03-222:08:24 PM | 32.562 | 164.638 | 77.112 | 36.388 |
| 2016-03-222:08:30 PM | 32.562 | 164.525 | 77.112 | 36.388 |
| 2016-03-222:08:36 PM | 32.562 | 164.3 | 77.112 | 36.275 |
| 2016-03-222:08:43 PM | 32.562 | 164.188 | 77.112 | 36.162 |
| 2016-03-222:08:49 PM | 32.562 | 164.075 | 77.112 | 36.162 |
| 2016-03-222:08:55 PM | 32.562 | 163.962 | 77.112 | 36.05 |
| 2016-03-222:09:01 PM | 32.562 | 163.85 | 77.225 | 36.05 |
| 2016-03-222:09:07 PM | 32.562 | 163.738 | 77.225 | 35.825 |
| 2016-03-222:09:14 PM | 32.675 | 163.625 | 77.225 | 35.938 |
| 2016-03-222:09:20 PM | 32.675 | 163.513 | 77.225 | 35.938 |
| 2016-03-222:09:26 PM | 32.675 | 163.4 | 77.225 | 35.712 |
| 2016-03-222:09:32 PM | 32.562 | 163.175 | 77.225 | 35.6 |
| 2016-03-222:09:39 PM | 32.675 | 163.062 | 77.225 | 35.712 |
| 2016-03-222:09:45 PM | 32.675 | 162.95 | 77.225 | 35.6 |
| 2016-03-222:09:51 PM | 32.675 | 162.838 | 77.225 | 35.938 |
| 2016-03-222:09:57 PM | 32.562 | 162.725 | 77.225 | 36.162 |
| 2016-03-222:10:04 PM | 32.562 | 162.612 | 77.338 | 36.388 |
| 2016-03-222:10:10 PM | 32.675 | 162.5 | 77.225 | 36.5 |
| 2016-03-222:10:16 PM | 32.675 | 162.388 | 77.225 | 36.612 |
| 2016-03-222:10:22 PM | 32.675 | 162.162 | 77.225 | 36.612 |
| 2016-03-222:10:29 PM | 32.675 | 162.05 | 77.225 | 36.725 |
| 2016-03-222:10:35 PM | 32.675 | 161.938 | 77.225 | 36.838 |
| 2016-03-222:10:41 PM | 32.675 | 161.825 | 77.225 | 36.838 |
| 2016-03-222:10:47 PM | 32.675 | 161.712 | 77.225 | 36.612 |
| 2016-03-222:10:54 PM | 32.675 | 161.6 | 77.225 | 36.5 |
| 2016-03-222:11:06 PM | 32.675 | 161.488 | 77.225 | 36.162 |
| 2016-03-222:11:12 PM | 32.675 | 161.488 | 77.225 | 36.275 |
| 2016-03-222:11:18 PM | 32.675 | 161.263 | 77.225 | 36.388 |
| 2016-03-222:11:25 PM | 32.675 | 161.263 | 77.225 | 36.5 |
| 2016-03-222:11:31 PM | 32.675 | 161.15 | 77.225 | 36.388 |
| 2016-03-222:11:37 PM | 32.675 | 161.038 | 77.225 | 36.388 |
| 2016-03-222:11:43 PM | 32.675 | 161.038 | 77.225 | 36.162 |
| 2016-03-222:11:49 PM | 32.675 | 160.925 | 77.225 | 36.162 |
| 2016-03-222:11:56 PM | 32.675 | 160.812 | 77.225 | 35.938 |
| 2016-03-222:12:02 PM | 32.675 | 160.812 | 77.225 | 35.825 |
| 2016-03-222:12:08 PM | 32.675 | 160.7 | 77.338 | 35.825 |
| 2016-03-222:12:14 PM | 32.675 | 160.588 | 77.338 | 35.825 |
| 2016-03-222:12:21 PM | 32.675 | 160.588 | 77.225 | 35.825 |
| 2016-03-222:12:27 PM | 32.675 | 160.475 | 77.225 | 35.712 |
| 2016-03-222:12:33 PM | 32.675 | 160.362 | 77.225 | 35.825 |
| 2016-03-222:12:39 PM | 32.675 | 160.25 | 77.225 | 35.938 |
| 2016-03-222:12:46 PM | 32.675 | 160.25 | 77.225 | 35.712 |
| 2016-03-222:12:52 PM | 32.675 | 160.025 | 77.225 | 35.712 |
| 2016-03-222:12:58 PM | 32.562 | 159.912 | 77.225 | 35.825 |
| 2016-03-222:13:04 PM | 32.675 | 159.8 | 77.225 | 35.938 |
| 2016-03-222:13:10 PM | 32.675 | 159.575 | 77.225 | 36.162 |
| 2016-03-222:13:17 PM | 32.675 | 159.462 | 77.112 | 36.275 |
| 2016-03-222:13:23 PM | 32.675 | 159.238 | 77.112 | 36.275 |
| 2016-03-222:13:29 PM | 32.675 | 159.125 | 77.225 | 36.275 |
| 2016-03-222:13:35 PM | 32.675 | 158.9 | 77.225 | 36.275 |
| 2016-03-222:13:42 PM | 32.675 | 158.675 | 77.225 | 36.388 |
| 2016-03-222:13:48 PM | 32.675 | 158.45 | 77.225 | 36.5 |
| 2016-03-222:13:54 PM | 32.675 | 158.225 | 77.225 | 36.388 |
| 2016-03-222:14:00 PM | 32.675 | 158.112 | 77.225 | 36.388 |
| 2016-03-222:14:07 PM | 32.675 | 157.888 | 77.225 | 36.5 |
| 2016-03-222:14:13 PM | 32.675 | 157.662 | 77.225 | 36.612 |
| 2016-03-222:14:19 PM | 32.675 | 157.55 | 77.225 | 36.725 |
| 2016-03-222:14:25 PM | 32.675 | 157.438 | 77.225 | 36.838 |
| 2016-03-222:14:31 PM | 32.675 | 157.212 | 77.225 | 36.95 |
| 2016-03-222:14:38 PM | 32.675 | 157.1 | 77.225 | 36.95 |
| 2016-03-222:14:44 PM | 32.675 | 156.875 | 77.112 | 37.062 |
| 2016-03-222:14:50 PM | 32.675 | 156.763 | 77.225 | 37.062 |
| 2016-03-222:14:56 PM | 32.675 | 156.763 | 77.225 | 36.95 |
| 2016-03-222:15:03 PM | 32.675 | 156.65 | 77.225 | 36.838 |
| 2016-03-222:15:09 PM | 32.675 | 156.538 | 77.225 | 36.612 |
| 2016-03-222:15:15 PM | 32.675 | 156.538 | 77.112 | 36.275 |
| 2016-03-222:15:21 PM | 32.675 | 156.538 | 77.225 | 36.162 |
| 2016-03-222:15:28 PM | 32.675 | 156.425 | 77.112 | 36.275 |
| 2016-03-222:15:34 PM | 32.675 | 156.312 | 77.112 | 36.388 |
| 2016-03-222:15:40 PM | 32.675 | 156.2 | 77.225 | 36.275 |
| 2016-03-222:15:46 PM | 32.788 | 155.975 | 77.112 | 36.275 |
| 2016-03-222:15:52 PM | 32.788 | 155.862 | 77.112 | 36.388 |
| 2016-03-222:15:59 PM | 32.675 | 155.75 | 77.112 | 36.612 |
| 2016-03-222:16:05 PM | 32.788 | 155.638 | 77.112 | 36.5 |
| 2016-03-222:16:11 PM | 32.788 | 155.525 | 77.112 | 36.725 |
| 2016-03-222:16:17 PM | 32.788 | 155.412 | 77.112 | 36.725 |
| 2016-03-222:16:24 PM | 32.788 | 155.412 | 77.112 | 36.725 |
| 2016-03-222:16:30 PM | 32.788 | 155.3 | 77.112 | 36.95 |
| 2016-03-222:16:36 PM | 32.788 | 155.3 | 77.112 | 36.838 |
| 2016-03-222:16:42 PM | 32.788 | 155.188 | 77.112 | 36.838 |
| 2016-03-222:16:49 PM | 32.788 | 155.188 | 77.112 | 36.838 |
| 2016-03-222:16:55 PM | 32.788 | 155.188 | 77.112 | 36.95 |
| 2016-03-222:17:01 PM | 32.788 | 155.188 | 77.112 | 36.95 |
| 2016-03-222:17:07 PM | 32.788 | 155.188 | 77.112 | 36.95 |
| 2016-03-222:17:14 PM | 32.788 | 155.3 | 77.112 | 37.062 |
| 2016-03-222:17:20 PM | 32.788 | 155.3 | 77.112 | 36.95 |
| 2016-03-222:17:26 PM | 32.788 | 155.3 | 77.225 | 36.95 |
| 2016-03-222:17:32 PM | 32.788 | 155.412 | 77.112 | 37.062 |
| 2016-03-222:17:38 PM | 32.788 | 155.412 | 77.112 | 37.288 |
| 2016-03-222:17:45 PM | 32.788 | 155.412 | 77.112 | 37.175 |
| 2016-03-222:17:51 PM | 32.788 | 155.525 | 77.112 | 37.175 |
| 2016-03-222:17:57 PM | 32.788 | 155.525 | 77.225 | 37.288 |
| 2016-03-222:18:03 PM | 32.788 | 155.638 | 77.225 | 37.175 |
| 2016-03-222:18:10 PM | 32.9 | 155.75 | 77.225 | 37.175 |
| 2016-03-222:18:16 PM | 32.9 | 155.75 | 77.225 | 37.175 |
| 2016-03-222:18:22 PM | 32.9 | 155.862 | 77.225 | 37.288 |
| 2016-03-222:18:28 PM | 32.9 | 155.975 | 77.225 | 37.4 |
| 2016-03-222:18:35 PM | 32.9 | 156.088 | 77.225 | 37.625 |
| 2016-03-222:18:41 PM | 32.9 | 156.088 | 77.112 | 37.962 |
| 2016-03-222:18:47 PM | 32.9 | 156.2 | 77.225 | 38.188 |
| 2016-03-222:18:53 PM | 32.9 | 156.312 | 77.225 | 38.412 |
| 2016-03-222:18:59 PM | 32.9 | 156.425 | 77.112 | 38.525 |
| 2016-03-222:19:06 PM | 32.9 | 156.65 | 77.225 | 38.412 |
| 2016-03-222:19:12 PM | 32.9 | 156.763 | 77.112 | 38.525 |
| 2016-03-222:19:18 PM | 32.9 | 156.875 | 77.225 | 38.862 |
| 2016-03-222:19:24 PM | 32.9 | 156.988 | 77.225 | 38.975 |
| 2016-03-222:19:31 PM | 32.9 | 157.212 | 77.112 | 39.088 |
| 2016-03-222:19:37 PM | 32.9 | 157.325 | 77.225 | 39.2 |
| 2016-03-222:19:43 PM | 32.9 | 157.438 | 77.225 | 38.975 |
| 2016-03-222:19:49 PM | 32.9 | 157.662 | 77.112 | 38.862 |
| 2016-03-222:19:56 PM | 32.9 | 157.775 | 77.112 | 38.75 |
| 2016-03-222:20:02 PM | 32.9 | 157.888 | 77.112 | 38.525 |
| 2016-03-222:20:08 PM | 32.9 | 158.112 | 77.225 | 38.412 |
| 2016-03-222:20:14 PM | 32.9 | 158.225 | 77.112 | 38.075 |
| 2016-03-222:20:21 PM | 32.9 | 158.225 | 77.225 | 37.85 |
| 2016-03-222:20:27 PM | 32.9 | 158.112 | 77.225 | 37.738 |
| 2016-03-222:20:33 PM | 32.788 | 157.888 | 77.225 | 37.512 |
| 2016-03-222:20:39 PM | 32.9 | 157.662 | 77.112 | 37.288 |
| 2016-03-222:20:45 PM | 32.9 | 157.438 | 77.112 | 37.288 |
| 2016-03-222:20:52 PM | 32.9 | 157.212 | 77.112 | 37.625 |
| 2016-03-222:20:58 PM | 32.9 | 156.988 | 77.112 | 37.85 |
| 2016-03-222:21:04 PM | 32.9 | 156.875 | 77.225 | 37.738 |
| 2016-03-222:21:10 PM | 32.9 | 156.763 | 77.225 | 37.738 |
| 2016-03-222:21:16 PM | 32.788 | 156.65 | 77.225 | 37.062 |
| 2016-03-222:21:23 PM | 32.788 | 156.65 | 77.225 | 36.612 |
| 2016-03-222:21:29 PM | 32.9 | 156.65 | 77.112 | 35.938 |
| 2016-03-222:21:35 PM | 32.788 | 156.65 | 77.112 | 35.488 |
| 2016-03-222:21:41 PM | 32.788 | 156.425 | 77.225 | 35.15 |
| 2016-03-222:21:48 PM | 32.788 | 156.088 | 77.112 | 34.7 |
| 2016-03-222:21:54 PM | 32.675 | 155.638 | 77.112 | 34.362 |
| 2016-03-222:22:00 PM | 32.675 | 155.075 | 77.112 | 34.025 |
| 2016-03-222:22:06 PM | 32.675 | 154.625 | 77 | 33.688 |
| 2016-03-222:22:13 PM | 32.675 | 154.062 | 77.112 | 33.575 |
| 2016-03-222:22:19 PM | 32.675 | 153.388 | 77 | 33.35 |
| 2016-03-222:22:25 PM | 32.675 | 152.6 | 77 | 33.125 |
| 2016-03-222:22:31 PM | 32.675 | 151.812 | 77 | 32.788 |
| 2016-03-222:22:38 PM | 32.675 | 150.912 | 77 | 32.562 |
| 2016-03-222:22:44 PM | 32.675 | 150.013 | 77 | 32.338 |
| 2016-03-222:22:50 PM | 32.675 | 149 | 76.888 | 32 |
| 2016-03-222:22:56 PM | 32.562 | 147.988 | 76.888 | 31.775 |
| 2016-03-222:23:02 PM | 32.562 | 146.975 | 76.888 | 31.55 |
| 2016-03-222:23:09 PM | 32.562 | 145.962 | 76.888 | 31.438 |
| 2016-03-222:23:15 PM | 32.562 | 144.95 | 76.888 | 31.438 |
| 2016-03-222:23:21 PM | 32.562 | 143.825 | 76.888 | 31.1 |
| 2016-03-222:23:27 PM | 32.562 | 142.7 | 76.775 | 30.988 |
| 2016-03-222:23:34 PM | 32.562 | 141.688 | 76.775 | 31.1 |
| 2016-03-222:23:40 PM | 32.562 | 140.562 | 76.775 | 31.325 |
| 2016-03-222:23:46 PM | 32.562 | 139.55 | 76.775 | 31.212 |
| 2016-03-222:23:52 PM | 32.562 | 138.538 | 76.662 | 31.1 |
| 2016-03-222:23:59 PM | 32.562 | 137.638 | 76.662 | 31.1 |
| 2016-03-222:24:05 PM | 32.45 | 136.625 | 76.662 | 30.988 |
| 2016-03-222:24:11 PM | 32.45 | 135.838 | 76.662 | 30.875 |
| 2016-03-222:24:17 PM | 32.45 | 135.05 | 76.662 | 30.762 |
| 2016-03-222:24:24 PM | 32.45 | 134.262 | 76.662 | 30.762 |
| 2016-03-222:24:30 PM | 32.562 | 133.475 | 76.55 | 31.212 |
| 2016-03-222:24:36 PM | 32.562 | 132.575 | 76.55 | 31.55 |
| 2016-03-222:24:42 PM | 32.562 | 131.675 | 76.55 | 31.888 |
| 2016-03-222:24:49 PM | 32.562 | 130.775 | 76.55 | 32.225 |
| 2016-03-222:24:55 PM | 32.562 | 129.988 | 76.55 | 32.562 |
| 2016-03-222:25:01 PM | 32.562 | 129.312 | 76.55 | 32.9 |
| 2016-03-222:25:07 PM | 32.562 | 128.975 | 76.438 | 33.125 |
| 2016-03-222:25:14 PM | 32.675 | 128.637 | 76.438 | 33.35 |
| 2016-03-222:25:20 PM | 32.562 | 128.525 | 76.438 | 33.575 |
| 2016-03-222:25:26 PM | 32.675 | 128.412 | 76.438 | 33.8 |
| 2016-03-222:25:32 PM | 32.675 | 128.412 | 76.438 | 33.912 |
| 2016-03-222:25:38 PM | 32.675 | 128.412 | 76.438 | 33.912 |
| 2016-03-222:25:45 PM | 32.675 | 128.637 | 76.438 | 34.025 |
| 2016-03-222:25:51 PM | 32.675 | 128.863 | 76.438 | 34.362 |
| 2016-03-222:25:57 PM | 32.675 | 129.088 | 76.438 | 34.362 |
| 2016-03-222:26:03 PM | 32.675 | 129.312 | 76.438 | 34.7 |
| 2016-03-222:26:10 PM | 32.788 | 129.425 | 76.438 | 34.7 |
| 2016-03-222:26:16 PM | 32.788 | 129.425 | 76.438 | 34.7 |
| 2016-03-222:26:22 PM | 32.788 | 129.65 | 76.438 | 34.925 |
| 2016-03-222:26:28 PM | 32.675 | 129.762 | 76.438 | 35.038 |
| 2016-03-222:26:35 PM | 32.788 | 129.988 | 76.438 | 35.038 |
| 2016-03-222:26:41 PM | 32.788 | 130.1 | 76.438 | 34.925 |
| 2016-03-222:26:47 PM | 32.788 | 130.212 | 76.438 | 34.7 |
| 2016-03-222:26:53 PM | 32.675 | 130.325 | 76.438 | 34.588 |
| 2016-03-222:27:00 PM | 32.675 | 130.438 | 76.438 | 34.588 |
| 2016-03-222:27:06 PM | 32.675 | 130.325 | 76.438 | 34.25 |
| 2016-03-222:27:12 PM | 32.675 | 130.212 | 76.325 | 34.138 |
| 2016-03-222:27:18 PM | 32.675 | 129.988 | 76.325 | 34.25 |
| 2016-03-222:27:24 PM | 32.675 | 129.65 | 76.325 | 34.588 |
| 2016-03-222:27:31 PM | 32.675 | 129.312 | 76.325 | 34.588 |
| 2016-03-222:27:37 PM | 32.675 | 128.863 | 76.325 | 34.362 |
| 2016-03-222:27:43 PM | 32.675 | 128.525 | 76.325 | 34.025 |
| 2016-03-222:27:49 PM | 32.675 | 128.188 | 76.212 | 33.688 |
| 2016-03-222:27:55 PM | 32.788 | 128.075 | 76.212 | 33.462 |
| 2016-03-222:28:02 PM | 32.675 | 127.962 | 76.212 | 33.35 |
| 2016-03-222:28:08 PM | 32.675 | 127.85 | 76.212 | 33.35 |
| 2016-03-222:28:14 PM | 32.675 | 127.625 | 76.212 | 33.462 |
| 2016-03-222:28:20 PM | 32.788 | 127.288 | 76.212 | 33.8 |
| 2016-03-222:28:27 PM | 32.788 | 126.838 | 76.212 | 33.912 |
| 2016-03-222:28:33 PM | 32.788 | 126.388 | 76.212 | 34.138 |
| 2016-03-222:28:39 PM | 32.788 | 126.163 | 76.212 | 34.362 |
| 2016-03-222:28:45 PM | 32.788 | 125.938 | 76.212 | 34.475 |
| 2016-03-222:28:52 PM | 32.788 | 125.938 | 76.212 | 34.588 |
| 2016-03-222:28:58 PM | 32.788 | 125.938 | 76.212 | 34.812 |
| 2016-03-222:29:04 PM | 32.788 | 126.05 | 76.212 | 34.7 |
| 2016-03-222:29:10 PM | 32.788 | 126.275 | 76.212 | 34.7 |
| 2016-03-222:29:17 PM | 32.788 | 126.5 | 76.212 | 34.7 |
| 2016-03-222:29:23 PM | 32.9 | 126.838 | 76.212 | 34.812 |
| 2016-03-222:29:29 PM | 32.788 | 127.062 | 76.212 | 35.038 |
| 2016-03-222:29:35 PM | 32.9 | 127.4 | 76.212 | 35.375 |
| 2016-03-222:29:41 PM | 32.788 | 127.625 | 76.1 | 35.825 |
| 2016-03-222:29:48 PM | 32.9 | 127.85 | 76.212 | 36.05 |
| 2016-03-222:29:54 PM | 32.9 | 128.075 | 76.1 | 36.388 |
| 2016-03-222:30:00 PM | 32.9 | 128.412 | 76.1 | 36.5 |
| 2016-03-222:30:06 PM | 32.9 | 128.75 | 76.1 | 36.612 |
| 2016-03-222:30:13 PM | 32.9 | 129.088 | 76.1 | 36.838 |
| 2016-03-222:30:19 PM | 32.9 | 129.538 | 76.1 | 36.95 |
| 2016-03-222:30:25 PM | 32.9 | 129.875 | 76.1 | 37.062 |
| 2016-03-222:30:31 PM | 33.012 | 130.325 | 76.1 | 37.288 |
| 2016-03-222:30:37 PM | 33.012 | 130.775 | 76.1 | 37.4 |
| 2016-03-222:30:44 PM | 33.012 | 131.225 | 76.1 | 37.625 |
| 2016-03-222:30:50 PM | 33.012 | 131.788 | 76.1 | 37.85 |
| 2016-03-222:30:56 PM | 33.012 | 132.238 | 76.1 | 38.3 |
| 2016-03-222:31:02 PM | 33.012 | 132.688 | 76.212 | 38.638 |
| 2016-03-222:31:09 PM | 33.012 | 133.138 | 76.212 | 38.862 |
| 2016-03-222:31:15 PM | 33.012 | 133.7 | 76.1 | 38.975 |
| 2016-03-222:31:21 PM | 33.012 | 134.15 | 76.212 | 39.088 |
| 2016-03-222:31:27 PM | 33.012 | 134.712 | 76.212 | 39.2 |
| 2016-03-222:31:34 PM | 33.125 | 135.275 | 76.212 | 38.862 |
| 2016-03-222:31:40 PM | 33.125 | 135.725 | 76.212 | 38.638 |
| 2016-03-222:31:46 PM | 33.125 | 136.288 | 76.212 | 38.525 |
| 2016-03-222:31:52 PM | 33.125 | 136.738 | 76.212 | 38.638 |
| 2016-03-222:31:58 PM | 33.125 | 137.3 | 76.212 | 38.75 |
| 2016-03-222:32:05 PM | 33.125 | 137.862 | 76.212 | 38.638 |
| 2016-03-222:32:11 PM | 33.125 | 138.312 | 76.212 | 38.3 |
| 2016-03-222:32:17 PM | 33.238 | 138.762 | 76.212 | 38.188 |
| 2016-03-222:32:23 PM | 33.125 | 139.325 | 76.212 | 37.85 |
| 2016-03-222:32:30 PM | 33.238 | 139.775 | 76.212 | 37.738 |
| 2016-03-222:32:36 PM | 33.238 | 140.225 | 76.325 | 37.738 |
| 2016-03-222:32:42 PM | 33.238 | 140.675 | 76.325 | 37.625 |
| 2016-03-222:32:48 PM | 33.125 | 141.125 | 76.212 | 37.4 |
| 2016-03-222:32:54 PM | 33.125 | 141.462 | 76.325 | 37.062 |
| 2016-03-222:33:01 PM | 33.125 | 141.912 | 76.325 | 36.725 |
| 2016-03-222:33:07 PM | 33.125 | 142.362 | 76.212 | 36.838 |
| 2016-03-222:33:13 PM | 33.125 | 142.7 | 76.325 | 36.95 |
| 2016-03-222:33:19 PM | 33.125 | 142.925 | 76.212 | 36.838 |
| 2016-03-222:33:26 PM | 33.125 | 143.15 | 76.325 | 36.95 |
| 2016-03-222:33:32 PM | 33.125 | 143.038 | 76.212 | 37.062 |
| 2016-03-222:33:38 PM | 33.125 | 143.15 | 76.325 | 36.95 |
| 2016-03-222:33:44 PM | 33.125 | 143.262 | 76.325 | 37.062 |
| 2016-03-222:33:51 PM | 33.125 | 143.375 | 76.212 | 37.175 |
| 2016-03-222:33:57 PM | 33.125 | 143.6 | 76.325 | 37.4 |
| 2016-03-222:34:03 PM | 33.012 | 143.825 | 76.212 | 37.625 |
| 2016-03-222:34:09 PM | 33.125 | 144.05 | 76.212 | 37.85 |
| 2016-03-222:34:16 PM | 33.125 | 144.275 | 76.325 | 37.962 |
| 2016-03-222:34:22 PM | 33.125 | 144.612 | 76.325 | 38.188 |
| 2016-03-222:34:28 PM | 33.125 | 144.838 | 76.325 | 38.3 |
| 2016-03-222:34:34 PM | 33.125 | 145.175 | 76.325 | 38.412 |
| 2016-03-222:34:40 PM | 33.125 | 145.4 | 76.325 | 38.75 |
| 2016-03-222:34:47 PM | 33.125 | 145.738 | 76.325 | 38.75 |
| 2016-03-222:34:53 PM | 33.125 | 145.962 | 76.325 | 38.862 |
| 2016-03-222:34:59 PM | 33.125 | 146.188 | 76.325 | 38.75 |
| 2016-03-222:35:05 PM | 33.125 | 146.412 | 76.325 | 38.75 |
| 2016-03-222:35:12 PM | 33.125 | 146.75 | 76.438 | 38.75 |
| 2016-03-222:35:18 PM | 33.125 | 146.975 | 76.438 | 38.862 |
| 2016-03-222:35:24 PM | 33.125 | 147.2 | 76.438 | 38.75 |
| 2016-03-222:35:30 PM | 33.125 | 147.538 | 76.438 | 38.862 |
| 2016-03-222:35:37 PM | 33.238 | 147.763 | 76.438 | 38.975 |
| 2016-03-222:35:43 PM | 33.125 | 147.988 | 76.438 | 38.975 |
| 2016-03-222:35:49 PM | 33.125 | 148.212 | 76.438 | 38.862 |
| 2016-03-222:35:55 PM | 33.125 | 148.438 | 76.438 | 38.975 |
| 2016-03-222:36:02 PM | 33.125 | 148.662 | 76.438 | 38.975 |
| 2016-03-222:36:08 PM | 33.238 | 148.888 | 76.438 | 39.088 |
| 2016-03-222:36:14 PM | 33.125 | 149.112 | 76.438 | 38.975 |
| 2016-03-222:36:20 PM | 33.125 | 149.338 | 76.438 | 38.975 |
| 2016-03-222:36:26 PM | 33.125 | 149.45 | 76.55 | 38.975 |
| 2016-03-222:36:33 PM | 33.125 | 149.675 | 76.55 | 38.75 |
| 2016-03-222:36:39 PM | 33.125 | 149.9 | 76.55 | 38.638 |
| 2016-03-222:36:45 PM | 33.125 | 150.125 | 76.55 | 38.638 |
| 2016-03-222:36:51 PM | 33.125 | 150.238 | 76.55 | 38.638 |
| 2016-03-222:36:58 PM | 33.125 | 150.462 | 76.55 | 38.3 |
| 2016-03-222:37:04 PM | 33.125 | 150.575 | 76.55 | 37.962 |
| 2016-03-222:37:10 PM | 33.125 | 150.8 | 76.55 | 37.625 |
| 2016-03-222:37:16 PM | 33.125 | 150.912 | 76.55 | 37.738 |
| 2016-03-222:37:23 PM | 33.125 | 151.025 | 76.55 | 37.625 |
| 2016-03-222:37:29 PM | 33.125 | 151.138 | 76.55 | 37.512 |
| 2016-03-222:37:35 PM | 33.125 | 151.138 | 76.55 | 37.738 |
| 2016-03-222:37:41 PM | 33.125 | 151.025 | 76.55 | 37.738 |
| 2016-03-222:37:48 PM | 33.125 | 151.138 | 76.55 | 37.962 |
| 2016-03-222:37:54 PM | 33.125 | 151.138 | 76.55 | 38.188 |
| 2016-03-222:38:00 PM | 33.125 | 151.138 | 76.55 | 38.3 |
| 2016-03-222:38:06 PM | 33.012 | 151.138 | 76.55 | 38.412 |
| 2016-03-222:38:13 PM | 33.012 | 151.138 | 76.55 | 38.412 |
| 2016-03-222:38:19 PM | 33.012 | 151.138 | 76.55 | 38.638 |
| 2016-03-222:38:25 PM | 33.012 | 151.25 | 76.55 | 38.638 |
| 2016-03-222:38:31 PM | 33.012 | 151.25 | 76.55 | 38.638 |
| 2016-03-222:38:38 PM | 33.125 | 151.362 | 76.55 | 38.638 |
| 2016-03-222:38:44 PM | 33.012 | 151.362 | 76.55 | 38.412 |
| 2016-03-222:38:50 PM | 33.125 | 151.475 | 76.55 | 38.412 |
| 2016-03-222:38:56 PM | 33.125 | 151.475 | 76.55 | 38.525 |
| 2016-03-222:39:03 PM | 33.125 | 151.588 | 76.55 | 38.3 |
| 2016-03-222:39:09 PM | 33.125 | 151.588 | 76.55 | 38.3 |
| 2016-03-222:39:15 PM | 33.012 | 151.588 | 76.55 | 38.188 |
| 2016-03-222:39:21 PM | 33.012 | 151.7 | 76.55 | 38.188 |
| 2016-03-222:39:27 PM | 33.125 | 151.812 | 76.55 | 38.188 |
| 2016-03-222:39:34 PM | 33.012 | 151.812 | 76.55 | 38.3 |
| 2016-03-222:39:40 PM | 33.012 | 151.925 | 76.55 | 38.3 |
| 2016-03-222:39:46 PM | 33.012 | 151.925 | 76.55 | 38.412 |
| 2016-03-222:39:52 PM | 33.012 | 152.038 | 76.55 | 38.525 |
| 2016-03-222:39:59 PM | 33.012 | 152.038 | 76.55 | 38.412 |
| 2016-03-222:40:05 PM | 33.012 | 152.15 | 76.662 | 38.3 |
| 2016-03-222:40:11 PM | 33.012 | 152.15 | 76.55 | 38.3 |
| 2016-03-222:40:17 PM | 33.012 | 152.263 | 76.55 | 38.075 |
| 2016-03-222:40:24 PM | 33.125 | 152.263 | 76.662 | 37.962 |
| 2016-03-222:40:30 PM | 33.012 | 152.375 | 76.662 | 37.85 |
| 2016-03-222:40:36 PM | 33.125 | 152.488 | 76.662 | 37.85 |
| 2016-03-222:40:42 PM | 33.125 | 152.488 | 76.775 | 37.738 |
| 2016-03-222:40:49 PM | 33.125 | 152.488 | 76.662 | 38.075 |
| 2016-03-222:40:55 PM | 33.125 | 152.6 | 76.662 | 38.188 |
| 2016-03-222:41:01 PM | 33.125 | 152.712 | 76.775 | 37.85 |
| 2016-03-222:41:07 PM | 33.125 | 152.825 | 76.775 | 37.625 |
| 2016-03-222:41:13 PM | 33.125 | 152.938 | 76.662 | 37.4 |
| 2016-03-222:41:20 PM | 33.125 | 153.05 | 76.662 | 37.175 |
| 2016-03-222:41:26 PM | 33.125 | 153.162 | 76.662 | 37.062 |
| 2016-03-222:41:32 PM | 33.125 | 153.162 | 76.662 | 37.288 |
| 2016-03-222:41:38 PM | 33.125 | 153.275 | 76.775 | 37.4 |
| 2016-03-222:41:45 PM | 33.238 | 153.388 | 76.775 | 37.288 |
| 2016-03-222:41:51 PM | 33.238 | 153.5 | 76.775 | 36.838 |
| 2016-03-222:41:57 PM | 33.238 | 153.5 | 76.775 | 36.725 |
| 2016-03-222:42:03 PM | 33.238 | 153.612 | 76.775 | 36.612 |
| 2016-03-222:42:09 PM | 33.238 | 153.725 | 76.775 | 36.838 |
| 2016-03-222:42:16 PM | 33.238 | 153.725 | 76.775 | 37.062 |
| 2016-03-222:42:22 PM | 33.238 | 153.838 | 76.775 | 37.062 |
| 2016-03-222:42:28 PM | 33.238 | 153.95 | 76.775 | 36.95 |
| 2016-03-222:42:34 PM | 33.238 | 153.95 | 76.775 | 37.062 |
| 2016-03-222:42:41 PM | 33.238 | 154.062 | 76.775 | 37.175 |
| 2016-03-222:42:47 PM | 33.238 | 154.175 | 76.775 | 37.288 |
| 2016-03-222:42:53 PM | 33.238 | 154.175 | 76.775 | 37.4 |
| 2016-03-222:42:59 PM | 33.238 | 154.175 | 76.775 | 37.625 |
| 2016-03-222:43:06 PM | 33.238 | 154.175 | 76.775 | 37.738 |
| 2016-03-222:43:12 PM | 33.238 | 154.062 | 76.775 | 37.738 |
| 2016-03-222:43:18 PM | 33.238 | 153.95 | 76.775 | 37.85 |
| 2016-03-222:43:24 PM | 33.238 | 153.95 | 76.775 | 37.85 |
| 2016-03-222:43:31 PM | 33.238 | 153.838 | 76.888 | 37.962 |
| 2016-03-222:43:37 PM | 33.238 | 153.838 | 76.775 | 37.85 |
| 2016-03-222:43:43 PM | 33.238 | 153.838 | 76.775 | 37.962 |
| 2016-03-222:43:49 PM | 33.238 | 153.838 | 76.888 | 38.3 |
| 2016-03-222:43:55 PM | 33.238 | 153.838 | 76.888 | 38.525 |
| 2016-03-222:44:02 PM | 33.238 | 153.838 | 76.888 | 38.638 |
| 2016-03-222:44:08 PM | 33.238 | 153.838 | 76.888 | 38.75 |
| 2016-03-222:44:14 PM | 33.35 | 153.95 | 76.888 | 38.638 |
| 2016-03-222:44:20 PM | 33.35 | 154.062 | 76.888 | 38.638 |
| 2016-03-222:44:27 PM | 33.238 | 154.062 | 76.888 | 38.525 |
| 2016-03-222:44:33 PM | 33.238 | 154.175 | 76.888 | 38.525 |
| 2016-03-222:44:39 PM | 33.35 | 154.175 | 77 | 38.75 |
| 2016-03-222:44:45 PM | 33.35 | 154.288 | 76.888 | 38.975 |
| 2016-03-222:44:52 PM | 33.35 | 154.288 | 76.888 | 39.2 |
| 2016-03-222:44:58 PM | 33.35 | 154.4 | 76.888 | 39.2 |
| 2016-03-222:45:04 PM | 33.35 | 154.513 | 76.888 | 39.088 |
| 2016-03-222:45:10 PM | 33.462 | 154.513 | 77 | 39.425 |
| 2016-03-222:45:17 PM | 33.35 | 154.625 | 77 | 39.312 |
| 2016-03-222:45:23 PM | 33.35 | 154.738 | 77 | 39.088 |
| 2016-03-222:45:29 PM | 33.462 | 154.85 | 77 | 39.2 |
| 2016-03-222:45:35 PM | 33.462 | 154.962 | 77 | 39.2 |
| 2016-03-222:45:41 PM | 33.462 | 154.962 | 77 | 39.425 |
| 2016-03-222:45:48 PM | 33.462 | 155.075 | 77 | 39.538 |
| 2016-03-222:45:54 PM | 33.462 | 155.188 | 77.112 | 39.65 |
| 2016-03-222:46:00 PM | 33.462 | 155.3 | 77.112 | 39.762 |
| 2016-03-222:46:06 PM | 33.462 | 155.412 | 77.112 | 39.762 |
| 2016-03-222:46:12 PM | 33.462 | 155.412 | 77 | 39.762 |
| 2016-03-222:46:18 PM | 33.462 | 155.525 | 77 | 39.312 |
| 2016-03-222:46:25 PM | 33.35 | 155.638 | 77 | 39.2 |
| 2016-03-222:46:31 PM | 33.462 | 155.75 | 77 | 39.088 |
| 2016-03-222:46:37 PM | 33.462 | 155.75 | 77 | 38.975 |
| 2016-03-222:46:43 PM | 33.462 | 155.862 | 77 | 38.638 |
| 2016-03-222:46:50 PM | 33.462 | 155.975 | 77 | 38.412 |
| 2016-03-222:46:56 PM | 33.462 | 155.975 | 77 | 38.188 |
| 2016-03-222:47:02 PM | 33.462 | 155.975 | 77 | 37.962 |
| 2016-03-222:47:08 PM | 33.35 | 155.975 | 77 | 37.625 |
| 2016-03-222:47:15 PM | 33.462 | 156.088 | 77.112 | 37.4 |
| 2016-03-222:47:21 PM | 33.462 | 156.088 | 77.112 | 37.062 |
| 2016-03-222:47:27 PM | 33.462 | 155.975 | 77 | 36.838 |
| 2016-03-222:47:33 PM | 33.462 | 156.088 | 77 | 36.838 |
| 2016-03-222:47:40 PM | 33.35 | 155.975 | 77 | 36.725 |
| 2016-03-222:47:46 PM | 33.462 | 155.975 | 77 | 36.725 |
| 2016-03-222:47:52 PM | 33.35 | 155.975 | 76.888 | 36.612 |
| 2016-03-222:47:58 PM | 33.462 | 155.862 | 76.888 | 36.612 |
| 2016-03-222:48:05 PM | 33.35 | 155.638 | 77 | 36.612 |
| 2016-03-222:48:11 PM | 33.35 | 155.638 | 76.888 | 36.612 |
| 2016-03-222:48:17 PM | 33.35 | 155.525 | 76.888 | 36.612 |
| 2016-03-222:48:23 PM | 33.35 | 155.525 | 76.888 | 36.725 |
| 2016-03-222:48:30 PM | 33.35 | 155.412 | 76.888 | 36.612 |
| 2016-03-222:48:36 PM | 33.35 | 155.3 | 77 | 36.612 |
| 2016-03-222:48:42 PM | 33.35 | 155.188 | 77 | 36.612 |
| 2016-03-222:48:48 PM | 33.35 | 155.075 | 77 | 36.95 |
| 2016-03-222:48:55 PM | 33.35 | 154.962 | 77 | 37.175 |
| 2016-03-222:49:01 PM | 33.35 | 154.85 | 77 | 37.175 |
| 2016-03-222:49:07 PM | 33.35 | 154.738 | 77 | 37.062 |
| 2016-03-222:49:13 PM | 33.35 | 154.625 | 77 | 36.838 |
| 2016-03-222:49:20 PM | 33.35 | 154.513 | 77 | 37.062 |
| 2016-03-222:49:26 PM | 33.35 | 154.4 | 77 | 37.175 |
| 2016-03-222:49:32 PM | 33.35 | 154.4 | 77 | 37.062 |
| 2016-03-222:49:38 PM | 33.35 | 154.288 | 77 | 37.288 |
| 2016-03-222:49:45 PM | 33.35 | 154.175 | 77 | 37.512 |
| 2016-03-222:49:51 PM | 33.35 | 154.062 | 77 | 37.625 |
| 2016-03-222:49:57 PM | 33.35 | 154.062 | 77.112 | 37.625 |
| 2016-03-222:50:03 PM | 33.35 | 153.95 | 77 | 37.738 |
| 2016-03-222:50:09 PM | 33.35 | 153.95 | 77 | 37.738 |
| 2016-03-222:50:16 PM | 33.35 | 153.95 | 77 | 37.962 |
| 2016-03-222:50:22 PM | 33.35 | 153.95 | 77 | 38.188 |
| 2016-03-222:50:28 PM | 33.462 | 153.95 | 77.112 | 38.412 |
| 2016-03-222:50:34 PM | 33.462 | 153.838 | 77.112 | 38.525 |
| 2016-03-222:50:41 PM | 33.462 | 153.838 | 77.112 | 38.638 |
| 2016-03-222:50:47 PM | 33.462 | 153.838 | 77.112 | 38.525 |
| 2016-03-222:50:53 PM | 33.462 | 153.838 | 77.225 | 38.638 |
| 2016-03-222:50:59 PM | 33.462 | 153.95 | 77.225 | 38.525 |
| 2016-03-222:51:06 PM | 33.462 | 153.95 | 77.225 | 38.525 |
| 2016-03-222:51:12 PM | 33.462 | 154.062 | 77.225 | 38.75 |
| 2016-03-222:51:18 PM | 33.462 | 154.062 | 77.112 | 38.525 |
| 2016-03-222:51:24 PM | 33.462 | 154.175 | 77.112 | 38.525 |
| 2016-03-222:51:30 PM | 33.462 | 154.175 | 77.112 | 38.525 |
| 2016-03-222:51:37 PM | 33.575 | 154.175 | 77.112 | 38.525 |
| 2016-03-222:51:43 PM | 33.575 | 154.288 | 77.112 | 38.3 |
| 2016-03-222:51:49 PM | 33.575 | 154.288 | 77 | 38.3 |
| 2016-03-222:51:55 PM | 33.575 | 154.288 | 77 | 38.188 |
| 2016-03-222:52:02 PM | 33.575 | 154.288 | 77 | 38.3 |
| 2016-03-222:52:14 PM | 33.575 | 154.4 | 77 | 38.3 |
| 2016-03-222:52:20 PM | 33.575 | 154.4 | 77 | 38.3 |
| 2016-03-222:52:26 PM | 33.575 | 154.4 | 77 | 38.075 |
| 2016-03-222:52:32 PM | 33.462 | 154.513 | 77 | 37.512 |
| 2016-03-222:52:39 PM | 33.462 | 154.513 | 77 | 37.062 |
| 2016-03-222:52:45 PM | 33.462 | 154.513 | 77 | 36.838 |
| 2016-03-222:52:51 PM | 33.462 | 154.513 | 77 | 36.725 |
| 2016-03-222:52:57 PM | 33.462 | 154.625 | 77 | 36.5 |
| 2016-03-222:53:04 PM | 33.462 | 154.4 | 76.888 | 36.612 |
| 2016-03-222:53:10 PM | 33.462 | 154.175 | 77 | 36.725 |
| 2016-03-222:53:16 PM | 33.462 | 153.838 | 76.888 | 36.725 |
| 2016-03-222:53:22 PM | 33.462 | 153.275 | 76.888 | 36.612 |
| 2016-03-222:53:28 PM | 33.462 | 152.825 | 76.888 | 36.612 |
| 2016-03-222:53:35 PM | 33.462 | 152.488 | 76.888 | 36.725 |
| 2016-03-222:53:41 PM | 33.462 | 152.263 | 76.888 | 36.838 |
| 2016-03-222:53:47 PM | 33.462 | 152.15 | 76.888 | 37.062 |
| 2016-03-222:53:53 PM | 33.462 | 151.925 | 76.888 | 37.175 |
| 2016-03-222:54:00 PM | 33.462 | 151.812 | 76.888 | 37.288 |
| 2016-03-222:54:06 PM | 33.462 | 151.7 | 76.888 | 37.4 |
| 2016-03-222:54:12 PM | 33.462 | 151.588 | 76.888 | 37.512 |
| 2016-03-222:54:18 PM | 33.462 | 151.475 | 76.888 | 37.512 |
| 2016-03-222:54:25 PM | 33.462 | 151.475 | 76.888 | 37.962 |
| 2016-03-222:54:31 PM | 33.462 | 151.475 | 76.888 | 38.3 |
| 2016-03-222:54:37 PM | 33.462 | 151.475 | 76.888 | 38.525 |
| 2016-03-222:54:43 PM | 33.462 | 151.475 | 76.888 | 38.638 |
| 2016-03-222:54:50 PM | 33.462 | 151.475 | 76.888 | 38.975 |
| 2016-03-222:54:56 PM | 33.462 | 151.475 | 76.888 | 39.2 |
| 2016-03-222:55:02 PM | 33.462 | 151.588 | 76.888 | 39.425 |
| 2016-03-222:55:08 PM | 33.575 | 151.7 | 77 | 39.538 |
| 2016-03-222:55:14 PM | 33.575 | 151.812 | 77 | 39.65 |
| 2016-03-222:55:21 PM | 33.575 | 151.925 | 77 | 39.988 |
| 2016-03-222:55:27 PM | 33.575 | 151.925 | 77 | 40.1 |
| 2016-03-222:55:33 PM | 33.575 | 152.038 | 77 | 40.325 |
| 2016-03-222:55:39 PM | 33.575 | 152.263 | 77 | 40.55 |
| 2016-03-222:55:46 PM | 33.575 | 152.375 | 77 | 40.662 |
| 2016-03-222:55:52 PM | 33.575 | 152.488 | 77 | 41 |
| 2016-03-222:55:58 PM | 33.688 | 152.6 | 77 | 41.225 |
| 2016-03-222:56:04 PM | 33.688 | 152.712 | 77 | 41.225 |
| 2016-03-222:56:10 PM | 33.688 | 152.938 | 77 | 41.225 |
| 2016-03-222:56:17 PM | 33.688 | 152.938 | 77 | 41.338 |
| 2016-03-222:56:23 PM | 33.688 | 153.162 | 77 | 41.225 |
| 2016-03-222:56:29 PM | 33.688 | 153.388 | 77.112 | 41.112 |
| 2016-03-222:56:35 PM | 33.688 | 153.5 | 77.112 | 40.775 |
| 2016-03-222:56:42 PM | 33.688 | 153.5 | 77.112 | 40.55 |
| 2016-03-222:56:48 PM | 33.688 | 153.725 | 77.112 | 40.438 |
| 2016-03-222:56:54 PM | 33.688 | 153.838 | 77.112 | 40.212 |
| 2016-03-222:57:00 PM | 33.688 | 153.95 | 77.112 | 40.212 |
| 2016-03-222:57:07 PM | 33.688 | 154.062 | 77.112 | 40.1 |
| 2016-03-222:57:13 PM | 33.688 | 154.175 | 77.112 | 39.988 |
| 2016-03-222:57:19 PM | 33.688 | 154.175 | 77 | 39.988 |
| 2016-03-222:57:25 PM | 33.688 | 154.288 | 77.112 | 40.1 |
| 2016-03-222:57:32 PM | 33.688 | 154.288 | 77.112 | 40.212 |
| 2016-03-222:57:38 PM | 33.688 | 154.4 | 77.112 | 40.1 |
| 2016-03-222:57:44 PM | 33.688 | 154.4 | 77.112 | 40.1 |
| 2016-03-222:57:50 PM | 33.688 | 154.4 | 77.112 | 40.1 |
| 2016-03-222:57:56 PM | 33.688 | 154.4 | 77.112 | 40.212 |
| 2016-03-222:58:03 PM | 33.688 | 154.513 | 77.112 | 40.212 |
| 2016-03-222:58:09 PM | 33.688 | 154.513 | 77.112 | 39.988 |
| 2016-03-222:58:15 PM | 33.688 | 154.4 | 77.112 | 39.875 |
| 2016-03-222:58:21 PM | 33.688 | 154.288 | 77.112 | 39.875 |
| 2016-03-222:58:28 PM | 33.688 | 154.288 | 77.112 | 39.988 |
| 2016-03-222:58:34 PM | 33.688 | 154.288 | 77.112 | 40.1 |
| 2016-03-222:58:40 PM | 33.688 | 154.288 | 77.112 | 40.438 |
| 2016-03-222:58:46 PM | 33.688 | 154.288 | 77.225 | 40.55 |
| 2016-03-222:58:53 PM | 33.688 | 154.175 | 77.225 | 40.662 |
| 2016-03-222:58:59 PM | 33.688 | 154.175 | 77.225 | 40.662 |
| 2016-03-222:59:05 PM | 33.688 | 154.062 | 77.112 | 40.888 |
| 2016-03-222:59:11 PM | 33.688 | 154.062 | 77.112 | 40.775 |
| 2016-03-222:59:18 PM | 33.688 | 153.95 | 77.112 | 40.775 |
| 2016-03-222:59:24 PM | 33.8 | 153.95 | 77.112 | 40.888 |
| 2016-03-222:59:30 PM | 33.8 | 153.95 | 77.112 | 41 |
| 2016-03-222:59:36 PM | 33.8 | 153.95 | 77.112 | 41 |
| 2016-03-222:59:42 PM | 33.8 | 154.062 | 77.112 | 41 |
| 2016-03-222:59:49 PM | 33.8 | 154.062 | 77.112 | 41 |
| 2016-03-222:59:55 PM | 33.912 | 154.175 | 77.112 | 41 |
| 2016-03-223:00:01 PM | 33.8 | 154.288 | 77.112 | 41.112 |
| 2016-03-223:00:07 PM | 33.912 | 154.4 | 77.112 | 41.112 |
| 2016-03-223:00:14 PM | 33.912 | 154.513 | 77.112 | 41.112 |
| 2016-03-223:00:20 PM | 33.912 | 154.625 | 77.112 | 41.225 |
| 2016-03-223:00:26 PM | 33.8 | 154.625 | 77.112 | 41.225 |
| 2016-03-223:00:32 PM | 33.8 | 154.738 | 77.112 | 41 |
| 2016-03-223:00:39 PM | 33.8 | 154.85 | 77.225 | 41.112 |
| 2016-03-223:00:45 PM | 33.912 | 154.962 | 77.225 | 41.112 |
| 2016-03-223:00:51 PM | 33.912 | 155.075 | 77.225 | 40.888 |
| 2016-03-223:00:57 PM | 33.912 | 155.188 | 77.112 | 40.662 |
| 2016-03-223:01:04 PM | 33.912 | 155.188 | 77.225 | 40.325 |
| 2016-03-223:01:10 PM | 33.912 | 155.188 | 77.225 | 39.988 |
| 2016-03-223:01:16 PM | 33.912 | 155.188 | 77.225 | 39.875 |
| 2016-03-223:01:22 PM | 33.912 | 155.3 | 77.112 | 39.875 |
| 2016-03-223:01:28 PM | 33.912 | 155.3 | 77.112 | 39.538 |
| 2016-03-223:01:35 PM | 33.912 | 155.412 | 77.112 | 39.425 |
| 2016-03-223:01:41 PM | 33.912 | 155.525 | 77.112 | 39.65 |
| 2016-03-223:01:47 PM | 33.912 | 155.638 | 77.225 | 39.762 |
| 2016-03-223:01:53 PM | 33.912 | 155.638 | 77.112 | 39.762 |
| 2016-03-223:02:00 PM | 33.912 | 155.75 | 77.112 | 39.875 |
| 2016-03-223:02:06 PM | 33.912 | 155.75 | 77.112 | 39.65 |
| 2016-03-223:02:12 PM | 33.912 | 155.862 | 77.112 | 39.425 |
| 2016-03-223:02:18 PM | 33.912 | 155.862 | 77.112 | 39.538 |
| 2016-03-223:02:25 PM | 33.912 | 155.975 | 77.112 | 39.538 |
| 2016-03-223:02:31 PM | 33.912 | 156.088 | 77.112 | 39.65 |
| 2016-03-223:02:37 PM | 33.912 | 156.088 | 77.225 | 39.762 |
| 2016-03-223:02:43 PM | 33.912 | 156.2 | 77.225 | 39.875 |
| 2016-03-223:02:49 PM | 33.912 | 156.312 | 77.225 | 40.1 |
| 2016-03-223:02:56 PM | 33.912 | 156.312 | 77.225 | 40.212 |
| 2016-03-223:03:02 PM | 33.912 | 156.425 | 77.225 | 40.212 |
| 2016-03-223:03:08 PM | 33.912 | 156.425 | 77.225 | 40.1 |
| 2016-03-223:03:14 PM | 34.025 | 156.538 | 77.225 | 39.875 |
| 2016-03-223:03:21 PM | 33.912 | 156.538 | 77.225 | 39.65 |
| 2016-03-223:03:27 PM | 33.912 | 156.538 | 77.225 | 39.2 |
| 2016-03-223:03:33 PM | 33.912 | 156.65 | 77.225 | 39.088 |
| 2016-03-223:03:39 PM | 33.8 | 156.65 | 77.225 | 38.862 |
| 2016-03-223:03:46 PM | 33.8 | 156.65 | 77.225 | 38.525 |
| 2016-03-223:03:52 PM | 33.912 | 156.65 | 77.225 | 38.525 |
| 2016-03-223:03:58 PM | 33.8 | 156.65 | 77.112 | 38.412 |
| 2016-03-223:04:04 PM | 33.912 | 156.65 | 77.112 | 38.3 |
| 2016-03-223:04:11 PM | 33.8 | 156.65 | 77.112 | 38.188 |
| 2016-03-223:04:17 PM | 33.8 | 156.538 | 77.112 | 37.85 |
| 2016-03-223:04:23 PM | 33.8 | 156.538 | 77.112 | 37.85 |
| 2016-03-223:04:29 PM | 33.8 | 156.538 | 77.112 | 37.962 |
| 2016-03-223:04:36 PM | 33.8 | 156.425 | 77.112 | 38.3 |
| 2016-03-223:04:42 PM | 33.8 | 156.425 | 77.112 | 38.412 |
| 2016-03-223:04:48 PM | 33.8 | 156.425 | 77.112 | 38.525 |
| 2016-03-223:04:54 PM | 33.8 | 156.312 | 77.112 | 38.525 |
| 2016-03-223:05:00 PM | 33.8 | 156.2 | 77.112 | 38.638 |
| 2016-03-223:05:07 PM | 33.8 | 156.2 | 77.112 | 38.638 |
| 2016-03-223:05:13 PM | 33.8 | 156.088 | 77.112 | 38.638 |
| 2016-03-223:05:19 PM | 33.8 | 155.975 | 77.112 | 38.75 |
| 2016-03-223:05:25 PM | 33.688 | 155.975 | 77.112 | 38.862 |
| 2016-03-223:05:32 PM | 33.8 | 155.862 | 77.112 | 38.75 |
| 2016-03-223:05:38 PM | 33.688 | 155.75 | 77.112 | 38.525 |
| 2016-03-223:05:44 PM | 33.8 | 155.75 | 77.225 | 38.412 |
| 2016-03-223:05:55 PM | 33.8 | 155.638 | 77.112 | 38.188 |
| 2016-03-223:06:02 PM | 33.688 | 155.638 | 77.225 | 37.962 |
| 2016-03-223:06:08 PM | 33.8 | 155.525 | 77.112 | 37.962 |
| 2016-03-223:06:14 PM | 33.688 | 155.412 | 77.112 | 37.962 |
| 2016-03-223:06:20 PM | 33.688 | 155.412 | 77.112 | 38.075 |
| 2016-03-223:06:27 PM | 33.688 | 155.412 | 77.112 | 37.962 |
| 2016-03-223:06:33 PM | 33.688 | 155.3 | 77.112 | 37.962 |
| 2016-03-223:06:39 PM | 33.688 | 155.3 | 77.112 | 37.85 |
| 2016-03-223:06:45 PM | 33.688 | 155.3 | 77.112 | 37.85 |
| 2016-03-223:06:51 PM | 33.688 | 155.188 | 77.112 | 37.85 |
| 2016-03-223:06:58 PM | 33.688 | 155.188 | 77.112 | 37.85 |
| 2016-03-223:07:04 PM | 33.688 | 155.075 | 77.112 | 37.738 |
| 2016-03-223:07:10 PM | 33.688 | 154.962 | 77.112 | 37.625 |
| 2016-03-223:07:16 PM | 33.688 | 154.962 | 77.112 | 37.625 |
| 2016-03-223:07:23 PM | 33.688 | 154.85 | 77.112 | 37.738 |
| 2016-03-223:07:29 PM | 33.688 | 154.738 | 77.112 | 37.625 |
| 2016-03-223:07:35 PM | 33.688 | 154.625 | 77.112 | 37.512 |
| 2016-03-223:07:41 PM | 33.688 | 154.625 | 77.225 | 37.512 |
| 2016-03-223:07:48 PM | 33.688 | 154.513 | 77.112 | 37.4 |
| 2016-03-223:07:54 PM | 33.688 | 154.4 | 77.112 | 37.625 |
| 2016-03-223:08:00 PM | 33.688 | 154.4 | 77.225 | 37.625 |
| 2016-03-223:08:06 PM | 33.688 | 154.288 | 77.225 | 37.4 |
| 2016-03-223:08:13 PM | 33.688 | 154.175 | 77.225 | 37.288 |
| 2016-03-223:08:19 PM | 33.688 | 154.175 | 77.112 | 37.512 |
| 2016-03-223:08:25 PM | 33.688 | 154.062 | 77.112 | 37.512 |
| 2016-03-223:08:31 PM | 33.688 | 153.95 | 77.112 | 37.625 |
| 2016-03-223:08:38 PM | 33.688 | 153.95 | 77.112 | 37.625 |
| 2016-03-223:08:44 PM | 33.688 | 153.838 | 77.112 | 37.625 |
| 2016-03-223:08:50 PM | 33.688 | 153.725 | 77.112 | 37.512 |
| 2016-03-223:08:56 PM | 33.688 | 153.612 | 77 | 37.4 |
| 2016-03-223:09:02 PM | 33.688 | 153.612 | 77.112 | 37.4 |
| 2016-03-223:09:09 PM | 33.688 | 153.5 | 77 | 37.4 |
| 2016-03-223:09:15 PM | 33.688 | 153.388 | 77.112 | 37.4 |
| 2016-03-223:09:21 PM | 33.688 | 153.388 | 77.112 | 37.288 |
| 2016-03-223:09:27 PM | 33.688 | 153.275 | 77.112 | 37.512 |
| 2016-03-223:09:34 PM | 33.688 | 153.162 | 77.112 | 37.738 |
| 2016-03-223:09:40 PM | 33.688 | 153.162 | 77.112 | 37.85 |
| 2016-03-223:09:46 PM | 33.688 | 153.162 | 77.112 | 37.962 |
| 2016-03-223:09:52 PM | 33.688 | 153.05 | 77.112 | 38.075 |
| 2016-03-223:09:59 PM | 33.688 | 152.938 | 77.112 | 38.188 |
| 2016-03-223:10:11 PM | 33.688 | 152.825 | 77.112 | 38.3 |
| 2016-03-223:10:17 PM | 33.688 | 152.825 | 77.112 | 38.412 |
| 2016-03-223:10:23 PM | 33.688 | 152.712 | 77.112 | 38.525 |
| 2016-03-223:10:30 PM | 33.688 | 152.712 | 77.112 | 38.412 |
| 2016-03-223:10:36 PM | 33.688 | 152.6 | 77.112 | 38.075 |
| 2016-03-223:10:42 PM | 33.688 | 152.6 | 77.112 | 38.075 |
| 2016-03-223:10:48 PM | 33.688 | 152.6 | 77.112 | 38.075 |
| 2016-03-223:10:54 PM | 33.688 | 152.488 | 77.112 | 37.962 |
| 2016-03-223:11:01 PM | 33.688 | 152.375 | 77 | 37.962 |
| 2016-03-223:11:07 PM | 33.8 | 152.375 | 77 | 38.188 |
| 2016-03-223:11:13 PM | 33.688 | 152.263 | 77 | 38.3 |
| 2016-03-223:11:19 PM | 33.688 | 152.263 | 77 | 38.3 |
| 2016-03-223:11:26 PM | 33.8 | 152.263 | 77 | 38.412 |
| 2016-03-223:11:32 PM | 33.688 | 152.263 | 77 | 38.525 |
| 2016-03-223:11:38 PM | 33.8 | 152.15 | 77 | 38.412 |
| 2016-03-223:11:44 PM | 33.688 | 152.15 | 77 | 38.3 |
| 2016-03-223:11:50 PM | 33.688 | 152.15 | 77 | 38.412 |
| 2016-03-223:11:57 PM | 33.688 | 152.15 | 77 | 38.525 |
| 2016-03-223:12:03 PM | 33.8 | 152.038 | 77 | 38.525 |
| 2016-03-223:12:09 PM | 33.688 | 152.038 | 77 | 38.525 |
| 2016-03-223:12:15 PM | 33.688 | 151.925 | 77 | 38.412 |
| 2016-03-223:12:21 PM | 33.8 | 151.925 | 77 | 38.188 |
| 2016-03-223:12:27 PM | 33.8 | 151.925 | 77.112 | 37.962 |
| 2016-03-223:12:33 PM | 33.8 | 151.812 | 77 | 37.962 |
| 2016-03-223:12:39 PM | 33.688 | 151.812 | 77 | 37.85 |
| 2016-03-223:12:46 PM | 33.8 | 151.812 | 77 | 37.85 |
| 2016-03-223:12:52 PM | 33.8 | 151.812 | 77 | 37.738 |
| 2016-03-223:12:58 PM | 33.8 | 151.812 | 77 | 37.85 |
| 2016-03-223:13:04 PM | 33.8 | 151.7 | 77.112 | 37.738 |
| 2016-03-223:13:11 PM | 33.688 | 151.588 | 77.112 | 37.625 |
| 2016-03-223:13:17 PM | 33.688 | 151.475 | 77.112 | 37.4 |
| 2016-03-223:13:23 PM | 33.688 | 151.362 | 77 | 37.288 |
| 2016-03-223:13:29 PM | 33.688 | 151.362 | 77 | 37.175 |
| 2016-03-223:13:36 PM | 33.688 | 151.362 | 77 | 36.95 |
| 2016-03-223:13:42 PM | 33.688 | 151.25 | 77 | 37.062 |
| 2016-03-223:13:48 PM | 33.688 | 151.138 | 77 | 36.95 |
| 2016-03-223:13:54 PM | 33.688 | 151.025 | 77 | 36.725 |
| 2016-03-223:14:01 PM | 33.688 | 150.912 | 77 | 36.725 |
| 2016-03-223:14:07 PM | 33.688 | 150.688 | 77.112 | 36.725 |
| 2016-03-223:14:13 PM | 33.688 | 150.688 | 77.112 | 36.725 |
| 2016-03-223:14:19 PM | 33.688 | 150.575 | 77.112 | 36.725 |
| 2016-03-223:14:26 PM | 33.575 | 150.35 | 77.225 | 36.725 |
| 2016-03-223:14:32 PM | 33.688 | 150.35 | 77.225 | 36.612 |
| 2016-03-223:14:38 PM | 33.575 | 150.125 | 77.225 | 36.612 |
| 2016-03-223:14:44 PM | 33.575 | 149.9 | 77.112 | 36.725 |
| 2016-03-223:14:51 PM | 33.688 | 149.675 | 77.112 | 36.95 |
| 2016-03-223:14:57 PM | 33.575 | 149.562 | 77.112 | 36.838 |
| 2016-03-223:15:03 PM | 33.575 | 149.45 | 77.112 | 36.612 |
| 2016-03-223:15:09 PM | 33.575 | 149.338 | 77.112 | 36.612 |
| 2016-03-223:15:16 PM | 33.575 | 149.112 | 77.112 | 36.838 |
| 2016-03-223:15:22 PM | 33.575 | 149 | 77.112 | 36.95 |
| 2016-03-223:15:28 PM | 33.688 | 148.775 | 77.112 | 36.95 |
| 2016-03-223:15:34 PM | 33.575 | 148.775 | 77.112 | 37.062 |
| 2016-03-223:15:41 PM | 33.575 | 148.662 | 77 | 37.062 |
| 2016-03-223:15:47 PM | 33.575 | 148.55 | 77 | 37.288 |
| 2016-03-223:15:53 PM | 33.575 | 148.438 | 77 | 37.512 |
| 2016-03-223:15:59 PM | 33.575 | 148.325 | 77 | 37.85 |
| 2016-03-223:16:06 PM | 33.688 | 148.1 | 77 | 38.075 |
| 2016-03-223:16:12 PM | 33.688 | 148.1 | 77 | 37.962 |
| 2016-03-223:16:18 PM | 33.575 | 147.988 | 77 | 37.962 |
| 2016-03-223:16:24 PM | 33.575 | 147.875 | 77 | 37.738 |
| 2016-03-223:16:30 PM | 33.575 | 147.875 | 77 | 37.512 |
| 2016-03-223:16:37 PM | 33.575 | 147.763 | 76.888 | 37.4 |
| 2016-03-223:16:43 PM | 33.575 | 147.65 | 76.888 | 37.175 |
| 2016-03-223:16:49 PM | 33.575 | 147.65 | 76.888 | 37.175 |
| 2016-03-223:16:55 PM | 33.575 | 147.65 | 76.888 | 37.062 |
| 2016-03-223:17:02 PM | 33.575 | 147.538 | 76.888 | 37.062 |
| 2016-03-223:17:08 PM | 33.575 | 147.538 | 76.888 | 37.175 |
| 2016-03-223:17:14 PM | 33.575 | 147.425 | 76.888 | 37.175 |
| 2016-03-223:17:20 PM | 33.688 | 147.425 | 76.888 | 37.4 |
| 2016-03-223:17:27 PM | 33.575 | 147.425 | 76.888 | 37.512 |
| 2016-03-223:17:33 PM | 33.688 | 147.312 | 76.888 | 37.512 |
| 2016-03-223:17:39 PM | 33.688 | 147.312 | 76.888 | 37.738 |
| 2016-03-223:17:45 PM | 33.575 | 147.2 | 76.888 | 37.738 |
| 2016-03-223:17:52 PM | 33.688 | 147.2 | 76.775 | 37.625 |
| 2016-03-223:17:58 PM | 33.688 | 147.088 | 76.775 | 37.625 |
| 2016-03-223:18:04 PM | 33.688 | 146.975 | 76.775 | 37.738 |
| 2016-03-223:18:10 PM | 33.688 | 146.975 | 76.775 | 37.85 |
| 2016-03-223:18:16 PM | 33.688 | 146.862 | 76.775 | 37.962 |
| 2016-03-223:18:23 PM | 33.688 | 146.862 | 76.775 | 38.075 |
| 2016-03-223:18:29 PM | 33.688 | 146.75 | 76.775 | 38.3 |
| 2016-03-223:18:35 PM | 33.688 | 146.75 | 76.775 | 38.3 |
| 2016-03-223:18:41 PM | 33.688 | 146.638 | 76.775 | 38.075 |
| 2016-03-223:18:48 PM | 33.688 | 146.638 | 76.775 | 38.075 |
| 2016-03-223:18:54 PM | 33.688 | 146.525 | 76.775 | 37.962 |
| 2016-03-223:19:00 PM | 33.688 | 146.525 | 76.775 | 37.625 |
| 2016-03-223:19:06 PM | 33.688 | 146.412 | 76.775 | 37.512 |
| 2016-03-223:19:13 PM | 33.688 | 146.412 | 76.775 | 37.625 |
| 2016-03-223:19:19 PM | 33.688 | 146.3 | 76.775 | 37.625 |
| 2016-03-223:19:25 PM | 33.688 | 146.3 | 76.662 | 37.625 |
| 2016-03-223:19:31 PM | 33.688 | 146.3 | 76.775 | 37.738 |
| 2016-03-223:19:38 PM | 33.688 | 146.188 | 76.662 | 37.85 |
| 2016-03-223:19:44 PM | 33.688 | 146.188 | 76.662 | 37.738 |
| 2016-03-223:19:50 PM | 33.688 | 146.188 | 76.662 | 37.962 |
| 2016-03-223:19:56 PM | 33.688 | 146.188 | 76.662 | 38.075 |
| 2016-03-223:20:02 PM | 33.688 | 146.188 | 76.662 | 38.075 |
| 2016-03-223:20:09 PM | 33.688 | 146.075 | 76.662 | 37.738 |
| 2016-03-223:20:15 PM | 33.688 | 146.075 | 76.662 | 37.625 |
| 2016-03-223:20:21 PM | 33.688 | 146.075 | 76.662 | 37.625 |
| 2016-03-223:20:27 PM | 33.575 | 146.075 | 76.662 | 37.4 |
| 2016-03-223:20:33 PM | 33.688 | 146.075 | 76.662 | 37.062 |
| 2016-03-223:20:40 PM | 33.688 | 146.075 | 76.55 | 36.95 |
| 2016-03-223:20:46 PM | 33.688 | 146.075 | 76.55 | 37.062 |
| 2016-03-223:20:52 PM | 33.688 | 146.075 | 76.662 | 36.95 |
| 2016-03-223:20:58 PM | 33.688 | 145.962 | 76.662 | 36.95 |
| 2016-03-223:21:05 PM | 33.575 | 145.962 | 76.662 | 37.062 |
| 2016-03-223:21:11 PM | 33.688 | 145.962 | 76.662 | 37.288 |
| 2016-03-223:21:17 PM | 33.688 | 145.962 | 76.662 | 37.175 |
| 2016-03-223:21:23 PM | 33.688 | 145.962 | 76.662 | 37.062 |
| 2016-03-223:21:29 PM | 33.688 | 145.85 | 76.662 | 36.95 |
| 2016-03-223:21:36 PM | 33.688 | 145.85 | 76.775 | 37.062 |
| 2016-03-223:21:42 PM | 33.688 | 145.738 | 76.775 | 37.062 |
| 2016-03-223:21:48 PM | 33.688 | 145.625 | 76.775 | 36.725 |
| 2016-03-223:21:54 PM | 33.688 | 145.625 | 76.775 | 36.612 |
| 2016-03-223:22:00 PM | 33.688 | 145.625 | 76.775 | 36.388 |
| 2016-03-223:22:07 PM | 33.688 | 145.512 | 76.775 | 36.388 |
| 2016-03-223:22:13 PM | 33.688 | 145.512 | 76.775 | 36.5 |
| 2016-03-223:22:19 PM | 33.688 | 145.4 | 76.662 | 36.612 |
| 2016-03-223:22:25 PM | 33.688 | 145.4 | 76.662 | 36.725 |
| 2016-03-223:22:32 PM | 33.688 | 145.288 | 76.662 | 36.838 |
| 2016-03-223:22:38 PM | 33.688 | 145.175 | 76.662 | 36.725 |
| 2016-03-223:22:44 PM | 33.688 | 145.175 | 76.662 | 36.838 |
| 2016-03-223:22:50 PM | 33.688 | 145.062 | 76.662 | 36.95 |
| 2016-03-223:22:56 PM | 33.688 | 145.062 | 76.662 | 36.838 |
| 2016-03-223:23:03 PM | 33.688 | 144.95 | 76.662 | 36.838 |
| 2016-03-223:23:09 PM | 33.688 | 144.95 | 76.662 | 36.838 |
| 2016-03-223:23:15 PM | 33.688 | 144.838 | 76.662 | 36.838 |
| 2016-03-223:23:21 PM | 33.688 | 144.838 | 76.662 | 36.95 |
| 2016-03-223:23:27 PM | 33.688 | 144.725 | 76.662 | 37.175 |
| 2016-03-223:23:34 PM | 33.688 | 144.612 | 76.662 | 37.288 |
| 2016-03-223:23:40 PM | 33.8 | 144.612 | 76.775 | 37.288 |
| 2016-03-223:23:46 PM | 33.8 | 144.5 | 76.775 | 37.288 |
| 2016-03-223:23:52 PM | 33.688 | 144.5 | 76.775 | 37.4 |
| 2016-03-223:23:58 PM | 33.688 | 144.388 | 76.775 | 37.512 |
| 2016-03-223:24:05 PM | 33.688 | 144.388 | 76.775 | 37.512 |
| 2016-03-223:24:11 PM | 33.688 | 144.275 | 76.775 | 37.288 |
| 2016-03-223:24:17 PM | 33.688 | 144.275 | 76.888 | 37.062 |
| 2016-03-223:24:23 PM | 33.688 | 144.162 | 76.888 | 37.062 |
| 2016-03-223:24:29 PM | 33.8 | 144.162 | 76.888 | 37.288 |
| 2016-03-223:24:36 PM | 33.8 | 144.05 | 76.888 | 37.288 |
| 2016-03-223:24:42 PM | 33.688 | 144.05 | 76.888 | 37.288 |
| 2016-03-223:24:48 PM | 33.688 | 144.05 | 76.888 | 37.288 |
| 2016-03-223:24:54 PM | 33.8 | 143.938 | 76.888 | 37.288 |
| 2016-03-223:25:01 PM | 33.8 | 143.938 | 76.888 | 37.175 |
| 2016-03-223:25:07 PM | 33.688 | 143.938 | 76.888 | 36.95 |
| 2016-03-223:25:13 PM | 33.8 | 143.938 | 76.888 | 36.838 |
| 2016-03-223:25:19 PM | 33.8 | 143.938 | 76.888 | 36.95 |
| 2016-03-223:25:25 PM | 33.688 | 143.938 | 76.888 | 36.838 |
| 2016-03-223:25:32 PM | 33.8 | 143.938 | 76.888 | 36.725 |
| 2016-03-223:25:38 PM | 33.688 | 143.825 | 76.888 | 36.725 |
| 2016-03-223:25:44 PM | 33.8 | 143.825 | 76.888 | 36.725 |
| 2016-03-223:25:50 PM | 33.688 | 143.825 | 76.888 | 36.612 |
| 2016-03-223:25:56 PM | 33.688 | 143.825 | 77 | 36.612 |
| 2016-03-223:26:03 PM | 33.8 | 143.825 | 77 | 36.388 |
| 2016-03-223:26:09 PM | 33.8 | 143.825 | 77 | 36.275 |
| 2016-03-223:26:15 PM | 33.8 | 143.712 | 76.888 | 36.275 |
| 2016-03-223:26:21 PM | 33.688 | 143.6 | 76.888 | 36.275 |
| 2016-03-223:26:27 PM | 33.688 | 143.712 | 76.888 | 36.275 |
| 2016-03-223:26:34 PM | 33.688 | 143.6 | 76.888 | 36.5 |
| 2016-03-223:26:40 PM | 33.688 | 143.6 | 77 | 36.388 |
| 2016-03-223:26:46 PM | 33.8 | 143.6 | 76.888 | 36.5 |
| 2016-03-223:26:52 PM | 33.8 | 143.488 | 76.888 | 36.5 |
| 2016-03-223:26:59 PM | 33.688 | 143.375 | 76.888 | 36.388 |
| 2016-03-223:27:05 PM | 33.8 | 143.375 | 76.888 | 36.388 |
| 2016-03-223:27:11 PM | 33.688 | 143.375 | 77 | 36.388 |
| 2016-03-223:27:17 PM | 33.688 | 143.375 | 76.888 | 36.388 |
| 2016-03-223:27:23 PM | 33.688 | 143.262 | 76.888 | 36.5 |
| 2016-03-223:27:30 PM | 33.688 | 143.262 | 76.888 | 36.388 |
| 2016-03-223:27:36 PM | 33.8 | 143.15 | 76.888 | 36.275 |
| 2016-03-223:27:42 PM | 33.8 | 143.15 | 77 | 36.05 |
| 2016-03-223:27:48 PM | 33.688 | 143.15 | 76.888 | 35.938 |
| 2016-03-223:27:54 PM | 33.688 | 143.038 | 76.888 | 35.712 |
| 2016-03-223:28:01 PM | 33.8 | 143.038 | 76.888 | 35.825 |
| 2016-03-223:28:07 PM | 33.8 | 142.925 | 76.888 | 35.938 |
| 2016-03-223:28:13 PM | 33.688 | 142.925 | 76.888 | 36.05 |
| 2016-03-223:28:19 PM | 33.688 | 142.812 | 76.888 | 35.938 |
| 2016-03-223:28:26 PM | 33.8 | 142.812 | 76.888 | 35.938 |
| 2016-03-223:28:32 PM | 33.688 | 142.812 | 76.775 | 36.05 |
| 2016-03-223:28:38 PM | 33.8 | 142.588 | 76.888 | 35.938 |
| 2016-03-223:28:44 PM | 33.8 | 142.588 | 76.888 | 36.162 |
| 2016-03-223:28:51 PM | 33.8 | 142.588 | 76.888 | 36.275 |
| 2016-03-223:28:57 PM | 33.688 | 142.475 | 76.888 | 36.5 |
| 2016-03-223:29:03 PM | 33.8 | 142.362 | 76.888 | 36.725 |
| 2016-03-223:29:09 PM | 33.8 | 142.362 | 76.888 | 36.838 |
| 2016-03-223:29:16 PM | 33.8 | 142.362 | 76.888 | 36.725 |
| 2016-03-223:29:22 PM | 33.8 | 142.25 | 76.888 | 36.725 |
| 2016-03-223:29:28 PM | 33.8 | 142.25 | 76.888 | 36.838 |
| 2016-03-223:29:34 PM | 33.8 | 142.138 | 76.888 | 36.725 |
| 2016-03-223:29:41 PM | 33.8 | 142.138 | 76.888 | 36.838 |
| 2016-03-223:29:47 PM | 33.8 | 142.025 | 76.888 | 36.95 |
| 2016-03-223:29:53 PM | 33.8 | 142.025 | 76.888 | 36.838 |
| 2016-03-223:29:59 PM | 33.8 | 142.025 | 76.888 | 36.725 |
| 2016-03-223:30:06 PM | 33.8 | 141.912 | 76.775 | 36.838 |
| 2016-03-223:30:12 PM | 33.8 | 142.025 | 76.775 | 37.062 |
| 2016-03-223:30:18 PM | 33.8 | 141.912 | 76.775 | 36.95 |
| 2016-03-223:30:24 PM | 33.8 | 141.912 | 76.888 | 37.062 |
| 2016-03-223:30:37 PM | 33.8 | 141.912 | 76.775 | 37.4 |
| 2016-03-223:30:43 PM | 33.8 | 141.912 | 76.775 | 37.512 |
| 2016-03-223:30:49 PM | 33.8 | 141.8 | 76.775 | 37.625 |
| 2016-03-223:30:55 PM | 33.8 | 141.8 | 76.775 | 37.512 |
| 2016-03-223:31:02 PM | 33.8 | 141.8 | 76.775 | 37.625 |
| 2016-03-223:31:08 PM | 33.8 | 141.8 | 76.662 | 37.625 |
| 2016-03-223:31:13 PM | 33.8 | 141.8 | 76.662 | 37.738 |
| 2016-03-223:31:19 PM | 33.8 | 141.688 | 76.662 | 37.738 |
| 2016-03-223:31:25 PM | 33.912 | 141.8 | 76.662 | 37.85 |
| 2016-03-223:31:32 PM | 33.8 | 141.8 | 76.662 | 37.962 |
| 2016-03-223:31:38 PM | 33.912 | 141.688 | 76.775 | 38.075 |
| 2016-03-223:31:44 PM | 33.8 | 141.8 | 76.775 | 37.962 |
| 2016-03-223:31:50 PM | 33.912 | 141.8 | 76.775 | 37.85 |
| 2016-03-223:31:56 PM | 33.8 | 141.8 | 76.775 | 38.075 |
| 2016-03-223:32:03 PM | 33.912 | 141.8 | 76.775 | 38.188 |
| 2016-03-223:32:09 PM | 33.8 | 141.8 | 76.662 | 37.738 |
| 2016-03-223:32:15 PM | 33.8 | 141.8 | 76.775 | 37.625 |
| 2016-03-223:32:21 PM | 33.8 | 141.8 | 76.775 | 37.625 |
| 2016-03-223:32:28 PM | 33.912 | 141.8 | 76.775 | 37.625 |
| 2016-03-223:32:34 PM | 33.912 | 141.8 | 76.775 | 37.738 |
| 2016-03-223:32:40 PM | 33.912 | 141.8 | 76.775 | 37.738 |
| 2016-03-223:32:46 PM | 33.912 | 141.8 | 76.775 | 37.85 |
| 2016-03-223:32:53 PM | 33.8 | 141.8 | 76.662 | 37.85 |
| 2016-03-223:32:59 PM | 33.912 | 141.8 | 76.662 | 37.738 |
| 2016-03-223:33:05 PM | 33.912 | 141.8 | 76.662 | 37.85 |
| 2016-03-223:33:11 PM | 33.912 | 141.8 | 76.662 | 37.738 |
| 2016-03-223:33:17 PM | 33.912 | 141.8 | 76.775 | 37.625 |
| 2016-03-223:33:24 PM | 34.025 | 141.8 | 76.775 | 37.4 |
| 2016-03-223:33:30 PM | 33.912 | 141.8 | 76.775 | 37.288 |
| 2016-03-223:33:36 PM | 33.912 | 141.8 | 76.662 | 37.4 |
| 2016-03-223:33:42 PM | 33.912 | 141.8 | 76.662 | 37.512 |
| 2016-03-223:33:49 PM | 33.912 | 141.688 | 76.662 | 37.625 |
| 2016-03-223:33:55 PM | 33.912 | 141.8 | 76.662 | 37.625 |
| 2016-03-223:34:01 PM | 33.912 | 141.688 | 76.55 | 37.85 |
| 2016-03-223:34:07 PM | 34.025 | 141.8 | 76.55 | 37.85 |
| 2016-03-223:34:13 PM | 34.025 | 141.8 | 76.55 | 37.85 |
| 2016-03-223:34:20 PM | 33.912 | 141.8 | 76.55 | 37.962 |
| 2016-03-223:34:26 PM | 34.025 | 141.688 | 76.662 | 38.188 |
| 2016-03-223:34:32 PM | 34.025 | 141.8 | 76.55 | 38.3 |
| 2016-03-223:34:38 PM | 34.025 | 141.8 | 76.55 | 38.3 |
| 2016-03-223:34:45 PM | 33.912 | 141.8 | 76.55 | 38.412 |
| 2016-03-223:34:51 PM | 34.025 | 141.8 | 76.55 | 38.525 |
| 2016-03-223:34:57 PM | 34.025 | 141.8 | 76.55 | 38.525 |
| 2016-03-223:35:03 PM | 34.025 | 141.8 | 76.55 | 38.412 |
| 2016-03-223:35:09 PM | 34.025 | 141.688 | 76.55 | 38.412 |
| 2016-03-223:35:16 PM | 34.025 | 141.8 | 76.438 | 38.525 |
| 2016-03-223:35:22 PM | 34.025 | 141.688 | 76.438 | 38.638 |
| 2016-03-223:35:28 PM | 34.025 | 141.8 | 76.438 | 38.75 |
| 2016-03-223:35:34 PM | 34.138 | 141.688 | 76.325 | 38.75 |
| 2016-03-223:35:40 PM | 34.025 | 141.688 | 76.325 | 38.975 |
| 2016-03-223:35:47 PM | 34.025 | 141.688 | 76.325 | 38.975 |
| 2016-03-223:35:53 PM | 34.025 | 141.688 | 76.325 | 38.975 |
| 2016-03-223:35:59 PM | 34.025 | 141.688 | 76.325 | 38.862 |
| 2016-03-223:36:05 PM | 34.025 | 141.688 | 76.325 | 38.638 |
| 2016-03-223:36:12 PM | 34.025 | 141.688 | 76.325 | 38.638 |
| 2016-03-223:36:18 PM | 34.025 | 141.688 | 76.212 | 38.525 |
| 2016-03-223:36:24 PM | 34.025 | 141.688 | 76.212 | 38.75 |
| 2016-03-223:36:30 PM | 34.025 | 141.575 | 76.212 | 38.75 |
| 2016-03-223:36:36 PM | 34.138 | 141.575 | 76.212 | 38.75 |
| 2016-03-223:36:43 PM | 34.025 | 141.575 | 76.212 | 38.75 |
| 2016-03-223:36:49 PM | 34.025 | 141.575 | 76.212 | 38.75 |
| 2016-03-223:36:55 PM | 34.138 | 141.575 | 76.212 | 38.75 |
| 2016-03-223:37:01 PM | 34.025 | 141.575 | 76.212 | 38.525 |
| 2016-03-223:37:07 PM | 34.138 | 141.462 | 76.212 | 38.525 |
| 2016-03-223:37:14 PM | 34.138 | 141.462 | 76.212 | 38.638 |
| 2016-03-223:37:20 PM | 34.025 | 141.462 | 76.212 | 38.638 |
| 2016-03-223:37:26 PM | 34.138 | 141.462 | 76.212 | 38.412 |
| 2016-03-223:37:32 PM | 34.138 | 141.35 | 76.212 | 38.525 |
| 2016-03-223:37:38 PM | 34.025 | 141.35 | 76.212 | 38.638 |
| 2016-03-223:37:45 PM | 34.138 | 141.35 | 76.212 | 38.525 |
| 2016-03-223:37:51 PM | 34.025 | 141.35 | 76.212 | 38.638 |
| 2016-03-223:37:57 PM | 34.138 | 141.238 | 76.212 | 38.75 |
| 2016-03-223:38:03 PM | 34.138 | 141.238 | 76.212 | 38.75 |
| 2016-03-223:38:10 PM | 34.138 | 141.238 | 76.212 | 38.862 |
| 2016-03-223:38:16 PM | 34.138 | 141.238 | 76.1 | 38.638 |
| 2016-03-223:38:22 PM | 34.138 | 141.125 | 76.1 | 38.525 |
| 2016-03-223:38:28 PM | 34.138 | 141.125 | 76.1 | 38.525 |
| 2016-03-223:38:35 PM | 34.138 | 141.125 | 76.1 | 38.638 |
| 2016-03-223:38:41 PM | 34.138 | 141.012 | 76.1 | 38.75 |
| 2016-03-223:38:47 PM | 34.138 | 141.012 | 76.1 | 38.862 |
| 2016-03-223:38:53 PM | 34.138 | 141.012 | 76.1 | 38.75 |
| 2016-03-223:38:59 PM | 34.138 | 140.9 | 76.1 | 38.525 |
| 2016-03-223:39:06 PM | 34.138 | 140.9 | 75.988 | 38.3 |
| 2016-03-223:39:12 PM | 34.138 | 140.9 | 75.988 | 38.412 |
| 2016-03-223:39:18 PM | 34.138 | 140.9 | 75.988 | 38.3 |
| 2016-03-223:39:24 PM | 34.138 | 140.9 | 76.1 | 38.188 |
| 2016-03-223:39:30 PM | 34.138 | 140.788 | 76.1 | 38.075 |
| 2016-03-223:39:37 PM | 34.138 | 140.9 | 76.1 | 37.85 |
| 2016-03-223:39:43 PM | 34.138 | 140.788 | 76.1 | 37.625 |
| 2016-03-223:39:49 PM | 34.138 | 140.788 | 75.988 | 37.625 |
| 2016-03-223:39:54 PM | 34.025 | 140.788 | 75.988 | 37.288 |
| 2016-03-223:40:01 PM | 34.138 | 140.675 | 75.988 | 37.062 |
| 2016-03-223:40:07 PM | 34.138 | 140.788 | 75.988 | 36.838 |
| 2016-03-223:40:13 PM | 34.025 | 140.675 | 75.875 | 36.838 |
| 2016-03-223:40:19 PM | 34.025 | 140.675 | 75.875 | 36.838 |
| 2016-03-223:40:25 PM | 34.025 | 140.675 | 75.875 | 36.838 |
| 2016-03-223:40:32 PM | 33.912 | 140.562 | 75.875 | 36.725 |
| 2016-03-223:40:38 PM | 34.025 | 140.45 | 75.875 | 36.725 |
| 2016-03-223:40:44 PM | 34.025 | 140.338 | 75.875 | 36.838 |
| 2016-03-223:40:50 PM | 34.025 | 140.338 | 75.762 | 36.95 |
| 2016-03-223:40:57 PM | 34.025 | 140.338 | 75.762 | 37.062 |
| 2016-03-223:41:03 PM | 34.025 | 140.112 | 75.762 | 37.062 |
| 2016-03-223:41:09 PM | 33.912 | 140 | 75.762 | 37.175 |
| 2016-03-223:41:15 PM | 34.025 | 139.888 | 75.762 | 37.4 |
| 2016-03-223:41:21 PM | 33.912 | 139.775 | 75.762 | 37.625 |
| 2016-03-223:41:28 PM | 33.912 | 139.55 | 75.762 | 37.512 |
| 2016-03-223:41:34 PM | 33.912 | 139.438 | 75.762 | 37.4 |
| 2016-03-223:41:40 PM | 33.912 | 139.325 | 75.762 | 37.288 |
| 2016-03-223:41:46 PM | 33.912 | 139.1 | 75.65 | 37.175 |
| 2016-03-223:41:53 PM | 33.912 | 138.875 | 75.65 | 36.95 |
| 2016-03-223:41:59 PM | 33.912 | 138.875 | 75.65 | 36.725 |
| 2016-03-223:42:04 PM | 34.025 | 138.65 | 75.65 | 36.725 |
| 2016-03-223:42:11 PM | 34.025 | 138.538 | 75.762 | 36.725 |
| 2016-03-223:42:17 PM | 33.912 | 138.425 | 75.762 | 36.725 |
| 2016-03-223:42:23 PM | 33.912 | 138.312 | 75.762 | 36.725 |
| 2016-03-223:42:29 PM | 33.912 | 138.2 | 75.762 | 36.725 |
| 2016-03-223:42:36 PM | 33.912 | 138.088 | 75.65 | 36.838 |
| 2016-03-223:42:42 PM | 33.912 | 138.088 | 75.65 | 36.838 |
| 2016-03-223:42:48 PM | 33.912 | 137.862 | 75.65 | 36.838 |
| 2016-03-223:42:54 PM | 34.025 | 137.862 | 75.65 | 36.725 |
| 2016-03-223:43:01 PM | 33.912 | 137.75 | 75.65 | 36.5 |
| 2016-03-223:43:07 PM | 33.912 | 137.525 | 75.538 | 36.612 |
| 2016-03-223:43:13 PM | 33.912 | 137.412 | 75.538 | 36.5 |
| 2016-03-223:43:19 PM | 33.912 | 137.3 | 75.538 | 36.612 |
| 2016-03-223:43:26 PM | 33.912 | 137.188 | 75.65 | 36.612 |
| 2016-03-223:43:32 PM | 33.912 | 137.075 | 75.65 | 36.725 |
| 2016-03-223:43:38 PM | 33.912 | 136.962 | 75.65 | 36.838 |
| 2016-03-223:43:44 PM | 33.912 | 136.85 | 75.65 | 36.838 |
| 2016-03-223:43:50 PM | 33.912 | 136.738 | 75.65 | 36.95 |
| 2016-03-223:43:57 PM | 33.912 | 136.625 | 75.65 | 36.838 |
| 2016-03-223:44:03 PM | 33.912 | 136.512 | 75.65 | 36.95 |
| 2016-03-223:44:09 PM | 33.912 | 136.4 | 75.65 | 36.95 |
| 2016-03-223:44:15 PM | 33.912 | 136.288 | 75.65 | 36.95 |
| 2016-03-223:44:22 PM | 33.912 | 136.175 | 75.65 | 36.95 |
| 2016-03-223:44:28 PM | 33.912 | 136.062 | 75.65 | 36.95 |
| 2016-03-223:44:34 PM | 33.912 | 135.95 | 75.538 | 37.062 |
| 2016-03-223:44:40 PM | 33.912 | 135.95 | 75.538 | 37.062 |
| 2016-03-223:44:47 PM | 33.912 | 135.838 | 75.538 | 37.175 |
| 2016-03-223:44:53 PM | 33.912 | 135.838 | 75.65 | 37.175 |
| 2016-03-223:44:59 PM | 33.912 | 135.725 | 75.65 | 37.288 |
| 2016-03-223:45:05 PM | 33.912 | 135.612 | 75.538 | 37.175 |
| 2016-03-223:45:12 PM | 33.912 | 135.612 | 75.538 | 37.175 |
| 2016-03-223:45:18 PM | 33.912 | 135.5 | 75.538 | 37.175 |
| 2016-03-223:45:24 PM | 33.912 | 135.388 | 75.538 | 37.062 |
| 2016-03-223:45:30 PM | 34.025 | 135.388 | 75.538 | 36.95 |
| 2016-03-223:45:37 PM | 33.912 | 135.275 | 75.538 | 37.062 |
| 2016-03-223:45:43 PM | 33.912 | 135.275 | 75.538 | 37.062 |
| 2016-03-223:45:49 PM | 33.912 | 135.275 | 75.538 | 37.175 |
| 2016-03-223:45:55 PM | 34.025 | 135.162 | 75.538 | 37.175 |
| 2016-03-223:46:01 PM | 33.912 | 135.162 | 75.538 | 37.288 |
| 2016-03-223:46:08 PM | 33.912 | 135.05 | 75.538 | 37.175 |
| 2016-03-223:46:14 PM | 33.912 | 135.05 | 75.425 | 37.062 |
| 2016-03-223:46:20 PM | 33.912 | 135.05 | 75.425 | 37.175 |
| 2016-03-223:46:26 PM | 33.912 | 135.05 | 75.425 | 37.175 |
| 2016-03-223:46:33 PM | 33.912 | 134.938 | 75.425 | 36.95 |
| 2016-03-223:46:39 PM | 33.912 | 134.938 | 75.425 | 36.725 |
| 2016-03-223:46:45 PM | 33.912 | 134.938 | 75.425 | 36.612 |
| 2016-03-223:46:51 PM | 33.912 | 134.825 | 75.312 | 36.725 |
| 2016-03-223:46:58 PM | 33.912 | 134.712 | 75.312 | 36.725 |
| 2016-03-223:47:04 PM | 33.912 | 134.712 | 75.312 | 36.838 |
| 2016-03-223:47:10 PM | 33.912 | 134.6 | 75.312 | 36.838 |
| 2016-03-223:47:16 PM | 33.912 | 134.488 | 75.312 | 36.838 |
| 2016-03-223:47:23 PM | 33.912 | 134.488 | 75.312 | 37.062 |
| 2016-03-223:47:29 PM | 34.025 | 134.375 | 75.312 | 37.175 |
| 2016-03-223:47:35 PM | 33.912 | 134.375 | 75.312 | 37.175 |
| 2016-03-223:47:41 PM | 33.912 | 134.262 | 75.312 | 37.175 |
| 2016-03-223:47:48 PM | 33.912 | 134.262 | 75.312 | 37.062 |
| 2016-03-223:47:54 PM | 33.912 | 134.15 | 75.312 | 36.95 |
| 2016-03-223:48:00 PM | 33.8 | 134.15 | 75.312 | 36.725 |
| 2016-03-223:48:06 PM | 33.912 | 134.038 | 75.312 | 36.838 |
| 2016-03-223:48:13 PM | 33.912 | 134.038 | 75.2 | 36.5 |
| 2016-03-223:48:19 PM | 33.912 | 133.925 | 75.2 | 36.275 |
| 2016-03-223:48:25 PM | 33.8 | 133.812 | 75.2 | 36.162 |
| 2016-03-223:48:31 PM | 33.8 | 133.812 | 75.2 | 36.162 |
| 2016-03-223:48:38 PM | 33.8 | 133.7 | 75.2 | 36.275 |
| 2016-03-223:48:44 PM | 33.8 | 133.7 | 75.2 | 36.388 |
| 2016-03-223:48:50 PM | 33.8 | 133.588 | 75.2 | 36.388 |
| 2016-03-223:48:56 PM | 33.8 | 133.588 | 75.2 | 36.162 |
| 2016-03-223:49:03 PM | 33.912 | 133.475 | 75.2 | 36.275 |
| 2016-03-223:49:09 PM | 33.8 | 133.362 | 75.2 | 36.388 |
| 2016-03-223:49:15 PM | 33.912 | 133.362 | 75.2 | 36.388 |
| 2016-03-223:49:21 PM | 33.8 | 133.25 | 75.2 | 36.388 |
| 2016-03-223:49:27 PM | 33.912 | 133.25 | 75.2 | 36.388 |
| 2016-03-223:49:34 PM | 33.912 | 133.138 | 75.2 | 36.162 |
| 2016-03-223:49:40 PM | 33.912 | 133.138 | 75.088 | 36.162 |
| 2016-03-223:49:46 PM | 33.912 | 133.025 | 75.088 | 36.162 |
| 2016-03-223:49:52 PM | 33.912 | 132.912 | 75.088 | 36.388 |
| 2016-03-223:49:59 PM | 33.912 | 132.912 | 75.088 | 36.612 |
| 2016-03-223:50:05 PM | 33.912 | 132.8 | 75.088 | 36.5 |
| 2016-03-223:50:11 PM | 33.912 | 132.688 | 75.088 | 36.5 |
| 2016-03-223:50:17 PM | 33.912 | 132.575 | 75.088 | 36.612 |
| 2016-03-223:50:24 PM | 33.912 | 132.462 | 75.088 | 36.725 |
| 2016-03-223:50:30 PM | 33.912 | 132.462 | 75.088 | 36.838 |
| 2016-03-223:50:36 PM | 33.912 | 132.35 | 75.088 | 36.95 |
| 2016-03-223:50:42 PM | 33.912 | 132.35 | 75.088 | 37.062 |
| 2016-03-223:50:49 PM | 33.912 | 132.238 | 75.088 | 36.95 |
| 2016-03-223:50:55 PM | 33.912 | 132.238 | 75.088 | 36.5 |
| 2016-03-223:51:01 PM | 33.912 | 132.238 | 74.975 | 36.275 |
| 2016-03-223:51:07 PM | 33.912 | 132.125 | 74.975 | 36.162 |
| 2016-03-223:51:14 PM | 33.912 | 132.125 | 74.975 | 36.275 |
| 2016-03-223:51:20 PM | 33.912 | 132.125 | 74.975 | 36.388 |
| 2016-03-223:51:26 PM | 33.912 | 132.012 | 74.862 | 36.5 |
| 2016-03-223:51:32 PM | 33.912 | 132.012 | 74.862 | 36.612 |
| 2016-03-223:51:39 PM | 33.912 | 131.9 | 74.862 | 36.612 |
| 2016-03-223:51:45 PM | 33.912 | 132.012 | 74.862 | 36.725 |
| 2016-03-223:51:51 PM | 33.912 | 131.9 | 74.862 | 36.725 |
| 2016-03-223:51:57 PM | 33.912 | 131.9 | 74.862 | 36.838 |
| 2016-03-223:52:04 PM | 33.912 | 131.788 | 74.862 | 36.838 |
| 2016-03-223:52:10 PM | 33.912 | 131.788 | 74.862 | 36.725 |
| 2016-03-223:52:16 PM | 33.912 | 131.675 | 74.862 | 36.838 |
| 2016-03-223:52:22 PM | 33.912 | 131.675 | 74.862 | 37.062 |
| 2016-03-223:52:29 PM | 33.912 | 131.562 | 74.862 | 37.062 |
| 2016-03-223:52:35 PM | 33.912 | 131.562 | 74.862 | 37.175 |
| 2016-03-223:52:41 PM | 33.912 | 131.45 | 74.862 | 37.175 |
| 2016-03-223:52:47 PM | 33.912 | 131.45 | 74.862 | 37.062 |
| 2016-03-223:52:54 PM | 33.912 | 131.338 | 74.862 | 36.95 |
| 2016-03-223:53:00 PM | 33.912 | 131.338 | 74.862 | 37.175 |
| 2016-03-223:53:06 PM | 33.912 | 131.225 | 74.862 | 37.175 |
| 2016-03-223:53:12 PM | 34.025 | 131.225 | 74.862 | 37.288 |
| 2016-03-223:53:18 PM | 34.025 | 131.112 | 74.862 | 37.288 |
| 2016-03-223:53:25 PM | 34.025 | 131.112 | 74.862 | 37.175 |
| 2016-03-223:53:31 PM | 34.025 | 131.112 | 74.862 | 37.175 |
| 2016-03-223:53:37 PM | 34.025 | 131.112 | 74.862 | 37.062 |
| 2016-03-223:53:43 PM | 34.025 | 131.112 | 74.75 | 37.062 |
| 2016-03-223:53:50 PM | 34.025 | 131.112 | 74.862 | 37.062 |
| 2016-03-223:53:56 PM | 34.025 | 131.112 | 74.862 | 36.95 |
| 2016-03-223:54:02 PM | 34.025 | 131.112 | 74.862 | 37.175 |
| 2016-03-223:54:08 PM | 34.138 | 131 | 74.862 | 37.175 |
| 2016-03-223:54:15 PM | 34.138 | 131 | 74.862 | 37.288 |
| 2016-03-223:54:21 PM | 34.138 | 131 | 74.862 | 37.4 |
| 2016-03-223:54:27 PM | 34.138 | 131 | 74.862 | 37.512 |
| 2016-03-223:54:33 PM | 34.138 | 131 | 74.862 | 37.512 |
| 2016-03-223:54:39 PM | 34.138 | 131 | 74.862 | 37.625 |
| 2016-03-223:54:46 PM | 34.138 | 131 | 74.75 | 37.625 |
| 2016-03-223:54:52 PM | 34.138 | 131 | 74.75 | 37.512 |
| 2016-03-223:54:58 PM | 34.138 | 131 | 74.75 | 37.625 |
| 2016-03-223:55:04 PM | 34.138 | 131 | 74.75 | 37.738 |
| 2016-03-223:55:11 PM | 34.138 | 131 | 74.75 | 37.962 |
| 2016-03-223:55:17 PM | 34.138 | 131 | 74.638 | 37.85 |
| 2016-03-223:55:23 PM | 34.138 | 131 | 74.75 | 37.625 |
| 2016-03-223:55:29 PM | 34.138 | 131 | 74.75 | 37.625 |
| 2016-03-223:55:36 PM | 34.138 | 131 | 74.75 | 37.625 |
| 2016-03-223:55:42 PM | 34.138 | 131 | 74.638 | 37.625 |
| 2016-03-223:55:48 PM | 34.138 | 131 | 74.638 | 37.625 |
| 2016-03-223:55:54 PM | 34.138 | 131 | 74.638 | 37.738 |
| 2016-03-223:56:00 PM | 34.25 | 131.112 | 74.638 | 37.625 |
| 2016-03-223:56:07 PM | 34.138 | 131.112 | 74.638 | 37.512 |
| 2016-03-223:56:13 PM | 34.138 | 131.112 | 74.638 | 37.4 |
| 2016-03-223:56:19 PM | 34.138 | 131.112 | 74.638 | 37.512 |
| 2016-03-223:56:25 PM | 34.138 | 131.112 | 74.638 | 37.625 |
| 2016-03-223:56:32 PM | 34.138 | 131.112 | 74.525 | 37.738 |
| 2016-03-223:56:38 PM | 34.138 | 131.112 | 74.525 | 37.738 |
| 2016-03-223:56:44 PM | 34.138 | 131.112 | 74.525 | 37.85 |
| 2016-03-223:56:50 PM | 34.138 | 131 | 74.525 | 37.962 |
| 2016-03-223:56:57 PM | 34.138 | 131 | 74.525 | 37.85 |
| 2016-03-223:57:03 PM | 34.138 | 131 | 74.525 | 37.738 |
| 2016-03-223:57:09 PM | 34.138 | 131 | 74.525 | 37.625 |
| 2016-03-223:57:15 PM | 34.138 | 131 | 74.525 | 37.512 |
| 2016-03-223:57:22 PM | 34.025 | 130.887 | 74.412 | 37.512 |
| 2016-03-223:57:28 PM | 34.025 | 130.887 | 74.525 | 37.4 |
| 2016-03-223:57:34 PM | 34.025 | 130.887 | 74.525 | 37.288 |
| 2016-03-223:57:40 PM | 34.025 | 130.887 | 74.412 | 37.062 |
| 2016-03-223:57:46 PM | 34.025 | 130.775 | 74.412 | 37.062 |
| 2016-03-223:57:53 PM | 33.912 | 130.775 | 74.412 | 37.062 |
| 2016-03-223:57:59 PM | 33.912 | 130.775 | 74.3 | 37.062 |
| 2016-03-223:58:05 PM | 33.912 | 130.662 | 74.3 | 36.838 |
| 2016-03-223:58:11 PM | 33.912 | 130.662 | 74.3 | 36.612 |
| 2016-03-223:58:18 PM | 33.912 | 130.662 | 74.3 | 36.612 |
| 2016-03-223:58:24 PM | 33.912 | 130.662 | 74.3 | 36.5 |
| 2016-03-223:58:30 PM | 33.912 | 130.55 | 74.3 | 36.275 |
| 2016-03-223:58:36 PM | 33.912 | 130.55 | 74.412 | 36.275 |
| 2016-03-223:58:42 PM | 33.912 | 130.55 | 74.3 | 36.162 |
| 2016-03-223:58:49 PM | 33.912 | 130.438 | 74.3 | 36.162 |
| 2016-03-223:58:55 PM | 34.025 | 130.438 | 74.3 | 36.162 |
| 2016-03-223:59:01 PM | 33.912 | 130.325 | 74.3 | 36.05 |
| 2016-03-223:59:07 PM | 34.025 | 130.212 | 74.3 | 36.162 |
| 2016-03-223:59:13 PM | 34.025 | 130.212 | 74.3 | 36.388 |
| 2016-03-223:59:20 PM | 33.912 | 130.212 | 74.3 | 36.612 |
| 2016-03-223:59:26 PM | 33.912 | 130.1 | 74.3 | 36.612 |
| 2016-03-223:59:32 PM | 34.025 | 129.988 | 74.3 | 36.725 |
| 2016-03-223:59:38 PM | 34.025 | 129.875 | 74.188 | 36.838 |
| 2016-03-223:59:44 PM | 34.025 | 129.762 | 74.188 | 36.838 |
| 2016-03-223:59:56 PM | 34.025 | 129.65 | 74.188 | 36.95 |
| 2016-03-224:00:02 PM | 34.025 | 129.538 | 74.188 | 36.838 |
| 2016-03-224:00:08 PM | 34.025 | 129.425 | 74.3 | 36.838 |
| 2016-03-224:00:14 PM | 34.025 | 129.425 | 74.188 | 36.95 |
| 2016-03-224:00:20 PM | 34.025 | 129.312 | 74.188 | 36.95 |
| 2016-03-224:00:27 PM | 34.025 | 129.2 | 74.188 | 36.95 |
| 2016-03-224:00:33 PM | 34.025 | 129.088 | 74.188 | 36.95 |
| 2016-03-224:00:39 PM | 34.025 | 129.088 | 74.188 | 36.838 |
| 2016-03-224:00:45 PM | 34.025 | 129.088 | 74.188 | 37.062 |
| 2016-03-224:00:52 PM | 34.025 | 128.975 | 74.188 | 37.175 |
| 2016-03-224:00:58 PM | 34.025 | 128.975 | 74.188 | 37.288 |
| 2016-03-224:01:04 PM | 34.025 | 128.975 | 74.188 | 37.4 |
| 2016-03-224:01:10 PM | 34.138 | 128.863 | 74.188 | 37.4 |
| 2016-03-224:01:16 PM | 34.025 | 128.863 | 74.075 | 37.512 |
| 2016-03-224:01:23 PM | 34.025 | 128.75 | 74.075 | 37.625 |
| 2016-03-224:01:29 PM | 34.138 | 128.75 | 74.075 | 37.4 |
| 2016-03-224:01:35 PM | 34.025 | 128.637 | 74.188 | 37.175 |
| 2016-03-224:01:41 PM | 34.138 | 128.637 | 74.075 | 36.838 |
| 2016-03-224:01:48 PM | 34.025 | 128.637 | 74.075 | 36.725 |
| 2016-03-224:01:54 PM | 34.025 | 128.637 | 74.075 | 36.725 |
| 2016-03-224:02:00 PM | 34.025 | 128.525 | 74.075 | 36.612 |
| 2016-03-224:02:06 PM | 34.025 | 128.525 | 74.075 | 36.725 |
| 2016-03-224:02:12 PM | 34.138 | 128.525 | 74.075 | 36.838 |
| 2016-03-224:02:19 PM | 34.138 | 128.525 | 74.075 | 36.95 |
| 2016-03-224:02:25 PM | 34.138 | 128.412 | 74.075 | 37.062 |
| 2016-03-224:02:31 PM | 34.138 | 128.188 | 74.075 | 37.175 |
| 2016-03-224:02:37 PM | 34.138 | 127.962 | 74.075 | 37.062 |
| 2016-03-224:02:43 PM | 34.138 | 127.738 | 74.075 | 37.062 |
| 2016-03-224:02:50 PM | 34.138 | 127.512 | 74.075 | 37.062 |
| 2016-03-224:02:56 PM | 34.138 | 127.4 | 74.075 | 37.175 |
| 2016-03-224:03:02 PM | 34.138 | 127.288 | 74.075 | 37.175 |
| 2016-03-224:03:08 PM | 34.25 | 127.175 | 74.075 | 37.062 |
| 2016-03-224:03:21 PM | 34.138 | 127.062 | 74.075 | 37.062 |
| 2016-03-224:03:27 PM | 34.138 | 126.95 | 74.075 | 37.062 |
| 2016-03-224:03:33 PM | 34.138 | 126.95 | 74.075 | 37.062 |
| 2016-03-224:03:39 PM | 34.138 | 126.95 | 73.962 | 37.175 |
| 2016-03-224:03:46 PM | 34.138 | 126.838 | 73.962 | 37.4 |
| 2016-03-224:03:52 PM | 34.138 | 126.838 | 74.075 | 37.625 |
| 2016-03-224:03:58 PM | 34.138 | 126.838 | 74.075 | 37.625 |
| 2016-03-224:04:04 PM | 34.138 | 126.838 | 74.075 | 37.512 |
| 2016-03-224:04:10 PM | 34.138 | 126.838 | 73.962 | 37.288 |
| 2016-03-224:04:17 PM | 34.138 | 126.838 | 73.962 | 37.062 |
| 2016-03-224:04:23 PM | 34.138 | 126.838 | 73.962 | 36.725 |
| 2016-03-224:04:29 PM | 34.138 | 126.838 | 73.962 | 36.725 |
| 2016-03-224:04:35 PM | 34.138 | 126.838 | 73.962 | 36.612 |
| 2016-03-224:04:42 PM | 34.025 | 126.838 | 73.962 | 36.612 |
| 2016-03-224:04:48 PM | 34.025 | 126.838 | 73.962 | 36.725 |
| 2016-03-224:04:54 PM | 34.025 | 126.725 | 73.85 | 36.612 |
| 2016-03-224:05:00 PM | 34.025 | 126.725 | 73.962 | 36.5 |
| 2016-03-224:05:06 PM | 34.025 | 126.5 | 73.962 | 36.5 |
| 2016-03-224:05:13 PM | 34.025 | 126.275 | 73.962 | 36.612 |
| 2016-03-224:05:19 PM | 34.025 | 125.938 | 73.85 | 36.725 |
| 2016-03-224:05:25 PM | 33.912 | 125.6 | 73.962 | 36.725 |
| 2016-03-224:05:31 PM | 33.912 | 125.375 | 73.962 | 36.838 |
| 2016-03-224:05:37 PM | 33.912 | 125.15 | 73.962 | 36.838 |
| 2016-03-224:05:44 PM | 33.912 | 125.038 | 73.85 | 36.612 |
| 2016-03-224:05:50 PM | 33.912 | 124.925 | 73.962 | 36.5 |
| 2016-03-224:05:56 PM | 33.912 | 124.812 | 73.962 | 36.388 |
| 2016-03-224:06:02 PM | 33.912 | 124.7 | 73.962 | 36.275 |
| 2016-03-224:06:09 PM | 33.912 | 124.588 | 73.962 | 36.275 |
| 2016-03-224:06:15 PM | 33.8 | 124.588 | 73.962 | 36.05 |
| 2016-03-224:06:21 PM | 33.8 | 124.475 | 73.85 | 35.938 |
| 2016-03-224:06:27 PM | 33.912 | 124.362 | 73.962 | 35.825 |
| 2016-03-224:06:33 PM | 33.8 | 124.362 | 73.85 | 35.712 |
| 2016-03-224:06:40 PM | 33.8 | 124.362 | 73.85 | 35.712 |
| 2016-03-224:06:46 PM | 33.8 | 124.362 | 73.85 | 35.825 |
| 2016-03-224:06:52 PM | 33.8 | 124.362 | 73.85 | 35.712 |
| 2016-03-224:06:58 PM | 33.8 | 124.362 | 73.85 | 35.6 |
| 2016-03-224:07:04 PM | 33.8 | 124.25 | 73.85 | 35.6 |
| 2016-03-224:07:10 PM | 33.8 | 124.25 | 73.85 | 35.488 |
| 2016-03-224:07:17 PM | 33.8 | 124.138 | 73.85 | 35.488 |
| 2016-03-224:07:23 PM | 33.8 | 124.025 | 73.85 | 35.375 |
| 2016-03-224:07:29 PM | 33.8 | 123.913 | 73.85 | 35.262 |
| 2016-03-224:07:35 PM | 33.912 | 123.8 | 73.85 | 35.262 |
| 2016-03-224:07:42 PM | 33.912 | 123.8 | 73.85 | 35.375 |
| 2016-03-224:07:48 PM | 33.912 | 123.688 | 73.85 | 35.375 |
| 2016-03-224:07:54 PM | 33.912 | 123.688 | 73.85 | 35.488 |
| 2016-03-224:08:00 PM | 33.912 | 123.575 | 73.738 | 35.6 |
| 2016-03-224:08:07 PM | 33.912 | 123.462 | 73.85 | 35.6 |
| 2016-03-224:08:13 PM | 33.912 | 123.462 | 73.85 | 35.488 |
| 2016-03-224:08:19 PM | 33.912 | 123.35 | 73.85 | 35.712 |
| 2016-03-224:08:25 PM | 33.8 | 123.238 | 73.85 | 35.825 |
| 2016-03-224:08:31 PM | 33.8 | 123.125 | 73.85 | 35.938 |
| 2016-03-224:08:38 PM | 33.8 | 123.125 | 73.85 | 35.938 |
| 2016-03-224:08:44 PM | 33.8 | 122.9 | 73.85 | 35.938 |
| 2016-03-224:08:50 PM | 33.8 | 122.9 | 73.85 | 35.825 |
| 2016-03-224:08:56 PM | 33.8 | 122.788 | 73.738 | 35.825 |
| 2016-03-224:09:02 PM | 33.8 | 122.675 | 73.85 | 35.6 |
| 2016-03-224:09:09 PM | 33.8 | 122.562 | 73.738 | 35.488 |
| 2016-03-224:09:15 PM | 33.8 | 122.562 | 73.738 | 35.375 |
| 2016-03-224:09:21 PM | 33.8 | 122.45 | 73.738 | 35.375 |
| 2016-03-224:09:27 PM | 33.8 | 122.45 | 73.738 | 35.488 |
| 2016-03-224:09:34 PM | 33.8 | 122.225 | 73.738 | 35.375 |
| 2016-03-224:09:40 PM | 33.912 | 122.338 | 73.738 | 35.375 |
| 2016-03-224:09:46 PM | 33.912 | 122.225 | 73.738 | 35.375 |
| 2016-03-224:09:52 PM | 33.912 | 122.112 | 73.738 | 35.375 |
| 2016-03-224:09:58 PM | 33.912 | 122.112 | 73.738 | 35.375 |
| 2016-03-224:10:04 PM | 33.912 | 122.112 | 73.738 | 35.488 |
| 2016-03-224:10:10 PM | 33.8 | 122.112 | 73.738 | 35.488 |
| 2016-03-224:10:17 PM | 33.912 | 122 | 73.738 | 35.6 |
| 2016-03-224:10:29 PM | 33.912 | 122 | 73.738 | 35.938 |
| 2016-03-224:10:35 PM | 33.912 | 122 | 73.738 | 36.05 |
| 2016-03-224:10:41 PM | 33.912 | 121.888 | 73.738 | 36.275 |
| 2016-03-224:10:47 PM | 33.912 | 121.888 | 73.738 | 36.162 |
| 2016-03-224:10:53 PM | 33.912 | 121.888 | 73.738 | 36.05 |
| 2016-03-224:10:59 PM | 33.912 | 121.775 | 73.738 | 36.05 |
| 2016-03-224:11:05 PM | 33.912 | 121.663 | 73.738 | 36.05 |
| 2016-03-224:11:12 PM | 33.912 | 121.663 | 73.625 | 35.938 |
| 2016-03-224:11:18 PM | 33.912 | 121.55 | 73.625 | 35.938 |
| 2016-03-224:11:24 PM | 33.8 | 121.55 | 73.625 | 35.938 |
| 2016-03-224:11:30 PM | 33.8 | 121.55 | 73.625 | 36.05 |
| 2016-03-224:11:37 PM | 33.8 | 121.438 | 73.625 | 36.05 |
| 2016-03-224:11:43 PM | 33.8 | 121.438 | 73.625 | 35.825 |
| 2016-03-224:11:49 PM | 33.8 | 121.438 | 73.625 | 35.825 |
| 2016-03-224:11:55 PM | 33.8 | 121.438 | 73.512 | 35.825 |
| 2016-03-224:12:01 PM | 33.8 | 121.438 | 73.512 | 35.712 |
| 2016-03-224:12:08 PM | 33.8 | 121.325 | 73.512 | 35.712 |
| 2016-03-224:12:14 PM | 33.8 | 121.325 | 73.512 | 35.712 |
| 2016-03-224:12:20 PM | 33.8 | 121.325 | 73.512 | 35.6 |
| 2016-03-224:12:26 PM | 33.8 | 121.325 | 73.512 | 35.6 |
| 2016-03-224:12:33 PM | 33.8 | 121.325 | 73.512 | 35.488 |
| 2016-03-224:12:39 PM | 33.8 | 121.212 | 73.512 | 35.375 |
| 2016-03-224:12:45 PM | 33.8 | 121.212 | 73.625 | 35.375 |
| 2016-03-224:12:51 PM | 33.912 | 121.212 | 73.625 | 35.262 |
| 2016-03-224:12:58 PM | 33.912 | 121.1 | 73.625 | 35.262 |
| 2016-03-224:13:04 PM | 33.8 | 121.1 | 73.625 | 35.262 |
| 2016-03-224:13:10 PM | 33.912 | 120.988 | 73.625 | 35.262 |
| 2016-03-224:13:16 PM | 33.912 | 120.988 | 73.625 | 35.262 |
| 2016-03-224:13:22 PM | 33.912 | 120.988 | 73.625 | 35.262 |
| 2016-03-224:13:29 PM | 33.912 | 120.875 | 73.625 | 35.262 |
| 2016-03-224:13:35 PM | 33.912 | 120.875 | 73.625 | 35.375 |
| 2016-03-224:13:41 PM | 33.912 | 120.762 | 73.625 | 35.375 |
| 2016-03-224:13:47 PM | 33.912 | 120.762 | 73.625 | 35.375 |
| 2016-03-224:13:54 PM | 34.025 | 120.65 | 73.625 | 35.488 |
| 2016-03-224:14:00 PM | 34.025 | 120.65 | 73.625 | 35.6 |
| 2016-03-224:14:06 PM | 34.025 | 120.538 | 73.625 | 35.712 |
| 2016-03-224:14:12 PM | 33.912 | 120.425 | 73.625 | 35.825 |
| 2016-03-224:14:18 PM | 33.912 | 120.425 | 73.625 | 35.825 |
| 2016-03-224:14:25 PM | 34.025 | 120.312 | 73.512 | 35.825 |
| 2016-03-224:14:31 PM | 34.025 | 120.2 | 73.625 | 35.938 |
| 2016-03-224:14:37 PM | 34.025 | 120.088 | 73.512 | 35.938 |
| 2016-03-224:14:43 PM | 33.912 | 120.088 | 73.512 | 36.05 |
| 2016-03-224:14:50 PM | 34.025 | 119.975 | 73.512 | 36.05 |
| 2016-03-224:14:56 PM | 34.025 | 119.975 | 73.512 | 36.05 |
| 2016-03-224:15:02 PM | 33.912 | 119.862 | 73.512 | 36.05 |
| 2016-03-224:15:08 PM | 33.912 | 119.862 | 73.512 | 36.162 |
| 2016-03-224:15:14 PM | 33.912 | 119.75 | 73.512 | 36.162 |
| 2016-03-224:15:26 PM | 33.912 | 119.75 | 73.512 | 36.05 |
| 2016-03-224:15:32 PM | 33.912 | 119.75 | 73.512 | 36.162 |
| 2016-03-224:15:38 PM | 33.912 | 119.75 | 73.4 | 36.275 |
| 2016-03-224:15:44 PM | 33.912 | 119.75 | 73.4 | 36.275 |
| 2016-03-224:15:50 PM | 33.912 | 119.75 | 73.4 | 36.275 |
| 2016-03-224:15:57 PM | 33.912 | 119.638 | 73.4 | 36.162 |
| 2016-03-224:16:03 PM | 33.912 | 119.638 | 73.4 | 36.05 |
| 2016-03-224:16:09 PM | 33.912 | 119.638 | 73.4 | 35.825 |
| 2016-03-224:16:15 PM | 33.8 | 119.638 | 73.4 | 35.6 |
| 2016-03-224:16:22 PM | 33.912 | 119.525 | 73.4 | 35.488 |
| 2016-03-224:16:28 PM | 33.8 | 119.525 | 73.4 | 35.488 |
| 2016-03-224:16:34 PM | 33.912 | 119.525 | 73.4 | 35.488 |
| 2016-03-224:16:40 PM | 33.8 | 119.525 | 73.4 | 35.488 |
| 2016-03-224:16:46 PM | 33.912 | 119.525 | 73.4 | 35.6 |
| 2016-03-224:16:53 PM | 33.912 | 119.413 | 73.4 | 35.488 |
| 2016-03-224:16:59 PM | 33.912 | 119.525 | 73.4 | 35.375 |
| 2016-03-224:17:05 PM | 33.912 | 119.413 | 73.4 | 35.375 |
| 2016-03-224:17:11 PM | 33.912 | 119.3 | 73.4 | 35.375 |
| 2016-03-224:17:18 PM | 33.912 | 118.962 | 73.4 | 35.375 |
| 2016-03-224:17:24 PM | 33.912 | 118.625 | 73.288 | 35.262 |
| 2016-03-224:17:30 PM | 33.912 | 118.175 | 73.288 | 35.488 |
| 2016-03-224:17:36 PM | 33.912 | 117.725 | 73.288 | 35.488 |
| 2016-03-224:17:42 PM | 34.025 | 117.388 | 73.288 | 35.488 |
| 2016-03-224:17:49 PM | 33.912 | 117.05 | 73.288 | 35.712 |
| 2016-03-224:17:55 PM | 33.912 | 116.712 | 73.288 | 35.825 |
| 2016-03-224:18:01 PM | 34.025 | 116.488 | 73.288 | 35.825 |
| 2016-03-224:18:07 PM | 34.025 | 116.15 | 73.175 | 35.938 |
| 2016-03-224:18:14 PM | 34.025 | 115.925 | 73.175 | 35.825 |
| 2016-03-224:18:20 PM | 34.025 | 115.7 | 73.175 | 35.6 |
| 2016-03-224:18:26 PM | 34.025 | 115.588 | 73.175 | 35.712 |
| 2016-03-224:18:32 PM | 34.025 | 115.475 | 73.175 | 35.712 |
| 2016-03-224:18:38 PM | 34.138 | 115.362 | 73.175 | 35.825 |
| 2016-03-224:18:45 PM | 34.138 | 115.362 | 73.175 | 35.938 |
| 2016-03-224:18:51 PM | 34.138 | 115.25 | 73.175 | 36.05 |
| 2016-03-224:18:57 PM | 34.138 | 115.25 | 73.175 | 36.05 |
| 2016-03-224:19:03 PM | 34.138 | 115.25 | 73.175 | 35.938 |
| 2016-03-224:19:10 PM | 34.138 | 115.25 | 73.175 | 36.05 |
| 2016-03-224:19:16 PM | 34.138 | 115.25 | 73.175 | 36.05 |
| 2016-03-224:19:22 PM | 34.138 | 115.25 | 73.175 | 36.275 |
| 2016-03-224:19:28 PM | 34.138 | 115.25 | 73.175 | 36.5 |
| 2016-03-224:19:34 PM | 34.138 | 115.362 | 73.175 | 36.5 |
| 2016-03-224:19:41 PM | 34.138 | 115.362 | 73.175 | 36.612 |
| 2016-03-224:19:47 PM | 34.25 | 115.475 | 73.175 | 36.725 |
| 2016-03-224:19:53 PM | 34.25 | 115.475 | 73.175 | 36.725 |
| 2016-03-224:19:59 PM | 34.25 | 115.588 | 73.175 | 36.612 |
| 2016-03-224:20:05 PM | 34.138 | 115.588 | 73.062 | 36.612 |
| 2016-03-224:20:12 PM | 34.25 | 115.7 | 73.175 | 36.5 |
| 2016-03-224:20:18 PM | 34.25 | 115.7 | 73.062 | 36.388 |
| 2016-03-224:20:24 PM | 34.138 | 115.812 | 73.175 | 36.275 |
| 2016-03-224:20:30 PM | 34.138 | 115.925 | 73.062 | 36.275 |
| 2016-03-224:20:37 PM | 34.138 | 115.925 | 73.175 | 36.275 |
| 2016-03-224:20:43 PM | 34.138 | 115.925 | 73.062 | 36.388 |
| 2016-03-224:20:49 PM | 34.138 | 116.038 | 73.062 | 36.162 |
| 2016-03-224:20:55 PM | 34.138 | 116.038 | 73.062 | 36.162 |
| 2016-03-224:21:01 PM | 34.138 | 116.15 | 73.062 | 36.162 |
| 2016-03-224:21:08 PM | 34.025 | 116.262 | 73.062 | 36.05 |
| 2016-03-224:21:14 PM | 34.025 | 116.262 | 73.062 | 36.05 |
| 2016-03-224:21:20 PM | 34.025 | 116.375 | 73.175 | 36.05 |
| 2016-03-224:21:26 PM | 34.025 | 116.375 | 73.062 | 35.825 |
| 2016-03-224:21:33 PM | 34.025 | 116.488 | 73.062 | 35.825 |
| 2016-03-224:21:39 PM | 34.025 | 116.488 | 73.062 | 35.825 |
| 2016-03-224:21:45 PM | 34.025 | 116.488 | 73.062 | 35.712 |
| 2016-03-224:21:51 PM | 34.025 | 116.6 | 73.062 | 35.712 |
| 2016-03-224:21:57 PM | 34.025 | 116.6 | 73.062 | 35.6 |
| 2016-03-224:22:04 PM | 34.025 | 116.712 | 73.062 | 35.488 |
| 2016-03-224:22:10 PM | 34.025 | 116.712 | 73.062 | 35.375 |
| 2016-03-224:22:16 PM | 34.025 | 116.712 | 73.062 | 35.375 |
| 2016-03-224:22:22 PM | 34.025 | 116.712 | 73.062 | 35.488 |
| 2016-03-224:22:29 PM | 34.025 | 116.825 | 73.062 | 35.6 |
| 2016-03-224:22:35 PM | 34.025 | 116.712 | 73.062 | 35.6 |
| 2016-03-224:22:41 PM | 34.025 | 116.825 | 73.062 | 35.6 |
| 2016-03-224:22:47 PM | 34.025 | 116.712 | 73.062 | 35.6 |
| 2016-03-224:22:53 PM | 34.138 | 116.712 | 73.062 | 35.6 |
| 2016-03-224:23:00 PM | 34.138 | 116.712 | 73.062 | 35.825 |
| 2016-03-224:23:06 PM | 34.138 | 116.712 | 73.062 | 35.938 |
| 2016-03-224:23:12 PM | 34.138 | 116.712 | 73.062 | 35.938 |
| 2016-03-224:23:18 PM | 34.138 | 116.712 | 73.062 | 36.05 |
| 2016-03-224:23:25 PM | 34.138 | 116.712 | 73.062 | 36.05 |
| 2016-03-224:23:31 PM | 34.138 | 116.712 | 73.062 | 36.05 |
| 2016-03-224:23:37 PM | 34.138 | 116.6 | 73.062 | 36.05 |
| 2016-03-224:23:43 PM | 34.25 | 116.6 | 73.062 | 35.938 |
| 2016-03-224:23:49 PM | 34.138 | 116.6 | 73.062 | 35.938 |
| 2016-03-224:23:56 PM | 34.25 | 116.6 | 73.062 | 35.825 |
| 2016-03-224:24:02 PM | 34.25 | 116.488 | 73.062 | 36.05 |
| 2016-03-224:24:08 PM | 34.138 | 116.488 | 73.062 | 36.05 |
| 2016-03-224:24:14 PM | 34.25 | 116.488 | 73.062 | 36.162 |
| 2016-03-224:24:21 PM | 34.25 | 116.488 | 73.062 | 36.05 |
| 2016-03-224:24:27 PM | 34.138 | 116.488 | 73.175 | 35.938 |
| 2016-03-224:24:33 PM | 34.138 | 116.488 | 73.175 | 36.162 |
| 2016-03-224:24:39 PM | 34.138 | 116.488 | 73.062 | 36.05 |
| 2016-03-224:24:45 PM | 34.138 | 116.375 | 73.062 | 36.05 |
| 2016-03-224:24:52 PM | 34.138 | 116.488 | 73.062 | 36.162 |
| 2016-03-224:24:58 PM | 34.138 | 116.488 | 73.062 | 36.162 |
| 2016-03-224:25:04 PM | 34.138 | 116.488 | 73.062 | 36.05 |
| 2016-03-224:25:10 PM | 34.138 | 116.488 | 73.062 | 36.05 |
| 2016-03-224:25:17 PM | 34.138 | 116.488 | 73.062 | 35.938 |
| 2016-03-224:25:23 PM | 34.138 | 116.375 | 73.062 | 36.05 |
| 2016-03-224:25:29 PM | 34.138 | 116.375 | 73.062 | 36.05 |
| 2016-03-224:25:35 PM | 34.138 | 116.488 | 73.062 | 36.05 |
| 2016-03-224:25:41 PM | 34.138 | 116.488 | 73.062 | 36.05 |
| 2016-03-224:25:48 PM | 34.138 | 116.488 | 73.062 | 36.05 |
| 2016-03-224:25:54 PM | 34.138 | 116.375 | 73.062 | 36.05 |
| 2016-03-224:26:00 PM | 34.138 | 116.375 | 73.062 | 35.938 |
| 2016-03-224:26:06 PM | 34.25 | 116.488 | 73.062 | 35.938 |
| 2016-03-224:26:12 PM | 34.138 | 116.488 | 72.95 | 35.938 |
| 2016-03-224:26:19 PM | 34.25 | 116.488 | 72.95 | 35.938 |
| 2016-03-224:26:25 PM | 34.25 | 116.375 | 72.95 | 35.938 |
| 2016-03-224:26:31 PM | 34.25 | 116.375 | 72.95 | 35.938 |
| 2016-03-224:26:37 PM | 34.138 | 116.375 | 72.95 | 35.938 |
| 2016-03-224:26:44 PM | 34.138 | 116.262 | 72.95 | 36.162 |
| 2016-03-224:26:50 PM | 34.138 | 116.262 | 72.95 | 36.275 |
| 2016-03-224:26:56 PM | 34.25 | 116.262 | 72.95 | 36.275 |
| 2016-03-224:27:02 PM | 34.138 | 116.262 | 72.95 | 36.162 |
| 2016-03-224:27:08 PM | 34.138 | 116.15 | 72.95 | 36.388 |
| 2016-03-224:27:15 PM | 34.25 | 116.15 | 72.95 | 36.725 |
| 2016-03-224:27:21 PM | 34.25 | 116.15 | 72.95 | 36.612 |
| 2016-03-224:27:27 PM | 34.25 | 116.15 | 72.95 | 36.612 |
| 2016-03-224:27:33 PM | 34.25 | 116.038 | 72.95 | 36.612 |
| 2016-03-224:27:40 PM | 34.25 | 116.038 | 72.838 | 36.388 |
| 2016-03-224:27:46 PM | 34.25 | 116.038 | 72.838 | 36.162 |
| 2016-03-224:27:52 PM | 34.25 | 116.038 | 72.838 | 36.162 |
| 2016-03-224:27:58 PM | 34.25 | 116.038 | 72.838 | 36.05 |
| 2016-03-224:28:04 PM | 34.25 | 116.038 | 72.838 | 36.05 |
| 2016-03-224:28:11 PM | 34.25 | 115.925 | 72.838 | 35.938 |
| 2016-03-224:28:17 PM | 34.25 | 115.925 | 72.838 | 35.938 |
| 2016-03-224:28:23 PM | 34.25 | 115.925 | 72.95 | 36.05 |
| 2016-03-224:28:29 PM | 34.25 | 115.925 | 72.95 | 36.162 |
| 2016-03-224:28:36 PM | 34.25 | 115.925 | 72.838 | 36.162 |
| 2016-03-224:28:42 PM | 34.25 | 115.925 | 72.838 | 36.275 |
| 2016-03-224:28:48 PM | 34.25 | 115.925 | 72.838 | 36.162 |
| 2016-03-224:28:54 PM | 34.25 | 115.925 | 72.838 | 36.162 |
| 2016-03-224:29:00 PM | 34.25 | 115.925 | 72.838 | 36.162 |
| 2016-03-224:29:07 PM | 34.25 | 115.925 | 72.838 | 36.275 |
| 2016-03-224:29:13 PM | 34.25 | 115.925 | 72.838 | 36.388 |
| 2016-03-224:29:19 PM | 34.25 | 115.812 | 72.838 | 36.388 |
| 2016-03-224:29:25 PM | 34.25 | 115.812 | 72.725 | 36.275 |
| 2016-03-224:29:32 PM | 34.138 | 115.812 | 72.725 | 36.05 |
| 2016-03-224:29:38 PM | 34.25 | 115.812 | 72.725 | 35.938 |
| 2016-03-224:29:44 PM | 34.138 | 115.812 | 72.725 | 35.825 |
| 2016-03-224:29:50 PM | 34.138 | 115.812 | 72.725 | 35.825 |
| 2016-03-224:29:56 PM | 34.138 | 115.7 | 72.725 | 35.938 |
| 2016-03-224:30:03 PM | 34.25 | 115.7 | 72.725 | 36.05 |
| 2016-03-224:30:14 PM | 34.138 | 115.7 | 72.725 | 35.938 |
| 2016-03-224:30:20 PM | 34.138 | 115.7 | 72.725 | 35.825 |
| 2016-03-224:30:26 PM | 34.25 | 115.7 | 72.725 | 35.712 |
| 2016-03-224:30:32 PM | 34.138 | 115.7 | 72.725 | 35.712 |
| 2016-03-224:30:38 PM | 34.138 | 115.7 | 72.725 | 35.6 |
| 2016-03-224:30:45 PM | 34.25 | 115.588 | 72.612 | 35.6 |
| 2016-03-224:30:51 PM | 34.25 | 115.588 | 72.612 | 35.6 |
| 2016-03-224:30:57 PM | 34.25 | 115.475 | 72.612 | 35.712 |
| 2016-03-224:31:03 PM | 34.138 | 115.475 | 72.612 | 35.712 |
| 2016-03-224:31:10 PM | 34.25 | 115.475 | 72.612 | 35.488 |
| 2016-03-224:31:16 PM | 34.25 | 115.362 | 72.612 | 35.712 |
| 2016-03-224:31:22 PM | 34.25 | 115.362 | 72.612 | 35.712 |
| 2016-03-224:31:28 PM | 34.25 | 115.25 | 72.5 | 35.712 |
| 2016-03-224:31:34 PM | 34.25 | 115.25 | 72.612 | 35.938 |
| 2016-03-224:31:41 PM | 34.25 | 115.138 | 72.612 | 35.825 |
| 2016-03-224:31:47 PM | 34.25 | 115.138 | 72.612 | 35.825 |
| 2016-03-224:31:53 PM | 34.25 | 115.138 | 72.5 | 35.825 |
| 2016-03-224:31:59 PM | 34.25 | 115.025 | 72.612 | 35.825 |
| 2016-03-224:32:06 PM | 34.25 | 114.913 | 72.612 | 35.938 |
| 2016-03-224:32:12 PM | 34.362 | 114.8 | 72.612 | 35.938 |
| 2016-03-224:32:18 PM | 34.362 | 114.688 | 72.612 | 36.162 |
| 2016-03-224:32:24 PM | 34.362 | 114.688 | 72.612 | 36.275 |
| 2016-03-224:32:30 PM | 34.362 | 114.575 | 72.612 | 36.275 |
| 2016-03-224:32:37 PM | 34.25 | 114.575 | 72.612 | 36.388 |
| 2016-03-224:32:43 PM | 34.362 | 114.462 | 72.612 | 36.612 |
| 2016-03-224:32:49 PM | 34.362 | 114.462 | 72.612 | 36.5 |
| 2016-03-224:32:55 PM | 34.362 | 114.35 | 72.5 | 36.388 |
| 2016-03-224:33:02 PM | 34.362 | 114.35 | 72.5 | 36.388 |
| 2016-03-224:33:08 PM | 34.362 | 114.238 | 72.5 | 36.388 |
| 2016-03-224:33:14 PM | 34.362 | 114.238 | 72.5 | 36.388 |
| 2016-03-224:33:20 PM | 34.362 | 114.238 | 72.5 | 36.5 |
| 2016-03-224:33:26 PM | 34.362 | 114.125 | 72.5 | 36.388 |
| 2016-03-224:33:33 PM | 34.362 | 114.125 | 72.5 | 36.388 |
| 2016-03-224:33:39 PM | 34.362 | 114.125 | 72.5 | 36.388 |
| 2016-03-224:33:45 PM | 34.362 | 114.125 | 72.5 | 36.275 |
| 2016-03-224:33:51 PM | 34.362 | 114.012 | 72.5 | 36.162 |
| 2016-03-224:33:57 PM | 34.362 | 114.012 | 72.5 | 36.275 |
| 2016-03-224:34:04 PM | 34.362 | 114.012 | 72.5 | 36.5 |
| 2016-03-224:34:10 PM | 34.362 | 114.012 | 72.5 | 36.612 |
| 2016-03-224:34:16 PM | 34.362 | 114.012 | 72.5 | 36.725 |
| 2016-03-224:34:22 PM | 34.362 | 114.012 | 72.388 | 36.838 |
| 2016-03-224:34:29 PM | 34.362 | 114.012 | 72.388 | 36.95 |
| 2016-03-224:34:35 PM | 34.362 | 113.9 | 72.388 | 36.838 |
| 2016-03-224:34:41 PM | 34.475 | 113.9 | 72.388 | 36.838 |
| 2016-03-224:34:47 PM | 34.475 | 113.9 | 72.388 | 36.725 |
| 2016-03-224:34:54 PM | 34.475 | 113.9 | 72.388 | 36.838 |
| 2016-03-224:35:00 PM | 34.475 | 113.788 | 72.275 | 36.838 |
| 2016-03-224:35:06 PM | 34.475 | 113.788 | 72.388 | 36.838 |
| 2016-03-224:35:12 PM | 34.362 | 113.788 | 72.275 | 36.838 |
| 2016-03-224:35:18 PM | 34.475 | 113.788 | 72.275 | 36.725 |
| 2016-03-224:35:25 PM | 34.362 | 113.788 | 72.275 | 36.725 |
| 2016-03-224:35:31 PM | 34.362 | 113.675 | 72.275 | 36.612 |
| 2016-03-224:35:37 PM | 34.362 | 113.675 | 72.275 | 36.5 |
| 2016-03-224:35:43 PM | 34.475 | 113.675 | 72.275 | 36.388 |
| 2016-03-224:35:49 PM | 34.362 | 113.675 | 72.275 | 36.275 |
| 2016-03-224:35:56 PM | 34.362 | 113.562 | 72.275 | 36.388 |
| 2016-03-224:36:02 PM | 34.475 | 113.675 | 72.275 | 36.388 |
| 2016-03-224:36:08 PM | 34.362 | 113.675 | 72.275 | 36.5 |
| 2016-03-224:36:14 PM | 34.475 | 113.562 | 72.275 | 36.388 |
| 2016-03-224:36:21 PM | 34.362 | 113.562 | 72.275 | 36.388 |
| 2016-03-224:36:27 PM | 34.362 | 113.562 | 72.275 | 36.5 |
| 2016-03-224:36:33 PM | 34.362 | 113.562 | 72.275 | 36.388 |
| 2016-03-224:36:39 PM | 34.475 | 113.562 | 72.275 | 36.388 |
| 2016-03-224:36:45 PM | 34.475 | 113.45 | 72.162 | 36.388 |
| 2016-03-224:36:52 PM | 34.362 | 113.562 | 72.275 | 36.388 |
| 2016-03-224:36:58 PM | 34.475 | 113.45 | 72.275 | 36.162 |
| 2016-03-224:37:04 PM | 34.362 | 113.45 | 72.162 | 36.162 |
| 2016-03-224:37:10 PM | 34.362 | 113.45 | 72.275 | 36.05 |
| 2016-03-224:37:16 PM | 34.362 | 113.45 | 72.275 | 36.05 |
| 2016-03-224:37:23 PM | 34.362 | 113.45 | 72.275 | 36.162 |
| 2016-03-224:37:29 PM | 34.362 | 113.338 | 72.275 | 36.275 |
| 2016-03-224:37:35 PM | 34.362 | 113.338 | 72.275 | 36.388 |
| 2016-03-224:37:41 PM | 34.362 | 113.338 | 72.162 | 36.5 |
| 2016-03-224:37:47 PM | 34.362 | 113.338 | 72.275 | 36.275 |
| 2016-03-224:37:54 PM | 34.362 | 113.338 | 72.275 | 36.388 |
| 2016-03-224:38:00 PM | 34.362 | 113.338 | 72.275 | 36.5 |
| 2016-03-224:38:06 PM | 34.362 | 113.225 | 72.275 | 36.388 |
| 2016-03-224:38:12 PM | 34.362 | 113.225 | 72.275 | 36.5 |
| 2016-03-224:38:19 PM | 34.25 | 113.225 | 72.275 | 36.388 |
| 2016-03-224:38:25 PM | 34.25 | 113.112 | 72.275 | 36.275 |
| 2016-03-224:38:31 PM | 34.25 | 113.112 | 72.275 | 36.05 |
| 2016-03-224:38:37 PM | 34.362 | 113.112 | 72.275 | 35.825 |
| 2016-03-224:38:44 PM | 34.25 | 113.112 | 72.275 | 35.6 |
| 2016-03-224:38:50 PM | 34.25 | 113 | 72.275 | 35.6 |
| 2016-03-224:38:56 PM | 34.25 | 113 | 72.388 | 35.712 |
| 2016-03-224:39:02 PM | 34.25 | 113 | 72.388 | 35.6 |
| 2016-03-224:39:08 PM | 34.25 | 112.888 | 72.388 | 35.488 |
| 2016-03-224:39:15 PM | 34.25 | 112.888 | 72.388 | 35.262 |
| 2016-03-224:39:21 PM | 34.25 | 112.888 | 72.388 | 35.15 |
| 2016-03-224:39:27 PM | 34.25 | 112.775 | 72.388 | 35.15 |
| 2016-03-224:39:33 PM | 34.25 | 112.775 | 72.388 | 35.15 |
| 2016-03-224:39:39 PM | 34.25 | 112.663 | 72.388 | 35.038 |
| 2016-03-224:39:46 PM | 34.25 | 112.663 | 72.388 | 34.925 |
| 2016-03-224:39:52 PM | 34.25 | 112.663 | 72.388 | 34.925 |
| 2016-03-224:39:58 PM | 34.25 | 112.55 | 72.388 | 34.925 |
| 2016-03-224:40:04 PM | 34.25 | 112.55 | 72.388 | 34.925 |
| 2016-03-224:40:10 PM | 34.25 | 112.438 | 72.388 | 35.038 |
| 2016-03-224:40:17 PM | 34.25 | 112.325 | 72.388 | 35.038 |
| 2016-03-224:40:23 PM | 34.25 | 112.325 | 72.275 | 35.15 |
| 2016-03-224:40:29 PM | 34.25 | 112.212 | 72.275 | 35.15 |
| 2016-03-224:40:41 PM | 34.25 | 112.1 | 72.275 | 35.262 |
| 2016-03-224:40:47 PM | 34.25 | 112.1 | 72.275 | 35.15 |
| 2016-03-224:40:53 PM | 34.25 | 111.988 | 72.275 | 35.262 |
| 2016-03-224:41:00 PM | 34.25 | 111.875 | 72.275 | 35.375 |
| 2016-03-224:41:06 PM | 34.25 | 111.875 | 72.275 | 35.375 |
| 2016-03-224:41:12 PM | 34.25 | 111.762 | 72.275 | 35.488 |
| 2016-03-224:41:18 PM | 34.138 | 111.762 | 72.275 | 35.488 |
| 2016-03-224:41:25 PM | 34.138 | 111.538 | 72.162 | 35.488 |
| 2016-03-224:41:31 PM | 34.138 | 111.538 | 72.162 | 35.488 |
| 2016-03-224:41:37 PM | 34.138 | 111.538 | 72.162 | 35.375 |
| 2016-03-224:41:43 PM | 34.138 | 111.425 | 72.162 | 35.375 |
| 2016-03-224:41:49 PM | 34.138 | 111.312 | 72.162 | 35.375 |
| 2016-03-224:41:56 PM | 34.138 | 111.312 | 72.162 | 35.262 |
| 2016-03-224:42:02 PM | 34.138 | 111.2 | 72.162 | 35.038 |
| 2016-03-224:42:08 PM | 34.138 | 111.2 | 72.162 | 35.038 |
| 2016-03-224:42:14 PM | 34.138 | 111.088 | 72.162 | 34.925 |
| 2016-03-224:42:20 PM | 34.138 | 111.088 | 72.162 | 34.925 |
| 2016-03-224:42:26 PM | 34.138 | 110.975 | 72.162 | 34.812 |
| 2016-03-224:42:33 PM | 34.138 | 110.862 | 72.162 | 34.812 |
| 2016-03-224:42:39 PM | 34.138 | 110.862 | 72.162 | 34.812 |
| 2016-03-224:42:45 PM | 34.138 | 110.862 | 72.162 | 34.812 |
| 2016-03-224:42:51 PM | 34.138 | 110.75 | 72.162 | 34.812 |
| 2016-03-224:42:57 PM | 34.138 | 110.75 | 72.162 | 34.7 |
| 2016-03-224:43:04 PM | 34.138 | 110.638 | 72.162 | 34.7 |
| 2016-03-224:43:10 PM | 34.138 | 110.525 | 72.162 | 34.475 |
| 2016-03-224:43:16 PM | 34.138 | 110.525 | 72.162 | 34.475 |
| 2016-03-224:43:22 PM | 34.138 | 110.413 | 72.162 | 34.475 |
| 2016-03-224:43:29 PM | 34.138 | 110.413 | 72.162 | 34.475 |
| 2016-03-224:43:35 PM | 34.138 | 110.3 | 72.162 | 34.362 |
| 2016-03-224:43:41 PM | 34.138 | 110.3 | 72.162 | 34.475 |
| 2016-03-224:43:47 PM | 34.138 | 110.075 | 72.162 | 34.475 |
| 2016-03-224:43:53 PM | 34.138 | 110.075 | 72.162 | 34.588 |
| 2016-03-224:44:00 PM | 34.25 | 109.962 | 72.162 | 34.588 |
| 2016-03-224:44:06 PM | 34.138 | 109.962 | 72.162 | 34.588 |
| 2016-03-224:44:12 PM | 34.25 | 109.85 | 72.05 | 34.7 |
| 2016-03-224:44:18 PM | 34.138 | 109.85 | 72.05 | 34.812 |
| 2016-03-224:44:24 PM | 34.138 | 109.738 | 72.05 | 34.812 |
| 2016-03-224:44:31 PM | 34.138 | 109.625 | 72.05 | 34.925 |
| 2016-03-224:44:37 PM | 34.138 | 109.512 | 72.05 | 34.925 |
| 2016-03-224:44:43 PM | 34.138 | 109.4 | 72.05 | 35.038 |
| 2016-03-224:44:49 PM | 34.138 | 109.4 | 72.05 | 35.15 |
| 2016-03-224:44:55 PM | 34.138 | 109.288 | 72.05 | 35.262 |
| 2016-03-224:45:02 PM | 34.138 | 109.175 | 72.05 | 35.15 |
| 2016-03-224:45:08 PM | 34.138 | 109.062 | 72.05 | 35.15 |
| 2016-03-224:45:14 PM | 34.138 | 109.062 | 72.162 | 35.038 |
| 2016-03-224:45:20 PM | 34.138 | 108.95 | 72.162 | 34.925 |
| 2016-03-224:45:26 PM | 34.138 | 108.838 | 72.162 | 34.812 |
| 2016-03-224:45:33 PM | 34.138 | 108.838 | 72.162 | 34.812 |
| 2016-03-224:45:39 PM | 34.138 | 108.838 | 72.162 | 34.812 |
| 2016-03-224:45:45 PM | 34.138 | 108.725 | 72.162 | 34.812 |
| 2016-03-224:45:51 PM | 34.138 | 108.612 | 72.162 | 34.7 |
| 2016-03-224:45:58 PM | 34.138 | 108.612 | 72.162 | 34.588 |
| 2016-03-224:46:04 PM | 34.025 | 108.5 | 72.162 | 34.7 |
| 2016-03-224:46:10 PM | 34.025 | 108.5 | 72.162 | 34.812 |
| 2016-03-224:46:16 PM | 34.025 | 108.388 | 72.05 | 34.812 |
| 2016-03-224:46:22 PM | 34.025 | 108.388 | 72.162 | 34.925 |
| 2016-03-224:46:29 PM | 34.025 | 108.275 | 72.162 | 34.925 |
| 2016-03-224:46:35 PM | 34.138 | 108.275 | 72.162 | 34.925 |
| 2016-03-224:46:41 PM | 34.025 | 108.163 | 72.05 | 35.038 |
| 2016-03-224:46:47 PM | 34.025 | 108.163 | 72.162 | 35.038 |
| 2016-03-224:46:53 PM | 34.025 | 108.05 | 72.05 | 35.038 |
| 2016-03-224:47:00 PM | 34.025 | 107.938 | 72.05 | 34.925 |
| 2016-03-224:47:06 PM | 34.025 | 107.938 | 72.162 | 34.925 |
| 2016-03-224:47:12 PM | 34.138 | 107.825 | 72.05 | 34.925 |
| 2016-03-224:47:18 PM | 34.138 | 107.712 | 72.05 | 34.925 |
| 2016-03-224:47:25 PM | 34.025 | 107.6 | 72.05 | 34.925 |
| 2016-03-224:47:31 PM | 34.025 | 107.6 | 72.05 | 35.038 |
| 2016-03-224:47:37 PM | 34.138 | 107.488 | 72.05 | 35.15 |
| 2016-03-224:47:43 PM | 34.138 | 107.488 | 72.05 | 35.262 |
| 2016-03-224:47:49 PM | 34.138 | 107.488 | 72.05 | 35.262 |
| 2016-03-224:47:56 PM | 34.138 | 107.375 | 72.05 | 35.262 |
| 2016-03-224:48:02 PM | 34.138 | 107.375 | 72.05 | 35.262 |
| 2016-03-224:48:08 PM | 34.138 | 107.262 | 72.05 | 35.262 |
| 2016-03-224:48:14 PM | 34.138 | 107.15 | 72.05 | 35.375 |
| 2016-03-224:48:20 PM | 34.138 | 107.15 | 72.05 | 35.375 |
| 2016-03-224:48:27 PM | 34.138 | 107.038 | 72.05 | 35.488 |
| 2016-03-224:48:33 PM | 34.25 | 107.038 | 72.05 | 35.6 |
| 2016-03-224:48:39 PM | 34.25 | 106.812 | 72.05 | 35.6 |
| 2016-03-224:48:45 PM | 34.25 | 106.812 | 72.05 | 35.488 |
| 2016-03-224:48:52 PM | 34.25 | 106.7 | 72.05 | 35.375 |
| 2016-03-224:48:58 PM | 34.25 | 106.7 | 72.05 | 35.488 |
| 2016-03-224:49:04 PM | 34.25 | 106.588 | 72.05 | 35.6 |
| 2016-03-224:49:10 PM | 34.25 | 106.475 | 72.05 | 35.488 |
| 2016-03-224:49:17 PM | 34.25 | 106.475 | 71.938 | 35.375 |
| 2016-03-224:49:23 PM | 34.362 | 106.362 | 72.05 | 35.262 |
| 2016-03-224:49:29 PM | 34.362 | 106.362 | 72.05 | 35.15 |
| 2016-03-224:49:35 PM | 34.25 | 106.25 | 71.938 | 35.038 |
| 2016-03-224:49:41 PM | 34.25 | 106.138 | 71.938 | 35.15 |
| 2016-03-224:49:48 PM | 34.25 | 106.138 | 71.938 | 35.262 |
| 2016-03-224:49:54 PM | 34.25 | 106.025 | 71.938 | 35.375 |
| 2016-03-224:50:00 PM | 34.25 | 106.025 | 71.938 | 35.488 |
| 2016-03-224:50:06 PM | 34.25 | 105.913 | 71.938 | 35.6 |
| 2016-03-224:50:13 PM | 34.25 | 105.913 | 71.938 | 35.375 |
| 2016-03-224:50:19 PM | 34.25 | 105.8 | 71.938 | 35.262 |
| 2016-03-224:50:25 PM | 34.25 | 105.8 | 71.938 | 35.15 |
| 2016-03-224:50:31 PM | 34.25 | 105.8 | 71.825 | 35.15 |
| 2016-03-224:50:37 PM | 34.25 | 105.688 | 71.825 | 35.038 |
| 2016-03-224:50:44 PM | 34.25 | 105.688 | 71.825 | 35.038 |
| 2016-03-224:50:50 PM | 34.25 | 105.575 | 71.825 | 34.925 |
| 2016-03-224:50:56 PM | 34.362 | 105.575 | 71.825 | 34.925 |
| 2016-03-224:51:02 PM | 34.25 | 105.575 | 71.825 | 34.812 |
| 2016-03-224:51:08 PM | 34.25 | 105.575 | 71.825 | 34.812 |
| 2016-03-224:51:15 PM | 34.25 | 105.462 | 71.825 | 34.925 |
| 2016-03-224:51:21 PM | 34.362 | 105.462 | 71.825 | 35.038 |
| 2016-03-224:51:27 PM | 34.25 | 105.462 | 71.825 | 35.15 |
| 2016-03-224:51:33 PM | 34.25 | 105.462 | 71.825 | 35.262 |
| 2016-03-224:51:40 PM | 34.25 | 105.35 | 71.825 | 35.262 |
| 2016-03-224:51:46 PM | 34.362 | 105.35 | 71.825 | 35.262 |
| 2016-03-224:51:52 PM | 34.25 | 105.35 | 71.825 | 35.262 |
| 2016-03-224:51:58 PM | 34.362 | 105.238 | 71.825 | 35.15 |
| 2016-03-224:52:04 PM | 34.362 | 105.238 | 71.712 | 35.262 |
| 2016-03-224:52:10 PM | 34.362 | 105.125 | 71.825 | 35.375 |
| 2016-03-224:52:15 PM | 34.362 | 105.125 | 71.825 | 35.375 |
| 2016-03-224:52:22 PM | 34.362 | 105.012 | 71.712 | 35.262 |
| 2016-03-224:52:28 PM | 34.362 | 105.012 | 71.712 | 35.375 |
| 2016-03-224:52:34 PM | 34.362 | 105.012 | 71.712 | 35.262 |
| 2016-03-224:52:40 PM | 34.362 | 104.9 | 71.712 | 35.262 |
| 2016-03-224:52:46 PM | 34.362 | 104.788 | 71.712 | 35.262 |
| 2016-03-224:52:53 PM | 34.362 | 104.788 | 71.712 | 35.262 |
| 2016-03-224:52:59 PM | 34.362 | 104.675 | 71.712 | 35.375 |
| 2016-03-224:53:05 PM | 34.362 | 104.675 | 71.6 | 35.488 |
| 2016-03-224:53:11 PM | 34.362 | 104.675 | 71.6 | 35.6 |
| 2016-03-224:53:17 PM | 34.362 | 104.562 | 71.712 | 35.712 |
| 2016-03-224:53:24 PM | 34.362 | 104.562 | 71.712 | 35.712 |
| 2016-03-224:53:30 PM | 34.362 | 104.45 | 71.712 | 35.825 |
| 2016-03-224:53:36 PM | 34.475 | 104.45 | 71.712 | 35.825 |
| 2016-03-224:53:42 PM | 34.362 | 104.45 | 71.712 | 35.825 |
| 2016-03-224:53:49 PM | 34.362 | 104.338 | 71.712 | 35.825 |
| 2016-03-224:53:55 PM | 34.362 | 104.338 | 71.712 | 35.825 |
| 2016-03-224:54:01 PM | 34.475 | 104.338 | 71.712 | 35.825 |
| 2016-03-224:54:07 PM | 34.362 | 104.225 | 71.712 | 35.712 |
| 2016-03-224:54:13 PM | 34.475 | 104.225 | 71.712 | 35.6 |
| 2016-03-224:54:20 PM | 34.362 | 104.225 | 71.712 | 35.488 |
| 2016-03-224:54:26 PM | 34.362 | 104.112 | 71.712 | 35.375 |
| 2016-03-224:54:32 PM | 34.362 | 104.112 | 71.825 | 35.488 |
| 2016-03-224:54:38 PM | 34.362 | 104 | 71.825 | 35.488 |
| 2016-03-224:54:44 PM | 34.362 | 104 | 71.825 | 35.6 |
| 2016-03-224:54:51 PM | 34.362 | 104 | 71.825 | 35.6 |
| 2016-03-224:54:57 PM | 34.362 | 103.888 | 71.825 | 35.488 |
| 2016-03-224:55:03 PM | 34.362 | 103.888 | 71.825 | 35.375 |
| 2016-03-224:55:09 PM | 34.362 | 103.888 | 71.825 | 35.375 |
| 2016-03-224:55:15 PM | 34.25 | 103.775 | 71.825 | 35.262 |
| 2016-03-224:55:22 PM | 34.25 | 103.775 | 71.825 | 35.15 |
| 2016-03-224:55:28 PM | 34.25 | 103.775 | 71.825 | 35.15 |
| 2016-03-224:55:34 PM | 34.25 | 103.663 | 71.825 | 35.262 |
| 2016-03-224:55:40 PM | 34.25 | 103.663 | 71.825 | 35.15 |
| 2016-03-224:55:47 PM | 34.25 | 103.55 | 71.825 | 35.038 |
| 2016-03-224:55:53 PM | 34.25 | 103.55 | 71.825 | 34.925 |
| 2016-03-224:55:59 PM | 34.25 | 103.438 | 71.825 | 34.925 |
| 2016-03-224:56:05 PM | 34.25 | 103.438 | 71.825 | 35.038 |
| 2016-03-224:56:11 PM | 34.138 | 103.325 | 71.825 | 34.925 |
| 2016-03-224:56:18 PM | 34.25 | 103.325 | 71.712 | 34.925 |
| 2016-03-224:56:24 PM | 34.25 | 103.212 | 71.712 | 34.812 |
| 2016-03-224:56:30 PM | 34.25 | 103.212 | 71.712 | 34.7 |
| 2016-03-224:56:36 PM | 34.138 | 103.1 | 71.712 | 34.475 |
| 2016-03-224:56:42 PM | 34.138 | 102.988 | 71.712 | 34.475 |
| 2016-03-224:56:55 PM | 34.138 | 102.875 | 71.712 | 34.362 |
| 2016-03-224:57:01 PM | 34.25 | 102.875 | 71.712 | 34.362 |
| 2016-03-224:57:07 PM | 34.138 | 102.762 | 71.712 | 34.25 |
| 2016-03-224:57:13 PM | 34.138 | 102.65 | 71.712 | 34.362 |
| 2016-03-224:57:20 PM | 34.138 | 102.538 | 71.6 | 34.362 |
| 2016-03-224:57:26 PM | 34.138 | 102.425 | 71.6 | 34.362 |
| 2016-03-224:57:32 PM | 34.138 | 102.425 | 71.712 | 34.362 |
| 2016-03-224:57:38 PM | 34.138 | 102.2 | 71.712 | 34.362 |
| 2016-03-224:57:44 PM | 34.025 | 102.088 | 71.6 | 34.362 |
| 2016-03-224:57:51 PM | 34.025 | 101.975 | 71.6 | 34.25 |
| 2016-03-224:57:57 PM | 34.025 | 101.75 | 71.6 | 34.362 |
| 2016-03-224:58:03 PM | 34.025 | 101.638 | 71.6 | 34.362 |
| 2016-03-224:58:09 PM | 34.025 | 101.525 | 71.6 | 34.25 |
| 2016-03-224:58:15 PM | 34.025 | 101.3 | 71.6 | 34.362 |
| 2016-03-224:58:22 PM | 34.025 | 101.188 | 71.6 | 34.362 |
| 2016-03-224:58:28 PM | 34.025 | 100.962 | 71.6 | 34.25 |
| 2016-03-224:58:34 PM | 33.912 | 100.738 | 71.6 | 34.362 |
| 2016-03-224:58:40 PM | 34.025 | 100.625 | 71.712 | 34.25 |
| 2016-03-224:58:46 PM | 34.025 | 100.512 | 71.712 | 34.25 |
| 2016-03-224:58:53 PM | 33.912 | 100.288 | 71.6 | 34.138 |
| 2016-03-224:59:05 PM | 33.912 | 100.062 | 71.712 | 33.912 |
| 2016-03-224:59:11 PM | 33.912 | 99.95 | 71.712 | 33.8 |
| 2016-03-224:59:17 PM | 33.912 | 99.725 | 71.712 | 33.8 |
| 2016-03-224:59:24 PM | 33.912 | 99.5 | 71.712 | 33.575 |
| 2016-03-224:59:30 PM | 33.912 | 99.275 | 71.712 | 33.462 |
| 2016-03-224:59:36 PM | 33.912 | 99.05 | 71.712 | 33.462 |
| 2016-03-224:59:42 PM | 33.912 | 98.938 | 71.712 | 33.35 |
| 2016-03-224:59:48 PM | 33.912 | 98.712 | 71.712 | 33.35 |
| 2016-03-224:59:55 PM | 33.912 | 98.488 | 71.712 | 33.35 |
| 2016-03-225:00:01 PM | 33.912 | 98.375 | 71.6 | 33.35 |
| 2016-03-225:00:07 PM | 33.912 | 98.038 | 71.6 | 33.462 |
| 2016-03-225:00:13 PM | 33.912 | 97.925 | 71.6 | 33.462 |
| 2016-03-225:00:19 PM | 33.912 | 97.7 | 71.6 | 33.462 |
| 2016-03-225:00:26 PM | 33.912 | 97.588 | 71.6 | 33.35 |
| 2016-03-225:00:32 PM | 33.912 | 97.362 | 71.6 | 33.462 |
| 2016-03-225:00:38 PM | 33.912 | 97.138 | 71.712 | 33.462 |
| 2016-03-225:00:44 PM | 34.025 | 97.025 | 71.6 | 33.462 |
| 2016-03-225:00:50 PM | 33.912 | 96.8 | 71.6 | 33.462 |
| 2016-03-225:00:57 PM | 33.912 | 96.575 | 71.6 | 33.462 |
| 2016-03-225:01:03 PM | 33.912 | 96.35 | 71.6 | 33.462 |
| 2016-03-225:01:09 PM | 33.912 | 96.012 | 71.6 | 33.575 |
| 2016-03-225:01:15 PM | 33.912 | 95.675 | 71.488 | 33.575 |
| 2016-03-225:01:22 PM | 33.912 | 95.338 | 71.6 | 33.688 |
| 2016-03-225:01:28 PM | 33.912 | 95 | 71.6 | 33.688 |
| 2016-03-225:01:34 PM | 33.912 | 94.663 | 71.488 | 33.575 |
| 2016-03-225:01:40 PM | 33.912 | 94.438 | 71.6 | 33.688 |
| 2016-03-225:01:52 PM | 33.912 | 93.988 | 71.6 | 33.8 |
| 2016-03-225:01:58 PM | 33.912 | 93.65 | 71.6 | 33.688 |
| 2016-03-225:02:04 PM | 33.912 | 93.312 | 71.6 | 33.8 |
| 2016-03-225:02:10 PM | 33.912 | 92.975 | 71.6 | 33.688 |
| 2016-03-225:02:16 PM | 33.912 | 92.638 | 71.6 | 33.575 |
| 2016-03-225:02:23 PM | 33.912 | 92.413 | 71.6 | 33.575 |
| 2016-03-225:02:29 PM | 33.912 | 92.075 | 71.6 | 33.688 |
| 2016-03-225:02:35 PM | 33.912 | 91.738 | 71.6 | 33.688 |
| 2016-03-225:02:41 PM | 33.912 | 91.4 | 71.6 | 33.688 |
| 2016-03-225:02:47 PM | 33.912 | 91.062 | 71.6 | 33.8 |
| 2016-03-225:02:54 PM | 33.912 | 90.838 | 71.6 | 33.8 |
| 2016-03-225:03:00 PM | 33.912 | 90.5 | 71.6 | 33.688 |
| 2016-03-225:03:06 PM | 33.912 | 90.163 | 71.6 | 33.575 |
| 2016-03-225:03:12 PM | 33.912 | 89.825 | 71.6 | 33.575 |
| 2016-03-225:03:19 PM | 34.025 | 89.6 | 71.488 | 33.688 |
| 2016-03-225:03:25 PM | 34.025 | 89.375 | 71.488 | 33.688 |
| 2016-03-225:03:31 PM | 34.025 | 89.038 | 71.488 | 33.688 |
| 2016-03-225:03:37 PM | 34.025 | 88.7 | 71.488 | 33.688 |
| 2016-03-225:03:43 PM | 34.025 | 88.475 | 71.6 | 33.8 |
| 2016-03-225:03:50 PM | 34.025 | 88.25 | 71.488 | 33.912 |
| 2016-03-225:03:56 PM | 34.025 | 87.912 | 71.6 | 33.8 |
| 2016-03-225:04:02 PM | 34.025 | 87.688 | 71.6 | 33.8 |
| 2016-03-225:04:08 PM | 34.025 | 87.35 | 71.488 | 33.912 |
| 2016-03-225:04:14 PM | 34.025 | 87.125 | 71.488 | 33.912 |
| 2016-03-225:04:21 PM | 34.025 | 86.788 | 71.6 | 34.025 |
| 2016-03-225:04:27 PM | 34.138 | 86.45 | 71.488 | 33.912 |
| 2016-03-225:04:33 PM | 34.025 | 86.225 | 71.6 | 34.025 |
| 2016-03-225:04:39 PM | 34.138 | 85.888 | 71.488 | 34.138 |
| 2016-03-225:04:45 PM | 34.138 | 85.662 | 71.488 | 34.25 |
| 2016-03-225:04:52 PM | 34.138 | 85.325 | 71.488 | 34.25 |
| 2016-03-225:04:58 PM | 34.025 | 85.1 | 71.488 | 34.25 |
| 2016-03-225:05:04 PM | 34.138 | 84.762 | 71.488 | 34.362 |
| 2016-03-225:05:10 PM | 34.138 | 84.538 | 71.488 | 34.25 |
| 2016-03-225:05:17 PM | 34.138 | 84.312 | 71.375 | 34.362 |
| 2016-03-225:05:23 PM | 34.138 | 84.088 | 71.375 | 34.362 |
| 2016-03-225:05:29 PM | 34.138 | 83.862 | 71.375 | 34.25 |
| 2016-03-225:05:35 PM | 34.138 | 83.638 | 71.375 | 34.138 |
| 2016-03-225:05:41 PM | 34.138 | 83.412 | 71.375 | 34.25 |
| 2016-03-225:05:48 PM | 34.138 | 83.188 | 71.375 | 34.25 |
| 2016-03-225:05:54 PM | 34.138 | 82.962 | 71.375 | 34.362 |
| 2016-03-225:06:00 PM | 34.138 | 82.738 | 71.262 | 34.362 |
| 2016-03-225:06:07 PM | 34.138 | 82.512 | 71.262 | 34.25 |
| 2016-03-225:06:13 PM | 34.25 | 82.288 | 71.262 | 34.138 |
| 2016-03-225:06:19 PM | 34.25 | 82.175 | 71.262 | 34.025 |
| 2016-03-225:06:26 PM | 34.138 | 81.95 | 71.262 | 34.025 |
| 2016-03-225:06:32 PM | 34.25 | 81.838 | 71.262 | 34.138 |
| 2016-03-225:06:38 PM | 34.25 | 81.612 | 71.262 | 34.138 |
| 2016-03-225:06:44 PM | 34.25 | 81.388 | 71.262 | 34.025 |
| 2016-03-225:06:50 PM | 34.25 | 81.275 | 71.15 | 34.025 |
| 2016-03-225:06:57 PM | 34.25 | 81.162 | 71.15 | 34.138 |
| 2016-03-225:07:03 PM | 34.25 | 81.05 | 71.15 | 34.138 |
| 2016-03-225:07:09 PM | 34.25 | 80.825 | 71.15 | 34.138 |
| 2016-03-225:07:15 PM | 34.25 | 80.712 | 71.15 | 34.025 |
| 2016-03-225:07:22 PM | 34.25 | 80.6 | 71.15 | 34.138 |
| 2016-03-225:07:28 PM | 34.25 | 80.488 | 71.038 | 34.138 |
| 2016-03-225:07:34 PM | 34.25 | 80.262 | 71.15 | 34.138 |
| 2016-03-225:07:40 PM | 34.138 | 80.262 | 71.15 | 34.25 |
| 2016-03-225:07:46 PM | 34.138 | 80.038 | 71.038 | 34.25 |
| 2016-03-225:07:53 PM | 34.138 | 80.038 | 71.038 | 34.25 |
| 2016-03-225:07:59 PM | 34.138 | 79.925 | 71.038 | 34.25 |
| 2016-03-225:08:05 PM | 34.138 | 79.812 | 71.038 | 34.25 |
| 2016-03-225:08:11 PM | 34.138 | 79.7 | 71.038 | 34.25 |
| 2016-03-225:08:18 PM | 34.138 | 79.588 | 71.038 | 34.138 |
| 2016-03-225:08:24 PM | 34.138 | 79.475 | 71.038 | 34.25 |
| 2016-03-225:08:30 PM | 34.025 | 79.362 | 71.038 | 34.138 |
| 2016-03-225:08:36 PM | 34.025 | 79.25 | 71.038 | 34.138 |
| 2016-03-225:08:42 PM | 34.025 | 79.25 | 71.038 | 34.138 |
| 2016-03-225:08:49 PM | 34.025 | 79.138 | 71.15 | 34.025 |
| 2016-03-225:08:55 PM | 34.025 | 79.025 | 71.038 | 34.025 |
| 2016-03-225:09:01 PM | 34.025 | 78.912 | 71.038 | 33.912 |
| 2016-03-225:09:07 PM | 34.025 | 78.8 | 71.038 | 33.912 |
| 2016-03-225:09:13 PM | 34.025 | 78.688 | 70.925 | 33.912 |
| 2016-03-225:09:20 PM | 34.025 | 78.575 | 70.925 | 33.912 |
| 2016-03-225:09:26 PM | 33.912 | 78.462 | 70.925 | 33.688 |
| 2016-03-225:09:32 PM | 33.912 | 78.462 | 70.925 | 33.575 |
| 2016-03-225:09:38 PM | 33.912 | 78.35 | 70.925 | 33.688 |
| 2016-03-225:09:45 PM | 33.912 | 78.238 | 70.925 | 33.688 |
| 2016-03-225:09:51 PM | 34.025 | 78.125 | 70.925 | 33.8 |
| 2016-03-225:09:57 PM | 34.025 | 78.125 | 70.925 | 33.8 |
| 2016-03-225:10:03 PM | 34.025 | 78.012 | 70.925 | 33.688 |
| 2016-03-225:10:09 PM | 34.025 | 77.9 | 70.925 | 33.688 |
| 2016-03-225:10:16 PM | 33.912 | 77.788 | 70.925 | 33.688 |
| 2016-03-225:10:22 PM | 33.912 | 77.675 | 70.925 | 33.688 |
| 2016-03-225:10:28 PM | 34.025 | 77.562 | 70.925 | 33.575 |
| 2016-03-225:10:34 PM | 34.025 | 77.45 | 70.925 | 33.575 |
| 2016-03-225:10:40 PM | 33.912 | 77.338 | 70.925 | 33.462 |
| 2016-03-225:10:47 PM | 33.912 | 77.225 | 70.925 | 33.462 |
| 2016-03-225:10:53 PM | 34.025 | 77.112 | 70.925 | 33.462 |
| 2016-03-225:10:59 PM | 34.025 | 77 | 70.925 | 33.35 |
| 2016-03-225:11:05 PM | 34.025 | 76.888 | 70.925 | 33.35 |
| 2016-03-225:11:11 PM | 34.025 | 76.775 | 70.925 | 33.238 |
| 2016-03-225:11:18 PM | 34.025 | 76.662 | 70.925 | 33.238 |
| 2016-03-225:11:24 PM | 34.025 | 76.55 | 70.925 | 33.35 |
| 2016-03-225:11:30 PM | 34.025 | 76.438 | 70.925 | 33.35 |
| 2016-03-225:11:36 PM | 34.025 | 76.325 | 70.925 | 33.35 |
| 2016-03-225:11:43 PM | 34.025 | 76.212 | 70.925 | 33.35 |
| 2016-03-225:11:49 PM | 34.025 | 75.988 | 70.925 | 33.462 |
| 2016-03-225:11:55 PM | 34.138 | 75.988 | 70.925 | 33.462 |
| 2016-03-225:12:01 PM | 34.138 | 75.875 | 70.812 | 33.462 |
| 2016-03-225:12:07 PM | 34.025 | 75.762 | 70.925 | 33.462 |
| 2016-03-225:12:14 PM | 34.138 | 75.65 | 70.812 | 33.575 |
| 2016-03-225:12:20 PM | 34.138 | 75.538 | 70.812 | 33.688 |
| 2016-03-225:12:26 PM | 34.138 | 75.425 | 70.812 | 33.8 |
| 2016-03-225:12:32 PM | 34.138 | 75.312 | 70.812 | 33.8 |
| 2016-03-225:12:39 PM | 34.138 | 75.2 | 70.812 | 33.688 |
| 2016-03-225:12:45 PM | 34.138 | 75.088 | 70.812 | 33.688 |
| 2016-03-225:12:50 PM | 34.138 | 74.975 | 70.812 | 33.8 |
| 2016-03-225:12:57 PM | 34.138 | 74.862 | 70.812 | 33.8 |
| 2016-03-225:13:03 PM | 34.138 | 74.75 | 70.812 | 33.912 |
| 2016-03-225:13:09 PM | 34.138 | 74.638 | 70.812 | 33.8 |
| 2016-03-225:13:15 PM | 34.138 | 74.638 | 70.812 | 33.912 |
| 2016-03-225:13:22 PM | 34.138 | 74.525 | 70.812 | 33.912 |
| 2016-03-225:13:28 PM | 34.138 | 74.3 | 70.812 | 33.912 |
| 2016-03-225:13:34 PM | 34.138 | 74.188 | 70.812 | 33.912 |
| 2016-03-225:13:40 PM | 34.25 | 74.075 | 70.812 | 33.912 |
| 2016-03-225:13:46 PM | 34.25 | 74.075 | 70.812 | 33.912 |
| 2016-03-225:13:53 PM | 34.25 | 73.962 | 70.812 | 33.912 |
| 2016-03-225:13:59 PM | 34.25 | 73.85 | 70.7 | 34.025 |
| 2016-03-225:14:05 PM | 34.25 | 73.738 | 70.812 | 34.025 |
| 2016-03-225:14:11 PM | 34.25 | 73.625 | 70.812 | 34.138 |
| 2016-03-225:14:17 PM | 34.25 | 73.512 | 70.812 | 34.138 |
| 2016-03-225:14:24 PM | 34.25 | 73.4 | 70.7 | 34.138 |
| 2016-03-225:14:30 PM | 34.25 | 73.4 | 70.812 | 34.025 |
| 2016-03-225:14:36 PM | 34.25 | 73.288 | 70.7 | 34.025 |
| 2016-03-225:14:42 PM | 34.25 | 73.175 | 70.7 | 34.025 |
| 2016-03-225:14:49 PM | 34.25 | 73.062 | 70.7 | 34.138 |
| 2016-03-225:14:55 PM | 34.25 | 72.95 | 70.7 | 34.25 |
| 2016-03-225:15:01 PM | 34.25 | 72.838 | 70.7 | 34.25 |
| 2016-03-225:15:13 PM | 34.25 | 72.725 | 70.7 | 34.362 |
| 2016-03-225:15:20 PM | 34.138 | 72.612 | 70.7 | 34.362 |
| 2016-03-225:15:26 PM | 34.25 | 72.612 | 70.7 | 34.25 |
| 2016-03-225:15:32 PM | 34.138 | 72.5 | 70.7 | 34.138 |
| 2016-03-225:15:38 PM | 34.25 | 72.388 | 70.7 | 34.138 |
| 2016-03-225:15:50 PM | 34.138 | 72.388 | 70.7 | 34.025 |
| 2016-03-225:15:56 PM | 34.138 | 72.275 | 70.588 | 33.912 |
| 2016-03-225:16:02 PM | 34.138 | 72.162 | 70.588 | 33.8 |
| 2016-03-225:16:08 PM | 34.138 | 72.162 | 70.588 | 33.912 |
| 2016-03-225:16:14 PM | 34.138 | 72.05 | 70.588 | 33.912 |
| 2016-03-225:16:21 PM | 34.138 | 71.938 | 70.588 | 33.912 |
| 2016-03-225:16:27 PM | 34.138 | 71.938 | 70.588 | 33.8 |
| 2016-03-225:16:33 PM | 34.138 | 71.825 | 70.588 | 33.8 |
| 2016-03-225:16:39 PM | 34.025 | 71.712 | 70.588 | 33.8 |
| 2016-03-225:16:52 PM | 34.138 | 71.712 | 70.588 | 33.8 |
| 2016-03-225:16:58 PM | 34.138 | 71.712 | 70.588 | 33.8 |
| 2016-03-225:17:04 PM | 34.025 | 71.6 | 70.588 | 33.912 |
| 2016-03-225:17:10 PM | 34.025 | 71.488 | 70.588 | 33.912 |
| 2016-03-225:17:17 PM | 34.025 | 71.488 | 70.588 | 33.912 |
| 2016-03-225:17:23 PM | 34.025 | 71.262 | 70.475 | 33.8 |
| 2016-03-225:17:29 PM | 34.025 | 71.262 | 70.588 | 33.8 |
| 2016-03-225:17:35 PM | 33.912 | 71.15 | 70.475 | 33.8 |
| 2016-03-225:17:47 PM | 34.025 | 71.038 | 70.475 | 33.688 |
| 2016-03-225:17:53 PM | 34.025 | 71.038 | 70.475 | 33.688 |
| 2016-03-225:17:59 PM | 34.025 | 70.925 | 70.475 | 33.8 |
| 2016-03-225:18:05 PM | 34.025 | 70.812 | 70.475 | 33.688 |
| 2016-03-225:18:12 PM | 34.025 | 70.7 | 70.475 | 33.688 |
| 2016-03-225:18:18 PM | 34.025 | 70.588 | 70.475 | 33.575 |
| 2016-03-225:18:23 PM | 34.025 | 70.475 | 70.475 | 33.575 |
| 2016-03-225:18:35 PM | 34.025 | 70.475 | 70.475 | 33.575 |
| 2016-03-225:18:41 PM | 34.025 | 70.362 | 70.475 | 33.688 |
| 2016-03-225:18:47 PM | 34.138 | 70.25 | 70.475 | 33.688 |
| 2016-03-225:18:53 PM | 34.138 | 70.138 | 70.475 | 33.8 |
| 2016-03-225:19:00 PM | 34.025 | 70.025 | 70.475 | 33.8 |
| 2016-03-225:19:06 PM | 34.025 | 69.912 | 70.475 | 33.912 |
| 2016-03-225:19:12 PM | 34.138 | 69.8 | 70.475 | 33.912 |
| 2016-03-225:19:18 PM | 34.138 | 69.688 | 70.475 | 33.912 |
| 2016-03-225:19:25 PM | 34.025 | 69.575 | 70.475 | 34.025 |
| 2016-03-225:19:31 PM | 34.138 | 69.462 | 70.362 | 34.138 |
| 2016-03-225:19:37 PM | 34.138 | 69.35 | 70.475 | 34.138 |
| 2016-03-225:19:43 PM | 34.138 | 69.238 | 70.362 | 34.025 |
| 2016-03-225:19:49 PM | 34.138 | 69.125 | 70.362 | 34.025 |
| 2016-03-225:19:55 PM | 34.138 | 69.012 | 70.362 | 34.025 |
| 2016-03-225:20:02 PM | 34.138 | 68.9 | 70.362 | 34.025 |
| 2016-03-225:20:08 PM | 34.138 | 68.675 | 70.362 | 34.025 |
| 2016-03-225:20:14 PM | 34.138 | 68.675 | 70.362 | 33.912 |
| 2016-03-225:20:20 PM | 34.138 | 68.562 | 70.362 | 33.912 |
| 2016-03-225:20:26 PM | 34.138 | 68.338 | 70.362 | 33.8 |
| 2016-03-225:20:33 PM | 34.25 | 68.225 | 70.362 | 33.912 |
| 2016-03-225:20:39 PM | 34.138 | 68.112 | 70.362 | 33.8 |
| 2016-03-225:20:45 PM | 34.138 | 67.888 | 70.362 | 33.8 |
| 2016-03-225:20:51 PM | 34.138 | 67.888 | 70.362 | 33.688 |
| 2016-03-225:20:58 PM | 34.138 | 67.662 | 70.362 | 33.688 |
| 2016-03-225:21:04 PM | 34.138 | 67.55 | 70.362 | 33.688 |
| 2016-03-225:21:10 PM | 34.138 | 67.438 | 70.25 | 33.688 |
| 2016-03-225:21:16 PM | 34.138 | 67.212 | 70.362 | 33.575 |
| 2016-03-225:21:22 PM | 34.138 | 67.1 | 70.25 | 33.575 |
| 2016-03-225:21:29 PM | 34.138 | 66.988 | 70.25 | 33.462 |
| 2016-03-225:21:35 PM | 34.138 | 66.875 | 70.25 | 33.575 |
| 2016-03-225:21:41 PM | 34.138 | 66.762 | 70.25 | 33.462 |
| 2016-03-225:21:47 PM | 34.138 | 66.538 | 70.25 | 33.462 |
| 2016-03-225:21:53 PM | 34.025 | 66.425 | 70.25 | 33.462 |
| 2016-03-225:22:00 PM | 34.025 | 66.312 | 70.25 | 33.462 |
| 2016-03-225:22:06 PM | 34.025 | 66.2 | 70.25 | 33.462 |
| 2016-03-225:22:12 PM | 34.025 | 66.088 | 70.25 | 33.35 |
| 2016-03-225:22:18 PM | 34.025 | 65.862 | 70.25 | 33.35 |
| 2016-03-225:22:25 PM | 33.912 | 65.75 | 70.25 | 33.35 |
| 2016-03-225:22:31 PM | 33.912 | 65.638 | 70.138 | 33.35 |
| 2016-03-225:22:37 PM | 33.912 | 65.638 | 70.25 | 33.35 |
| 2016-03-225:22:43 PM | 33.912 | 65.638 | 70.25 | 33.35 |
| 2016-03-225:22:49 PM | 33.912 | 65.638 | 70.25 | 33.35 |
| 2016-03-225:22:56 PM | 33.912 | 65.525 | 70.138 | 33.35 |
| 2016-03-225:23:02 PM | 33.912 | 65.412 | 70.138 | 33.35 |
| 2016-03-225:23:08 PM | 33.912 | 65.3 | 70.25 | 33.35 |
| 2016-03-225:23:14 PM | 33.912 | 65.3 | 70.138 | 33.35 |
| 2016-03-225:23:20 PM | 33.912 | 65.188 | 70.138 | 33.35 |
| 2016-03-225:23:27 PM | 33.912 | 65.075 | 70.138 | 33.35 |
| 2016-03-225:23:33 PM | 33.912 | 65.075 | 70.138 | 33.238 |
| 2016-03-225:23:39 PM | 33.912 | 64.963 | 70.138 | 33.238 |
| 2016-03-225:23:44 PM | 33.912 | 64.963 | 70.138 | 33.238 |
| 2016-03-225:23:51 PM | 33.912 | 64.738 | 70.138 | 33.125 |
| 2016-03-225:23:57 PM | 33.912 | 64.738 | 70.138 | 33.125 |
| 2016-03-225:24:03 PM | 33.912 | 64.738 | 70.138 | 33.012 |
| 2016-03-225:24:09 PM | 34.025 | 64.738 | 70.138 | 33.012 |
| 2016-03-225:24:16 PM | 34.025 | 64.625 | 70.138 | 33.012 |
| 2016-03-225:24:22 PM | 33.912 | 64.625 | 70.025 | 33.125 |
| 2016-03-225:24:28 PM | 33.912 | 64.512 | 70.138 | 33.125 |
| 2016-03-225:24:34 PM | 33.912 | 64.625 | 70.138 | 33.125 |
| 2016-03-225:24:40 PM | 33.912 | 64.625 | 70.138 | 33.238 |
| 2016-03-225:24:47 PM | 33.912 | 64.738 | 70.025 | 33.238 |
| 2016-03-225:24:53 PM | 33.912 | 64.625 | 70.138 | 33.238 |
| 2016-03-225:24:59 PM | 33.912 | 64.512 | 70.025 | 33.238 |
| 2016-03-225:25:05 PM | 33.912 | 64.4 | 70.138 | 33.125 |
| 2016-03-225:25:12 PM | 33.912 | 64.4 | 70.025 | 33.125 |
| 2016-03-225:25:18 PM | 33.912 | 64.287 | 70.025 | 33.125 |
| 2016-03-225:25:24 PM | 33.912 | 64.287 | 70.025 | 33.125 |
| 2016-03-225:25:30 PM | 33.912 | 64.287 | 70.025 | 33.125 |
| 2016-03-225:25:36 PM | 33.912 | 64.287 | 70.025 | 33.125 |
| 2016-03-225:25:43 PM | 33.912 | 64.287 | 70.025 | 33.125 |
| 2016-03-225:25:49 PM | 33.912 | 64.175 | 70.025 | 33.125 |
| 2016-03-225:25:55 PM | 33.8 | 64.175 | 70.025 | 33.012 |
| 2016-03-225:26:01 PM | 33.8 | 64.062 | 70.025 | 33.012 |
| 2016-03-225:26:07 PM | 33.8 | 64.062 | 70.025 | 32.9 |
| 2016-03-225:26:14 PM | 33.8 | 64.062 | 70.025 | 32.9 |
| 2016-03-225:26:20 PM | 33.8 | 64.062 | 70.025 | 32.788 |
| 2016-03-225:26:26 PM | 33.8 | 64.062 | 70.025 | 32.788 |
| 2016-03-225:26:32 PM | 33.688 | 64.062 | 70.025 | 32.788 |
| 2016-03-225:26:38 PM | 33.688 | 64.062 | 70.025 | 32.9 |
| 2016-03-225:26:45 PM | 33.8 | 64.287 | 70.025 | 32.9 |
| 2016-03-225:26:50 PM | 33.688 | 64.4 | 69.912 | 32.9 |
| 2016-03-225:26:54 PM | 33.8 | 64.512 | 70.025 | 32.9 |
| 2016-03-225:27:01 PM | 33.688 | 64.512 | 69.912 | 32.788 |
| 2016-03-225:27:07 PM | 33.688 | 64.4 | 70.025 | 32.788 |
| 2016-03-225:27:13 PM | 33.688 | 64.512 | 69.912 | 32.675 |
| 2016-03-225:27:19 PM | 33.688 | 64.625 | 70.025 | 32.562 |
| 2016-03-225:27:26 PM | 33.688 | 64.625 | 69.912 | 32.562 |
| 2016-03-225:27:32 PM | 33.688 | 64.738 | 69.912 | 32.675 |
| 2016-03-225:27:38 PM | 33.688 | 64.625 | 69.912 | 32.675 |
| 2016-03-225:27:44 PM | 33.575 | 64.738 | 69.912 | 32.675 |
| 2016-03-225:27:50 PM | 33.575 | 64.85 | 69.912 | 32.675 |
| 2016-03-225:27:57 PM | 33.575 | 65.075 | 69.912 | 32.562 |
| 2016-03-225:28:01 PM | 33.575 | 64.963 | 69.912 | 32.562 |
| 2016-03-225:28:07 PM | 33.688 | 64.85 | 69.912 | 32.675 |
| 2016-03-225:28:13 PM | 33.575 | 64.85 | 69.912 | 32.562 |
| 2016-03-225:28:20 PM | 33.575 | 64.85 | 69.912 | 32.562 |
| 2016-03-225:28:26 PM | 33.688 | 65.075 | 69.912 | 32.562 |
| 2016-03-225:28:32 PM | 33.688 | 65.188 | 69.912 | 32.45 |
| 2016-03-225:28:38 PM | 33.688 | 65.412 | 69.912 | 32.45 |
| 2016-03-225:28:44 PM | 33.688 | 65.525 | 69.912 | 32.45 |
| 2016-03-225:28:51 PM | 33.688 | 65.412 | 69.912 | 32.45 |
| 2016-03-225:28:57 PM | 33.8 | 65.3 | 69.912 | 32.338 |
| 2016-03-225:29:03 PM | 33.8 | 65.188 | 69.912 | 32.45 |
| 2016-03-225:29:09 PM | 33.8 | 65.3 | 69.912 | 32.45 |
| 2016-03-225:29:15 PM | 33.8 | 65.3 | 69.912 | 32.45 |
| 2016-03-225:29:22 PM | 33.8 | 65.188 | 69.912 | 32.562 |
| 2016-03-225:29:28 PM | 33.8 | 65.188 | 69.912 | 32.562 |
| 2016-03-225:29:34 PM | 33.8 | 65.3 | 69.912 | 32.675 |
| 2016-03-225:29:40 PM | 33.8 | 65.3 | 69.912 | 32.675 |
| 2016-03-225:29:47 PM | 33.688 | 65.188 | 70.025 | 32.788 |
| 2016-03-225:29:53 PM | 33.8 | 65.188 | 69.912 | 32.788 |
| 2016-03-225:29:59 PM | 33.8 | 65.075 | 69.912 | 32.788 |
| 2016-03-225:30:05 PM | 33.688 | 65.075 | 69.912 | 32.9 |
| 2016-03-225:30:11 PM | 33.688 | 64.963 | 69.912 | 33.012 |
| 2016-03-225:30:18 PM | 33.688 | 65.075 | 69.912 | 33.012 |
| 2016-03-225:30:24 PM | 33.688 | 64.963 | 69.912 | 33.012 |
| 2016-03-225:30:30 PM | 33.688 | 64.963 | 69.912 | 33.012 |
| 2016-03-225:30:36 PM | 33.688 | 65.075 | 69.912 | 33.012 |
| 2016-03-225:30:42 PM | 33.688 | 65.188 | 69.912 | 33.012 |
| 2016-03-225:30:49 PM | 33.688 | 65.075 | 69.912 | 32.9 |
| 2016-03-225:30:55 PM | 33.575 | 65.075 | 69.912 | 32.9 |
| 2016-03-225:31:01 PM | 33.575 | 65.075 | 69.912 | 33.012 |
| 2016-03-225:31:07 PM | 33.575 | 65.075 | 69.912 | 32.9 |
| 2016-03-225:31:13 PM | 33.575 | 65.188 | 69.912 | 33.012 |
| 2016-03-225:31:20 PM | 33.575 | 65.412 | 69.912 | 33.012 |
| 2016-03-225:31:26 PM | 33.575 | 65.525 | 69.912 | 32.9 |
| 2016-03-225:31:32 PM | 33.575 | 65.75 | 69.912 | 33.012 |
| 2016-03-225:31:38 PM | 33.575 | 65.975 | 69.912 | 32.9 |
| 2016-03-225:31:44 PM | 33.575 | 65.975 | 69.912 | 32.9 |
| 2016-03-225:31:51 PM | 33.575 | 65.975 | 69.912 | 32.788 |
| 2016-03-225:31:57 PM | 33.575 | 66.2 | 69.912 | 32.675 |
| 2016-03-225:32:03 PM | 33.575 | 66.312 | 69.912 | 32.562 |
| 2016-03-225:32:09 PM | 33.575 | 66.312 | 69.8 | 32.675 |
| 2016-03-225:32:16 PM | 33.575 | 66.425 | 69.912 | 32.562 |
| 2016-03-225:32:22 PM | 33.575 | 66.538 | 69.8 | 32.675 |
| 2016-03-225:32:28 PM | 33.575 | 66.538 | 69.912 | 32.675 |
| 2016-03-225:32:34 PM | 33.688 | 66.538 | 69.8 | 32.562 |
| 2016-03-225:32:40 PM | 33.575 | 66.65 | 69.8 | 32.675 |
| 2016-03-225:32:47 PM | 33.575 | 66.65 | 69.8 | 32.675 |
| 2016-03-225:32:53 PM | 33.575 | 66.65 | 69.8 | 32.562 |
| 2016-03-225:32:59 PM | 33.575 | 66.65 | 69.8 | 32.562 |
| 2016-03-225:33:05 PM | 33.575 | 66.762 | 69.8 | 32.562 |
| 2016-03-225:33:11 PM | 33.688 | 66.65 | 69.8 | 32.675 |
| 2016-03-225:33:18 PM | 33.575 | 66.65 | 69.8 | 32.675 |
| 2016-03-225:33:24 PM | 33.688 | 66.538 | 69.8 | 32.562 |
| 2016-03-225:33:29 PM | 33.688 | 66.65 | 69.8 | 32.562 |
| 2016-03-225:33:36 PM | 33.688 | 66.538 | 69.8 | 32.562 |
| 2016-03-225:33:42 PM | 33.575 | 66.538 | 69.8 | 32.562 |
| 2016-03-225:33:48 PM | 33.575 | 66.538 | 69.8 | 32.675 |
| 2016-03-225:33:54 PM | 33.688 | 66.425 | 69.8 | 32.562 |
| 2016-03-225:34:01 PM | 33.575 | 66.425 | 69.8 | 32.562 |
| 2016-03-225:34:07 PM | 33.575 | 66.425 | 69.8 | 32.562 |
| 2016-03-225:34:13 PM | 33.575 | 66.312 | 69.8 | 32.562 |
| 2016-03-225:34:19 PM | 33.688 | 66.425 | 69.8 | 32.562 |
| 2016-03-225:34:25 PM | 33.688 | 66.538 | 69.8 | 32.562 |
| 2016-03-225:34:31 PM | 33.688 | 66.538 | 69.8 | 32.45 |
| 2016-03-225:34:38 PM | 33.688 | 66.65 | 69.8 | 32.45 |
| 2016-03-225:34:44 PM | 33.688 | 66.538 | 69.8 | 32.562 |
| 2016-03-225:34:50 PM | 33.688 | 66.425 | 69.8 | 32.562 |
| 2016-03-225:34:56 PM | 33.688 | 66.312 | 69.8 | 32.562 |